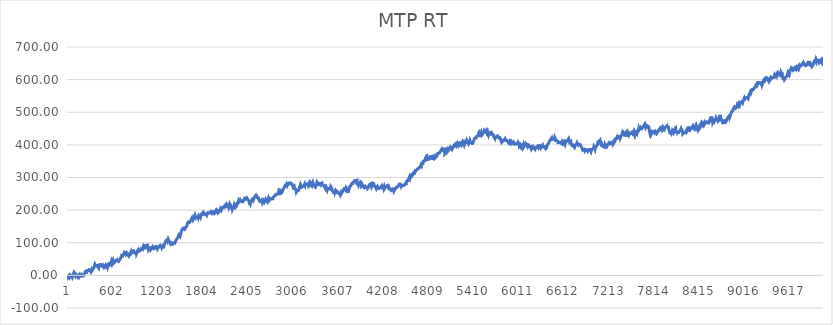
| Category | MTP RT |
|---|---|
| 0 | 0.98 |
| 1 | -0.58 |
| 2 | 0.42 |
| 3 | -1.83 |
| 4 | -4.23 |
| 5 | -5.357 |
| 6 | -4.363 |
| 7 | -3.37 |
| 8 | -2.373 |
| 9 | -1.377 |
| 10 | -2.94 |
| 11 | -1.96 |
| 12 | -0.96 |
| 13 | -3.41 |
| 14 | -2.41 |
| 15 | -1.43 |
| 16 | -2.33 |
| 17 | -1.35 |
| 18 | -3.17 |
| 19 | -5.15 |
| 20 | -6.91 |
| 21 | -5.91 |
| 22 | -4.93 |
| 23 | -3.95 |
| 24 | -2.97 |
| 25 | -1.99 |
| 26 | -3.81 |
| 27 | -2.81 |
| 28 | -1.83 |
| 29 | -0.85 |
| 30 | 0.13 |
| 31 | 1.11 |
| 32 | 2.107 |
| 33 | 0.503 |
| 34 | 1.5 |
| 35 | 0 |
| 36 | 1 |
| 37 | 0.61 |
| 38 | 1.607 |
| 39 | 0.243 |
| 40 | 1.24 |
| 41 | -1.26 |
| 42 | -0.263 |
| 43 | -1.567 |
| 44 | -0.57 |
| 45 | -2.19 |
| 46 | -2.745 |
| 47 | -1.75 |
| 48 | -3.273 |
| 49 | -2.277 |
| 50 | -1.28 |
| 51 | -4.13 |
| 52 | -3.15 |
| 53 | -2.17 |
| 54 | -4.87 |
| 55 | -6.71 |
| 56 | -5.71 |
| 57 | -4.73 |
| 58 | -5.777 |
| 59 | -4.783 |
| 60 | -3.79 |
| 61 | -2.81 |
| 62 | -1.83 |
| 63 | -0.85 |
| 64 | 0.13 |
| 65 | 1.11 |
| 66 | 0.09 |
| 67 | 1.07 |
| 68 | 2.05 |
| 69 | 3.03 |
| 70 | 4.01 |
| 71 | 4.99 |
| 72 | 5.97 |
| 73 | 6.967 |
| 74 | 4.615 |
| 75 | 5.612 |
| 76 | 6.61 |
| 77 | 7.59 |
| 78 | 8.57 |
| 79 | 9.55 |
| 80 | 10.53 |
| 81 | 8.43 |
| 82 | 7.29 |
| 83 | 8.29 |
| 84 | 6.51 |
| 85 | 7.51 |
| 86 | 4.76 |
| 87 | 5.76 |
| 88 | 3.31 |
| 89 | 1.45 |
| 90 | 2.45 |
| 91 | 0.45 |
| 92 | 1.45 |
| 93 | 0.825 |
| 94 | 1.82 |
| 95 | 2.82 |
| 96 | 0.67 |
| 97 | -1.88 |
| 98 | -0.9 |
| 99 | -1.92 |
| 100 | -0.94 |
| 101 | 0.04 |
| 102 | 1.02 |
| 103 | 2 |
| 104 | -0.2 |
| 105 | 0.78 |
| 106 | -0.22 |
| 107 | 0.76 |
| 108 | -0.26 |
| 109 | 0.74 |
| 110 | -0.66 |
| 111 | 0.34 |
| 112 | -2.06 |
| 113 | -1.06 |
| 114 | -3.06 |
| 115 | -4.24 |
| 116 | -3.26 |
| 117 | -2.28 |
| 118 | -3.92 |
| 119 | -2.92 |
| 120 | -4.08 |
| 121 | -3.1 |
| 122 | -2.1 |
| 123 | -2.94 |
| 124 | -1.96 |
| 125 | -0.98 |
| 126 | 0.02 |
| 127 | -2.88 |
| 128 | -1.9 |
| 129 | -0.92 |
| 130 | 0.06 |
| 131 | 1.06 |
| 132 | -1.49 |
| 133 | -4.34 |
| 134 | -5.13 |
| 135 | -4.13 |
| 136 | -3.15 |
| 137 | -2.17 |
| 138 | -3.53 |
| 139 | -4.46 |
| 140 | -3.48 |
| 141 | -2.5 |
| 142 | -1.52 |
| 143 | -0.54 |
| 144 | -1.54 |
| 145 | -3.06 |
| 146 | -2.06 |
| 147 | -1.08 |
| 148 | -2.1 |
| 149 | -3.94 |
| 150 | -2.96 |
| 151 | -1.98 |
| 152 | -3.8 |
| 153 | -2.8 |
| 154 | -1.82 |
| 155 | -0.823 |
| 156 | -2.207 |
| 157 | -1.21 |
| 158 | -2.23 |
| 159 | -1.23 |
| 160 | -3.73 |
| 161 | -5.78 |
| 162 | -4.8 |
| 163 | -3.82 |
| 164 | -2.84 |
| 165 | -1.86 |
| 166 | -0.88 |
| 167 | 0.1 |
| 168 | -1.95 |
| 169 | -0.95 |
| 170 | 0.047 |
| 171 | -1.397 |
| 172 | -0.4 |
| 173 | -1.78 |
| 174 | -0.78 |
| 175 | 0.2 |
| 176 | 1.18 |
| 177 | -0.06 |
| 178 | 0.92 |
| 179 | 1.9 |
| 180 | 0.06 |
| 181 | 1.06 |
| 182 | 2.06 |
| 183 | 0.06 |
| 184 | -1.1 |
| 185 | -0.1 |
| 186 | -0.95 |
| 187 | 0.03 |
| 188 | -1.97 |
| 189 | -0.99 |
| 190 | -0.01 |
| 191 | 0.99 |
| 192 | -0.85 |
| 193 | -3.65 |
| 194 | -2.67 |
| 195 | -1.69 |
| 196 | -0.71 |
| 197 | 0.29 |
| 198 | -1.55 |
| 199 | -2.81 |
| 200 | -4.11 |
| 201 | -3.11 |
| 202 | -2.13 |
| 203 | -1.15 |
| 204 | -0.17 |
| 205 | 0.81 |
| 206 | 1.79 |
| 207 | 1.04 |
| 208 | 2.02 |
| 209 | 3 |
| 210 | 1.6 |
| 211 | 2.6 |
| 212 | 3.6 |
| 213 | 1.86 |
| 214 | 2.84 |
| 215 | 3.82 |
| 216 | 2.673 |
| 217 | 3.667 |
| 218 | 4.66 |
| 219 | 3.83 |
| 220 | 4.83 |
| 221 | 5.81 |
| 222 | 6.79 |
| 223 | 7.78 |
| 224 | 8.78 |
| 225 | 6.68 |
| 226 | 7.66 |
| 227 | 8.66 |
| 228 | 6.21 |
| 229 | 7.19 |
| 230 | 8.17 |
| 231 | 9.15 |
| 232 | 10.13 |
| 233 | 11.11 |
| 234 | 12.11 |
| 235 | 13.11 |
| 236 | 10.91 |
| 237 | 11.89 |
| 238 | 12.87 |
| 239 | 13.85 |
| 240 | 12.61 |
| 241 | 11.443 |
| 242 | 12.437 |
| 243 | 13.43 |
| 244 | 11.55 |
| 245 | 12.55 |
| 246 | 10.61 |
| 247 | 11.59 |
| 248 | 10.41 |
| 249 | 11.39 |
| 250 | 12.37 |
| 251 | 13.35 |
| 252 | 14.33 |
| 253 | 13.34 |
| 254 | 14.34 |
| 255 | 15.32 |
| 256 | 14.52 |
| 257 | 15.52 |
| 258 | 14.69 |
| 259 | 13.03 |
| 260 | 14.03 |
| 261 | 15.028 |
| 262 | 16.025 |
| 263 | 17.022 |
| 264 | 14.47 |
| 265 | 13.05 |
| 266 | 14.05 |
| 267 | 12.89 |
| 268 | 13.87 |
| 269 | 12.19 |
| 270 | 13.17 |
| 271 | 14.15 |
| 272 | 15.13 |
| 273 | 16.11 |
| 274 | 14.23 |
| 275 | 15.23 |
| 276 | 16.23 |
| 277 | 14.23 |
| 278 | 15.23 |
| 279 | 16.23 |
| 280 | 17.21 |
| 281 | 18.19 |
| 282 | 19.17 |
| 283 | 20.15 |
| 284 | 18.55 |
| 285 | 19.55 |
| 286 | 18.39 |
| 287 | 19.37 |
| 288 | 17.71 |
| 289 | 18.71 |
| 290 | 16.93 |
| 291 | 17.93 |
| 292 | 15.93 |
| 293 | 16.93 |
| 294 | 15.65 |
| 295 | 14.11 |
| 296 | 15.09 |
| 297 | 16.07 |
| 298 | 15.14 |
| 299 | 13.76 |
| 300 | 14.76 |
| 301 | 12.46 |
| 302 | 13.46 |
| 303 | 14.44 |
| 304 | 12.56 |
| 305 | 13.54 |
| 306 | 14.52 |
| 307 | 15.5 |
| 308 | 14.54 |
| 309 | 15.52 |
| 310 | 16.5 |
| 311 | 17.48 |
| 312 | 14.93 |
| 313 | 12.38 |
| 314 | 13.38 |
| 315 | 11.64 |
| 316 | 12.64 |
| 317 | 11.56 |
| 318 | 12.56 |
| 319 | 13.54 |
| 320 | 13.18 |
| 321 | 14.16 |
| 322 | 15.14 |
| 323 | 16.12 |
| 324 | 17.1 |
| 325 | 18.08 |
| 326 | 19.08 |
| 327 | 16.63 |
| 328 | 17.61 |
| 329 | 18.61 |
| 330 | 15.91 |
| 331 | 16.89 |
| 332 | 17.87 |
| 333 | 18.85 |
| 334 | 19.85 |
| 335 | 17.6 |
| 336 | 18.58 |
| 337 | 19.56 |
| 338 | 20.54 |
| 339 | 21.54 |
| 340 | 19.14 |
| 341 | 20.12 |
| 342 | 21.1 |
| 343 | 22.08 |
| 344 | 23.06 |
| 345 | 24.04 |
| 346 | 22.592 |
| 347 | 23.585 |
| 348 | 24.578 |
| 349 | 25.57 |
| 350 | 26.55 |
| 351 | 27.53 |
| 352 | 28.51 |
| 353 | 29.49 |
| 354 | 30.47 |
| 355 | 31.45 |
| 356 | 32.43 |
| 357 | 33.41 |
| 358 | 34.41 |
| 359 | 35.41 |
| 360 | 33.41 |
| 361 | 34.407 |
| 362 | 32.843 |
| 363 | 33.84 |
| 364 | 34.84 |
| 365 | 33.3 |
| 366 | 31.4 |
| 367 | 32.4 |
| 368 | 30.7 |
| 369 | 31.7 |
| 370 | 28.9 |
| 371 | 29.88 |
| 372 | 27.28 |
| 373 | 28.26 |
| 374 | 29.24 |
| 375 | 30.22 |
| 376 | 31.2 |
| 377 | 32.197 |
| 378 | 30.573 |
| 379 | 31.57 |
| 380 | 32.55 |
| 381 | 33.53 |
| 382 | 34.51 |
| 383 | 32.41 |
| 384 | 29.56 |
| 385 | 28.4 |
| 386 | 29.4 |
| 387 | 28 |
| 388 | 26.54 |
| 389 | 27.54 |
| 390 | 26.91 |
| 391 | 27.9 |
| 392 | 28.89 |
| 393 | 27.31 |
| 394 | 28.31 |
| 395 | 29.29 |
| 396 | 26.44 |
| 397 | 24.96 |
| 398 | 25.94 |
| 399 | 26.92 |
| 400 | 27.9 |
| 401 | 28.88 |
| 402 | 27.62 |
| 403 | 25.7 |
| 404 | 26.7 |
| 405 | 24.74 |
| 406 | 25.74 |
| 407 | 23.9 |
| 408 | 22.297 |
| 409 | 23.293 |
| 410 | 24.29 |
| 411 | 25.27 |
| 412 | 26.25 |
| 413 | 27.23 |
| 414 | 28.21 |
| 415 | 29.19 |
| 416 | 30.17 |
| 417 | 31.17 |
| 418 | 29.59 |
| 419 | 30.57 |
| 420 | 31.55 |
| 421 | 32.53 |
| 422 | 33.51 |
| 423 | 34.49 |
| 424 | 35.49 |
| 425 | 33.39 |
| 426 | 32.37 |
| 427 | 33.37 |
| 428 | 30.77 |
| 429 | 31.765 |
| 430 | 32.76 |
| 431 | 30.555 |
| 432 | 31.55 |
| 433 | 32.53 |
| 434 | 33.51 |
| 435 | 34.49 |
| 436 | 33.37 |
| 437 | 31.02 |
| 438 | 32 |
| 439 | 30.557 |
| 440 | 31.553 |
| 441 | 32.55 |
| 442 | 31.805 |
| 443 | 32.8 |
| 444 | 33.8 |
| 445 | 31.2 |
| 446 | 29.64 |
| 447 | 30.62 |
| 448 | 28.27 |
| 449 | 29.25 |
| 450 | 30.23 |
| 451 | 31.21 |
| 452 | 32.19 |
| 453 | 29.39 |
| 454 | 28.19 |
| 455 | 29.19 |
| 456 | 30.17 |
| 457 | 31.15 |
| 458 | 32.13 |
| 459 | 31.44 |
| 460 | 32.42 |
| 461 | 33.42 |
| 462 | 31.42 |
| 463 | 32.42 |
| 464 | 30.02 |
| 465 | 31.02 |
| 466 | 32.02 |
| 467 | 29.42 |
| 468 | 30.4 |
| 469 | 27.7 |
| 470 | 28.68 |
| 471 | 29.66 |
| 472 | 27.86 |
| 473 | 26.42 |
| 474 | 27.4 |
| 475 | 28.38 |
| 476 | 27.67 |
| 477 | 25.79 |
| 478 | 23.93 |
| 479 | 24.91 |
| 480 | 25.89 |
| 481 | 26.87 |
| 482 | 24.93 |
| 483 | 25.93 |
| 484 | 26.91 |
| 485 | 25.33 |
| 486 | 26.33 |
| 487 | 25.01 |
| 488 | 25.99 |
| 489 | 26.97 |
| 490 | 27.95 |
| 491 | 28.93 |
| 492 | 29.93 |
| 493 | 27.23 |
| 494 | 28.21 |
| 495 | 27.203 |
| 496 | 28.197 |
| 497 | 29.19 |
| 498 | 30.17 |
| 499 | 31.15 |
| 500 | 30.55 |
| 501 | 31.53 |
| 502 | 30.41 |
| 503 | 28.47 |
| 504 | 29.45 |
| 505 | 30.45 |
| 506 | 28.49 |
| 507 | 26.65 |
| 508 | 24.4 |
| 509 | 25.38 |
| 510 | 26.36 |
| 511 | 25.333 |
| 512 | 26.327 |
| 513 | 27.32 |
| 514 | 28.3 |
| 515 | 29.28 |
| 516 | 27.797 |
| 517 | 28.793 |
| 518 | 29.79 |
| 519 | 30.77 |
| 520 | 31.77 |
| 521 | 28.97 |
| 522 | 29.97 |
| 523 | 27.07 |
| 524 | 28.07 |
| 525 | 25.27 |
| 526 | 26.25 |
| 527 | 27.23 |
| 528 | 28.21 |
| 529 | 29.19 |
| 530 | 27.09 |
| 531 | 28.07 |
| 532 | 26.79 |
| 533 | 27.77 |
| 534 | 28.75 |
| 535 | 29.73 |
| 536 | 30.71 |
| 537 | 31.69 |
| 538 | 32.67 |
| 539 | 33.65 |
| 540 | 34.65 |
| 541 | 31.9 |
| 542 | 32.88 |
| 543 | 33.86 |
| 544 | 34.84 |
| 545 | 35.835 |
| 546 | 33.83 |
| 547 | 34.825 |
| 548 | 35.82 |
| 549 | 36.82 |
| 550 | 35.38 |
| 551 | 34.735 |
| 552 | 35.73 |
| 553 | 36.73 |
| 554 | 34.79 |
| 555 | 35.77 |
| 556 | 36.77 |
| 557 | 35.65 |
| 558 | 36.63 |
| 559 | 37.61 |
| 560 | 36.13 |
| 561 | 37.13 |
| 562 | 34.53 |
| 563 | 35.51 |
| 564 | 33.97 |
| 565 | 34.95 |
| 566 | 35.93 |
| 567 | 34.15 |
| 568 | 35.15 |
| 569 | 36.15 |
| 570 | 34.39 |
| 571 | 35.37 |
| 572 | 36.35 |
| 573 | 37.33 |
| 574 | 38.31 |
| 575 | 39.29 |
| 576 | 40.27 |
| 577 | 41.25 |
| 578 | 42.23 |
| 579 | 40.23 |
| 580 | 41.21 |
| 581 | 39.75 |
| 582 | 40.75 |
| 583 | 38.83 |
| 584 | 39.83 |
| 585 | 40.81 |
| 586 | 41.79 |
| 587 | 42.77 |
| 588 | 41.07 |
| 589 | 38.72 |
| 590 | 39.7 |
| 591 | 40.68 |
| 592 | 41.68 |
| 593 | 39.33 |
| 594 | 40.31 |
| 595 | 41.29 |
| 596 | 42.27 |
| 597 | 41.95 |
| 598 | 42.93 |
| 599 | 43.91 |
| 600 | 44.89 |
| 601 | 45.87 |
| 602 | 46.85 |
| 603 | 47.85 |
| 604 | 45.15 |
| 605 | 43.65 |
| 606 | 42.17 |
| 607 | 40.43 |
| 608 | 41.43 |
| 609 | 40.27 |
| 610 | 41.27 |
| 611 | 39.73 |
| 612 | 38.21 |
| 613 | 39.21 |
| 614 | 40.19 |
| 615 | 41.17 |
| 616 | 40.27 |
| 617 | 39.37 |
| 618 | 40.37 |
| 619 | 37.92 |
| 620 | 38.92 |
| 621 | 39.92 |
| 622 | 38.44 |
| 623 | 39.42 |
| 624 | 40.4 |
| 625 | 41.397 |
| 626 | 39.813 |
| 627 | 40.81 |
| 628 | 41.79 |
| 629 | 42.77 |
| 630 | 43.77 |
| 631 | 41.32 |
| 632 | 39.86 |
| 633 | 40.86 |
| 634 | 41.84 |
| 635 | 42.82 |
| 636 | 43.8 |
| 637 | 44.78 |
| 638 | 45.76 |
| 639 | 46.76 |
| 640 | 44.94 |
| 641 | 45.94 |
| 642 | 44.4 |
| 643 | 42 |
| 644 | 42.98 |
| 645 | 42.17 |
| 646 | 43.17 |
| 647 | 44.15 |
| 648 | 45.13 |
| 649 | 46.11 |
| 650 | 47.09 |
| 651 | 48.09 |
| 652 | 46.15 |
| 653 | 47.15 |
| 654 | 45.43 |
| 655 | 46.41 |
| 656 | 47.39 |
| 657 | 45.67 |
| 658 | 46.67 |
| 659 | 44.91 |
| 660 | 44.17 |
| 661 | 45.15 |
| 662 | 46.15 |
| 663 | 44.37 |
| 664 | 45.35 |
| 665 | 46.33 |
| 666 | 45.413 |
| 667 | 46.407 |
| 668 | 47.4 |
| 669 | 45.78 |
| 670 | 43.18 |
| 671 | 44.16 |
| 672 | 45.16 |
| 673 | 42.81 |
| 674 | 43.79 |
| 675 | 44.77 |
| 676 | 43.61 |
| 677 | 43.055 |
| 678 | 44.05 |
| 679 | 43.435 |
| 680 | 44.43 |
| 681 | 45.41 |
| 682 | 46.39 |
| 683 | 47.37 |
| 684 | 48.35 |
| 685 | 49.33 |
| 686 | 46.78 |
| 687 | 47.76 |
| 688 | 48.74 |
| 689 | 47.83 |
| 690 | 46.81 |
| 691 | 47.79 |
| 692 | 46.96 |
| 693 | 47.94 |
| 694 | 48.92 |
| 695 | 49.9 |
| 696 | 50.88 |
| 697 | 51.86 |
| 698 | 50.99 |
| 699 | 51.99 |
| 700 | 52.97 |
| 701 | 53.97 |
| 702 | 51.72 |
| 703 | 52.72 |
| 704 | 51.08 |
| 705 | 52.08 |
| 706 | 53.06 |
| 707 | 54.04 |
| 708 | 55.02 |
| 709 | 56 |
| 710 | 56.98 |
| 711 | 57.96 |
| 712 | 58.94 |
| 713 | 59.92 |
| 714 | 60.9 |
| 715 | 61.88 |
| 716 | 62.86 |
| 717 | 60.76 |
| 718 | 57.96 |
| 719 | 58.94 |
| 720 | 59.92 |
| 721 | 60.9 |
| 722 | 61.88 |
| 723 | 61.375 |
| 724 | 62.37 |
| 725 | 61.52 |
| 726 | 62.5 |
| 727 | 61.16 |
| 728 | 59.64 |
| 729 | 60.64 |
| 730 | 59.553 |
| 731 | 60.547 |
| 732 | 61.54 |
| 733 | 62.52 |
| 734 | 63.5 |
| 735 | 64.48 |
| 736 | 62.64 |
| 737 | 63.62 |
| 738 | 64.6 |
| 739 | 62.98 |
| 740 | 61.74 |
| 741 | 62.72 |
| 742 | 61.74 |
| 743 | 62.74 |
| 744 | 63.72 |
| 745 | 64.7 |
| 746 | 65.68 |
| 747 | 66.66 |
| 748 | 67.64 |
| 749 | 68.62 |
| 750 | 69.612 |
| 751 | 70.605 |
| 752 | 71.597 |
| 753 | 69.95 |
| 754 | 70.93 |
| 755 | 71.91 |
| 756 | 69.99 |
| 757 | 70.99 |
| 758 | 69.75 |
| 759 | 68.65 |
| 760 | 69.65 |
| 761 | 68.925 |
| 762 | 69.92 |
| 763 | 69.14 |
| 764 | 67.84 |
| 765 | 68.84 |
| 766 | 69.82 |
| 767 | 67.82 |
| 768 | 68.8 |
| 769 | 67.04 |
| 770 | 65.28 |
| 771 | 66.26 |
| 772 | 67.26 |
| 773 | 65.16 |
| 774 | 66.16 |
| 775 | 65.16 |
| 776 | 66.16 |
| 777 | 67.14 |
| 778 | 68.12 |
| 779 | 69.1 |
| 780 | 70.08 |
| 781 | 69.28 |
| 782 | 70.26 |
| 783 | 69.73 |
| 784 | 69.03 |
| 785 | 70.03 |
| 786 | 68.03 |
| 787 | 66.29 |
| 788 | 67.29 |
| 789 | 65.39 |
| 790 | 66.39 |
| 791 | 67.37 |
| 792 | 68.37 |
| 793 | 66.32 |
| 794 | 64.22 |
| 795 | 65.2 |
| 796 | 63.8 |
| 797 | 64.8 |
| 798 | 63.6 |
| 799 | 64.6 |
| 800 | 65.58 |
| 801 | 63.13 |
| 802 | 60.98 |
| 803 | 61.98 |
| 804 | 62.96 |
| 805 | 63.94 |
| 806 | 64.94 |
| 807 | 65.94 |
| 808 | 63.54 |
| 809 | 60.99 |
| 810 | 61.97 |
| 811 | 62.95 |
| 812 | 63.93 |
| 813 | 64.91 |
| 814 | 65.89 |
| 815 | 66.89 |
| 816 | 67.89 |
| 817 | 65.93 |
| 818 | 66.91 |
| 819 | 67.91 |
| 820 | 68.91 |
| 821 | 66.06 |
| 822 | 64.9 |
| 823 | 65.88 |
| 824 | 65.36 |
| 825 | 63.11 |
| 826 | 64.09 |
| 827 | 65.07 |
| 828 | 66.05 |
| 829 | 67.03 |
| 830 | 68.01 |
| 831 | 69.007 |
| 832 | 70.003 |
| 833 | 68.26 |
| 834 | 69.24 |
| 835 | 70.22 |
| 836 | 71.2 |
| 837 | 72.18 |
| 838 | 70.08 |
| 839 | 67.33 |
| 840 | 68.31 |
| 841 | 69.29 |
| 842 | 70.27 |
| 843 | 71.25 |
| 844 | 72.23 |
| 845 | 73.21 |
| 846 | 74.19 |
| 847 | 75.17 |
| 848 | 74.03 |
| 849 | 71.48 |
| 850 | 72.46 |
| 851 | 73.452 |
| 852 | 71.785 |
| 853 | 72.777 |
| 854 | 73.77 |
| 855 | 72.07 |
| 856 | 73.07 |
| 857 | 74.05 |
| 858 | 75.03 |
| 859 | 76.01 |
| 860 | 74.67 |
| 861 | 75.65 |
| 862 | 76.63 |
| 863 | 77.63 |
| 864 | 76.51 |
| 865 | 75.29 |
| 866 | 76.27 |
| 867 | 77.25 |
| 868 | 74.35 |
| 869 | 75.33 |
| 870 | 76.31 |
| 871 | 77.31 |
| 872 | 75.39 |
| 873 | 76.39 |
| 874 | 74.49 |
| 875 | 71.84 |
| 876 | 69.49 |
| 877 | 70.49 |
| 878 | 68.63 |
| 879 | 69.61 |
| 880 | 70.59 |
| 881 | 71.57 |
| 882 | 72.55 |
| 883 | 71.33 |
| 884 | 72.33 |
| 885 | 70.59 |
| 886 | 68.09 |
| 887 | 69.07 |
| 888 | 67.85 |
| 889 | 68.83 |
| 890 | 69.81 |
| 891 | 67.89 |
| 892 | 66.85 |
| 893 | 67.85 |
| 894 | 68.83 |
| 895 | 69.81 |
| 896 | 70.79 |
| 897 | 69.23 |
| 898 | 67.03 |
| 899 | 66.1 |
| 900 | 67.1 |
| 901 | 64.85 |
| 902 | 65.83 |
| 903 | 66.81 |
| 904 | 67.79 |
| 905 | 68.77 |
| 906 | 69.75 |
| 907 | 68.37 |
| 908 | 69.37 |
| 909 | 70.37 |
| 910 | 67.97 |
| 911 | 66.67 |
| 912 | 67.67 |
| 913 | 68.667 |
| 914 | 66.923 |
| 915 | 67.92 |
| 916 | 68.9 |
| 917 | 69.88 |
| 918 | 70.86 |
| 919 | 71.84 |
| 920 | 72.82 |
| 921 | 73.8 |
| 922 | 74.78 |
| 923 | 73.48 |
| 924 | 74.46 |
| 925 | 75.44 |
| 926 | 74.04 |
| 927 | 75.04 |
| 928 | 72.89 |
| 929 | 73.87 |
| 930 | 74.85 |
| 931 | 75.83 |
| 932 | 76.81 |
| 933 | 77.79 |
| 934 | 77.28 |
| 935 | 74.93 |
| 936 | 75.93 |
| 937 | 73.58 |
| 938 | 72.22 |
| 939 | 73.2 |
| 940 | 74.18 |
| 941 | 72.52 |
| 942 | 71.22 |
| 943 | 72.22 |
| 944 | 73.22 |
| 945 | 70.82 |
| 946 | 71.8 |
| 947 | 72.78 |
| 948 | 73.76 |
| 949 | 74.74 |
| 950 | 73.1 |
| 951 | 74.1 |
| 952 | 75.08 |
| 953 | 76.06 |
| 954 | 74.9 |
| 955 | 75.9 |
| 956 | 74.813 |
| 957 | 75.807 |
| 958 | 76.8 |
| 959 | 75.87 |
| 960 | 74.65 |
| 961 | 75.65 |
| 962 | 76.63 |
| 963 | 77.61 |
| 964 | 78.61 |
| 965 | 75.91 |
| 966 | 76.89 |
| 967 | 76.19 |
| 968 | 77.17 |
| 969 | 78.15 |
| 970 | 79.148 |
| 971 | 80.145 |
| 972 | 81.143 |
| 973 | 78.44 |
| 974 | 79.42 |
| 975 | 78.293 |
| 976 | 79.287 |
| 977 | 80.28 |
| 978 | 81.26 |
| 979 | 82.24 |
| 980 | 83.22 |
| 981 | 81.72 |
| 982 | 79.52 |
| 983 | 80.5 |
| 984 | 81.5 |
| 985 | 78.9 |
| 986 | 79.9 |
| 987 | 78.82 |
| 988 | 79.8 |
| 989 | 80.78 |
| 990 | 81.76 |
| 991 | 82.74 |
| 992 | 83.72 |
| 993 | 84.72 |
| 994 | 82.57 |
| 995 | 83.55 |
| 996 | 84.53 |
| 997 | 85.51 |
| 998 | 86.49 |
| 999 | 87.47 |
| 1000 | 88.45 |
| 1001 | 86.45 |
| 1002 | 86.04 |
| 1003 | 84.1 |
| 1004 | 85.1 |
| 1005 | 86.1 |
| 1006 | 84.24 |
| 1007 | 85.24 |
| 1008 | 86.24 |
| 1009 | 87.22 |
| 1010 | 88.2 |
| 1011 | 89.18 |
| 1012 | 87.08 |
| 1013 | 88.08 |
| 1014 | 89.06 |
| 1015 | 90.04 |
| 1016 | 91.02 |
| 1017 | 92 |
| 1018 | 92.98 |
| 1019 | 91.78 |
| 1020 | 92.777 |
| 1021 | 91.213 |
| 1022 | 92.21 |
| 1023 | 93.19 |
| 1024 | 91.51 |
| 1025 | 90.19 |
| 1026 | 91.19 |
| 1027 | 92.19 |
| 1028 | 89.74 |
| 1029 | 90.72 |
| 1030 | 91.7 |
| 1031 | 89.84 |
| 1032 | 90.82 |
| 1033 | 88.57 |
| 1034 | 89.57 |
| 1035 | 88.15 |
| 1036 | 86.35 |
| 1037 | 87.35 |
| 1038 | 88.35 |
| 1039 | 89.33 |
| 1040 | 90.31 |
| 1041 | 91.29 |
| 1042 | 92.27 |
| 1043 | 91.03 |
| 1044 | 92.01 |
| 1045 | 90.81 |
| 1046 | 91.803 |
| 1047 | 90.697 |
| 1048 | 91.69 |
| 1049 | 92.69 |
| 1050 | 90.89 |
| 1051 | 91.89 |
| 1052 | 92.87 |
| 1053 | 91.92 |
| 1054 | 90.88 |
| 1055 | 91.88 |
| 1056 | 92.88 |
| 1057 | 90.18 |
| 1058 | 88.7 |
| 1059 | 87.66 |
| 1060 | 86.18 |
| 1061 | 85 |
| 1062 | 86 |
| 1063 | 85.07 |
| 1064 | 83.02 |
| 1065 | 82.09 |
| 1066 | 80.57 |
| 1067 | 81.57 |
| 1068 | 80.49 |
| 1069 | 81.47 |
| 1070 | 82.45 |
| 1071 | 83.43 |
| 1072 | 84.43 |
| 1073 | 83.03 |
| 1074 | 84.01 |
| 1075 | 84.99 |
| 1076 | 85.99 |
| 1077 | 83.79 |
| 1078 | 84.79 |
| 1079 | 82.44 |
| 1080 | 80.86 |
| 1081 | 81.84 |
| 1082 | 82.82 |
| 1083 | 80.94 |
| 1084 | 79.02 |
| 1085 | 80.02 |
| 1086 | 81 |
| 1087 | 81.98 |
| 1088 | 82.96 |
| 1089 | 83.94 |
| 1090 | 84.92 |
| 1091 | 85.9 |
| 1092 | 86.88 |
| 1093 | 87.86 |
| 1094 | 88.86 |
| 1095 | 86.11 |
| 1096 | 87.11 |
| 1097 | 85.67 |
| 1098 | 83.47 |
| 1099 | 81.69 |
| 1100 | 82.69 |
| 1101 | 80.04 |
| 1102 | 78.813 |
| 1103 | 79.807 |
| 1104 | 80.8 |
| 1105 | 81.78 |
| 1106 | 82.777 |
| 1107 | 81.033 |
| 1108 | 82.03 |
| 1109 | 83.03 |
| 1110 | 82.08 |
| 1111 | 83.06 |
| 1112 | 84.04 |
| 1113 | 85.02 |
| 1114 | 83.28 |
| 1115 | 81.4 |
| 1116 | 82.4 |
| 1117 | 83.38 |
| 1118 | 84.36 |
| 1119 | 85.34 |
| 1120 | 84.38 |
| 1121 | 85.38 |
| 1122 | 86.36 |
| 1123 | 87.36 |
| 1124 | 85.26 |
| 1125 | 86.26 |
| 1126 | 84.42 |
| 1127 | 85.4 |
| 1128 | 82.85 |
| 1129 | 81.71 |
| 1130 | 82.69 |
| 1131 | 83.67 |
| 1132 | 80.92 |
| 1133 | 81.9 |
| 1134 | 80.4 |
| 1135 | 81.38 |
| 1136 | 82.36 |
| 1137 | 81.43 |
| 1138 | 82.43 |
| 1139 | 81.05 |
| 1140 | 82.03 |
| 1141 | 83.027 |
| 1142 | 81.483 |
| 1143 | 82.48 |
| 1144 | 81.92 |
| 1145 | 81.32 |
| 1146 | 82.3 |
| 1147 | 83.28 |
| 1148 | 81.56 |
| 1149 | 82.54 |
| 1150 | 83.533 |
| 1151 | 84.525 |
| 1152 | 82.838 |
| 1153 | 83.83 |
| 1154 | 84.81 |
| 1155 | 85.79 |
| 1156 | 86.79 |
| 1157 | 84.97 |
| 1158 | 85.97 |
| 1159 | 86.95 |
| 1160 | 87.93 |
| 1161 | 88.91 |
| 1162 | 89.89 |
| 1163 | 89.445 |
| 1164 | 90.44 |
| 1165 | 89.08 |
| 1166 | 87.6 |
| 1167 | 88.6 |
| 1168 | 87.88 |
| 1169 | 88.86 |
| 1170 | 89.86 |
| 1171 | 87.61 |
| 1172 | 88.59 |
| 1173 | 87.69 |
| 1174 | 88.69 |
| 1175 | 87.03 |
| 1176 | 88.01 |
| 1177 | 88.99 |
| 1178 | 87.41 |
| 1179 | 88.39 |
| 1180 | 85.94 |
| 1181 | 84.72 |
| 1182 | 85.7 |
| 1183 | 86.7 |
| 1184 | 84.65 |
| 1185 | 82.15 |
| 1186 | 83.13 |
| 1187 | 81.77 |
| 1188 | 80.81 |
| 1189 | 79.73 |
| 1190 | 80.73 |
| 1191 | 79.53 |
| 1192 | 80.51 |
| 1193 | 81.49 |
| 1194 | 82.47 |
| 1195 | 83.45 |
| 1196 | 84.43 |
| 1197 | 83.8 |
| 1198 | 84.78 |
| 1199 | 85.76 |
| 1200 | 86.74 |
| 1201 | 84.98 |
| 1202 | 83.833 |
| 1203 | 84.827 |
| 1204 | 85.82 |
| 1205 | 84.693 |
| 1206 | 85.687 |
| 1207 | 86.68 |
| 1208 | 87.66 |
| 1209 | 86.54 |
| 1210 | 87.54 |
| 1211 | 85.44 |
| 1212 | 86.44 |
| 1213 | 87.42 |
| 1214 | 86.2 |
| 1215 | 87.2 |
| 1216 | 88.18 |
| 1217 | 89.16 |
| 1218 | 90.14 |
| 1219 | 89.08 |
| 1220 | 90.08 |
| 1221 | 91.06 |
| 1222 | 90.555 |
| 1223 | 91.55 |
| 1224 | 92.55 |
| 1225 | 91.33 |
| 1226 | 90.55 |
| 1227 | 87.6 |
| 1228 | 86.69 |
| 1229 | 85.43 |
| 1230 | 86.43 |
| 1231 | 87.41 |
| 1232 | 88.39 |
| 1233 | 86.97 |
| 1234 | 87.97 |
| 1235 | 85.32 |
| 1236 | 86.3 |
| 1237 | 87.28 |
| 1238 | 88.28 |
| 1239 | 89.28 |
| 1240 | 87.36 |
| 1241 | 88.36 |
| 1242 | 86.4 |
| 1243 | 87.38 |
| 1244 | 86.3 |
| 1245 | 87.3 |
| 1246 | 85.2 |
| 1247 | 83.46 |
| 1248 | 84.46 |
| 1249 | 85.44 |
| 1250 | 86.42 |
| 1251 | 87.4 |
| 1252 | 88.38 |
| 1253 | 89.38 |
| 1254 | 87.38 |
| 1255 | 88.38 |
| 1256 | 89.38 |
| 1257 | 90.38 |
| 1258 | 88.18 |
| 1259 | 85.28 |
| 1260 | 83.78 |
| 1261 | 84.78 |
| 1262 | 83.3 |
| 1263 | 84.28 |
| 1264 | 85.26 |
| 1265 | 86.26 |
| 1266 | 85.3 |
| 1267 | 83.58 |
| 1268 | 84.56 |
| 1269 | 85.56 |
| 1270 | 83.68 |
| 1271 | 84.68 |
| 1272 | 85.66 |
| 1273 | 86.64 |
| 1274 | 87.62 |
| 1275 | 88.6 |
| 1276 | 89.58 |
| 1277 | 90.56 |
| 1278 | 91.54 |
| 1279 | 92.52 |
| 1280 | 93.5 |
| 1281 | 94.48 |
| 1282 | 93.24 |
| 1283 | 94.24 |
| 1284 | 95.22 |
| 1285 | 96.2 |
| 1286 | 94.52 |
| 1287 | 95.5 |
| 1288 | 96.48 |
| 1289 | 97.46 |
| 1290 | 98.44 |
| 1291 | 99.42 |
| 1292 | 100.4 |
| 1293 | 101.38 |
| 1294 | 102.36 |
| 1295 | 103.34 |
| 1296 | 104.32 |
| 1297 | 103 |
| 1298 | 104 |
| 1299 | 104.98 |
| 1300 | 103.3 |
| 1301 | 104.3 |
| 1302 | 105.28 |
| 1303 | 106.26 |
| 1304 | 107.24 |
| 1305 | 108.22 |
| 1306 | 109.2 |
| 1307 | 107.56 |
| 1308 | 106.04 |
| 1309 | 107.02 |
| 1310 | 108 |
| 1311 | 108.98 |
| 1312 | 108.27 |
| 1313 | 107.73 |
| 1314 | 107.06 |
| 1315 | 106.103 |
| 1316 | 107.097 |
| 1317 | 108.09 |
| 1318 | 109.07 |
| 1319 | 110.05 |
| 1320 | 111.03 |
| 1321 | 112.01 |
| 1322 | 112.99 |
| 1323 | 110.79 |
| 1324 | 109.27 |
| 1325 | 107.53 |
| 1326 | 108.51 |
| 1327 | 109.49 |
| 1328 | 108.423 |
| 1329 | 109.417 |
| 1330 | 110.41 |
| 1331 | 111.39 |
| 1332 | 112.37 |
| 1333 | 111.39 |
| 1334 | 110.21 |
| 1335 | 111.19 |
| 1336 | 109.77 |
| 1337 | 108.03 |
| 1338 | 106.19 |
| 1339 | 107.17 |
| 1340 | 108.15 |
| 1341 | 109.13 |
| 1342 | 110.11 |
| 1343 | 108.06 |
| 1344 | 109.04 |
| 1345 | 107.84 |
| 1346 | 105.96 |
| 1347 | 106.96 |
| 1348 | 104.11 |
| 1349 | 102.89 |
| 1350 | 103.89 |
| 1351 | 102.17 |
| 1352 | 101.45 |
| 1353 | 100.31 |
| 1354 | 97.66 |
| 1355 | 98.64 |
| 1356 | 99.62 |
| 1357 | 100.6 |
| 1358 | 101.6 |
| 1359 | 100.1 |
| 1360 | 99.08 |
| 1361 | 100.08 |
| 1362 | 97.43 |
| 1363 | 98.43 |
| 1364 | 95.53 |
| 1365 | 92.88 |
| 1366 | 93.88 |
| 1367 | 94.88 |
| 1368 | 95.86 |
| 1369 | 96.84 |
| 1370 | 96.41 |
| 1371 | 97.39 |
| 1372 | 98.39 |
| 1373 | 96.09 |
| 1374 | 97.07 |
| 1375 | 98.05 |
| 1376 | 99.03 |
| 1377 | 100.03 |
| 1378 | 101.03 |
| 1379 | 98.78 |
| 1380 | 99.76 |
| 1381 | 100.74 |
| 1382 | 101.74 |
| 1383 | 99.69 |
| 1384 | 100.67 |
| 1385 | 101.67 |
| 1386 | 99.47 |
| 1387 | 96.72 |
| 1388 | 97.7 |
| 1389 | 98.7 |
| 1390 | 95.95 |
| 1391 | 96.93 |
| 1392 | 97.91 |
| 1393 | 98.907 |
| 1394 | 97.523 |
| 1395 | 98.52 |
| 1396 | 97.393 |
| 1397 | 98.387 |
| 1398 | 99.38 |
| 1399 | 100.36 |
| 1400 | 101.36 |
| 1401 | 102.36 |
| 1402 | 100.26 |
| 1403 | 99.33 |
| 1404 | 98.23 |
| 1405 | 99.23 |
| 1406 | 97.33 |
| 1407 | 98.33 |
| 1408 | 99.31 |
| 1409 | 97.99 |
| 1410 | 96.83 |
| 1411 | 97.83 |
| 1412 | 98.83 |
| 1413 | 97.23 |
| 1414 | 96.03 |
| 1415 | 97.01 |
| 1416 | 95.23 |
| 1417 | 96.23 |
| 1418 | 97.21 |
| 1419 | 98.19 |
| 1420 | 99.17 |
| 1421 | 100.165 |
| 1422 | 98.2 |
| 1423 | 99.195 |
| 1424 | 100.19 |
| 1425 | 101.17 |
| 1426 | 99.85 |
| 1427 | 100.85 |
| 1428 | 101.83 |
| 1429 | 102.81 |
| 1430 | 103.79 |
| 1431 | 104.77 |
| 1432 | 105.75 |
| 1433 | 106.75 |
| 1434 | 104.81 |
| 1435 | 105.81 |
| 1436 | 106.79 |
| 1437 | 107.77 |
| 1438 | 106.387 |
| 1439 | 107.383 |
| 1440 | 108.38 |
| 1441 | 107.55 |
| 1442 | 106.6 |
| 1443 | 107.6 |
| 1444 | 108.58 |
| 1445 | 109.56 |
| 1446 | 110.54 |
| 1447 | 111.537 |
| 1448 | 109.813 |
| 1449 | 110.81 |
| 1450 | 111.79 |
| 1451 | 112.77 |
| 1452 | 113.75 |
| 1453 | 114.73 |
| 1454 | 113.21 |
| 1455 | 114.21 |
| 1456 | 115.19 |
| 1457 | 116.187 |
| 1458 | 114.523 |
| 1459 | 115.52 |
| 1460 | 116.517 |
| 1461 | 115.013 |
| 1462 | 116.01 |
| 1463 | 116.99 |
| 1464 | 117.97 |
| 1465 | 118.95 |
| 1466 | 119.93 |
| 1467 | 120.91 |
| 1468 | 121.89 |
| 1469 | 120.77 |
| 1470 | 121.75 |
| 1471 | 122.73 |
| 1472 | 120.43 |
| 1473 | 121.41 |
| 1474 | 122.39 |
| 1475 | 123.37 |
| 1476 | 124.35 |
| 1477 | 125.343 |
| 1478 | 124.277 |
| 1479 | 125.27 |
| 1480 | 126.25 |
| 1481 | 127.23 |
| 1482 | 126.38 |
| 1483 | 124.96 |
| 1484 | 123.82 |
| 1485 | 124.82 |
| 1486 | 122.62 |
| 1487 | 123.6 |
| 1488 | 122.06 |
| 1489 | 121.54 |
| 1490 | 119.82 |
| 1491 | 120.82 |
| 1492 | 121.8 |
| 1493 | 122.78 |
| 1494 | 123.76 |
| 1495 | 124.74 |
| 1496 | 125.72 |
| 1497 | 126.7 |
| 1498 | 125.24 |
| 1499 | 126.22 |
| 1500 | 127.2 |
| 1501 | 128.18 |
| 1502 | 129.16 |
| 1503 | 130.14 |
| 1504 | 131.12 |
| 1505 | 132.1 |
| 1506 | 133.08 |
| 1507 | 134.06 |
| 1508 | 135.04 |
| 1509 | 134.19 |
| 1510 | 135.19 |
| 1511 | 136.17 |
| 1512 | 137.15 |
| 1513 | 138.13 |
| 1514 | 139.117 |
| 1515 | 140.103 |
| 1516 | 138.38 |
| 1517 | 139.377 |
| 1518 | 140.373 |
| 1519 | 141.373 |
| 1520 | 139.323 |
| 1521 | 140.323 |
| 1522 | 141.303 |
| 1523 | 142.283 |
| 1524 | 140.183 |
| 1525 | 141.163 |
| 1526 | 142.143 |
| 1527 | 139.943 |
| 1528 | 138.683 |
| 1529 | 139.683 |
| 1530 | 140.683 |
| 1531 | 139.733 |
| 1532 | 140.713 |
| 1533 | 141.693 |
| 1534 | 142.673 |
| 1535 | 141.153 |
| 1536 | 142.153 |
| 1537 | 143.133 |
| 1538 | 144.113 |
| 1539 | 145.093 |
| 1540 | 146.073 |
| 1541 | 147.053 |
| 1542 | 148.033 |
| 1543 | 149.013 |
| 1544 | 147.933 |
| 1545 | 148.933 |
| 1546 | 146.583 |
| 1547 | 145.683 |
| 1548 | 146.683 |
| 1549 | 147.683 |
| 1550 | 148.683 |
| 1551 | 146.183 |
| 1552 | 147.183 |
| 1553 | 144.383 |
| 1554 | 143.963 |
| 1555 | 142.523 |
| 1556 | 140.623 |
| 1557 | 141.623 |
| 1558 | 142.603 |
| 1559 | 141.363 |
| 1560 | 142.363 |
| 1561 | 143.343 |
| 1562 | 144.323 |
| 1563 | 145.303 |
| 1564 | 146.303 |
| 1565 | 144.943 |
| 1566 | 145.923 |
| 1567 | 146.903 |
| 1568 | 147.883 |
| 1569 | 148.883 |
| 1570 | 147.183 |
| 1571 | 148.163 |
| 1572 | 149.143 |
| 1573 | 147.403 |
| 1574 | 148.403 |
| 1575 | 149.383 |
| 1576 | 150.363 |
| 1577 | 151.358 |
| 1578 | 149.573 |
| 1579 | 150.568 |
| 1580 | 151.563 |
| 1581 | 152.543 |
| 1582 | 153.523 |
| 1583 | 154.503 |
| 1584 | 153.743 |
| 1585 | 154.723 |
| 1586 | 155.703 |
| 1587 | 156.683 |
| 1588 | 157.663 |
| 1589 | 158.643 |
| 1590 | 159.643 |
| 1591 | 157.983 |
| 1592 | 158.963 |
| 1593 | 159.943 |
| 1594 | 160.923 |
| 1595 | 161.903 |
| 1596 | 162.883 |
| 1597 | 161.783 |
| 1598 | 162.783 |
| 1599 | 163.763 |
| 1600 | 164.743 |
| 1601 | 165.743 |
| 1602 | 164.003 |
| 1603 | 161.203 |
| 1604 | 162.183 |
| 1605 | 163.163 |
| 1606 | 164.143 |
| 1607 | 165.123 |
| 1608 | 163.523 |
| 1609 | 164.523 |
| 1610 | 162.173 |
| 1611 | 163.153 |
| 1612 | 164.133 |
| 1613 | 165.113 |
| 1614 | 166.113 |
| 1615 | 164.793 |
| 1616 | 162.343 |
| 1617 | 161.633 |
| 1618 | 162.613 |
| 1619 | 163.593 |
| 1620 | 164.573 |
| 1621 | 165.553 |
| 1622 | 166.533 |
| 1623 | 164.933 |
| 1624 | 163.053 |
| 1625 | 164.053 |
| 1626 | 163.063 |
| 1627 | 164.063 |
| 1628 | 165.043 |
| 1629 | 166.023 |
| 1630 | 167.003 |
| 1631 | 167.983 |
| 1632 | 165.733 |
| 1633 | 166.733 |
| 1634 | 167.733 |
| 1635 | 168.713 |
| 1636 | 169.693 |
| 1637 | 168.783 |
| 1638 | 169.783 |
| 1639 | 170.763 |
| 1640 | 171.743 |
| 1641 | 172.723 |
| 1642 | 171.803 |
| 1643 | 172.783 |
| 1644 | 173.763 |
| 1645 | 174.743 |
| 1646 | 175.723 |
| 1647 | 174.063 |
| 1648 | 175.063 |
| 1649 | 176.063 |
| 1650 | 177.063 |
| 1651 | 175.063 |
| 1652 | 176.043 |
| 1653 | 174.143 |
| 1654 | 172.223 |
| 1655 | 173.203 |
| 1656 | 174.183 |
| 1657 | 175.163 |
| 1658 | 176.143 |
| 1659 | 174.923 |
| 1660 | 173.403 |
| 1661 | 174.383 |
| 1662 | 175.383 |
| 1663 | 173.483 |
| 1664 | 170.533 |
| 1665 | 171.513 |
| 1666 | 170.213 |
| 1667 | 171.213 |
| 1668 | 169.373 |
| 1669 | 170.373 |
| 1670 | 171.373 |
| 1671 | 172.353 |
| 1672 | 173.333 |
| 1673 | 174.313 |
| 1674 | 175.293 |
| 1675 | 176.273 |
| 1676 | 177.253 |
| 1677 | 176.433 |
| 1678 | 177.413 |
| 1679 | 178.393 |
| 1680 | 179.386 |
| 1681 | 180.378 |
| 1682 | 181.371 |
| 1683 | 179.923 |
| 1684 | 180.903 |
| 1685 | 181.883 |
| 1686 | 182.863 |
| 1687 | 183.843 |
| 1688 | 184.823 |
| 1689 | 182.723 |
| 1690 | 183.723 |
| 1691 | 184.703 |
| 1692 | 183.563 |
| 1693 | 181.413 |
| 1694 | 182.413 |
| 1695 | 183.413 |
| 1696 | 181.433 |
| 1697 | 182.413 |
| 1698 | 180.913 |
| 1699 | 178.263 |
| 1700 | 177.003 |
| 1701 | 178.003 |
| 1702 | 178.983 |
| 1703 | 179.963 |
| 1704 | 180.943 |
| 1705 | 181.943 |
| 1706 | 179.443 |
| 1707 | 178.063 |
| 1708 | 177.253 |
| 1709 | 175.473 |
| 1710 | 176.473 |
| 1711 | 177.473 |
| 1712 | 175.913 |
| 1713 | 176.893 |
| 1714 | 177.873 |
| 1715 | 178.853 |
| 1716 | 177.353 |
| 1717 | 175.833 |
| 1718 | 176.833 |
| 1719 | 177.813 |
| 1720 | 178.793 |
| 1721 | 176.813 |
| 1722 | 177.793 |
| 1723 | 178.773 |
| 1724 | 179.753 |
| 1725 | 178.633 |
| 1726 | 176.833 |
| 1727 | 177.813 |
| 1728 | 178.793 |
| 1729 | 179.773 |
| 1730 | 180.753 |
| 1731 | 181.753 |
| 1732 | 179.453 |
| 1733 | 180.433 |
| 1734 | 178.893 |
| 1735 | 176.243 |
| 1736 | 174.843 |
| 1737 | 175.843 |
| 1738 | 176.823 |
| 1739 | 177.803 |
| 1740 | 178.783 |
| 1741 | 179.783 |
| 1742 | 176.833 |
| 1743 | 177.813 |
| 1744 | 178.793 |
| 1745 | 179.773 |
| 1746 | 180.753 |
| 1747 | 181.733 |
| 1748 | 179.433 |
| 1749 | 177.653 |
| 1750 | 178.633 |
| 1751 | 179.613 |
| 1752 | 180.603 |
| 1753 | 181.583 |
| 1754 | 182.563 |
| 1755 | 183.543 |
| 1756 | 184.523 |
| 1757 | 185.523 |
| 1758 | 184.023 |
| 1759 | 181.323 |
| 1760 | 182.303 |
| 1761 | 183.303 |
| 1762 | 180.653 |
| 1763 | 178.95 |
| 1764 | 179.947 |
| 1765 | 180.943 |
| 1766 | 181.923 |
| 1767 | 182.903 |
| 1768 | 183.883 |
| 1769 | 181.383 |
| 1770 | 182.363 |
| 1771 | 183.343 |
| 1772 | 182.463 |
| 1773 | 183.463 |
| 1774 | 184.443 |
| 1775 | 185.423 |
| 1776 | 186.403 |
| 1777 | 187.383 |
| 1778 | 188.363 |
| 1779 | 189.343 |
| 1780 | 187.623 |
| 1781 | 188.623 |
| 1782 | 186.903 |
| 1783 | 185.503 |
| 1784 | 186.483 |
| 1785 | 187.463 |
| 1786 | 188.443 |
| 1787 | 189.423 |
| 1788 | 190.423 |
| 1789 | 188.723 |
| 1790 | 186.783 |
| 1791 | 186.007 |
| 1792 | 187 |
| 1793 | 187.993 |
| 1794 | 187.308 |
| 1795 | 188.303 |
| 1796 | 186.883 |
| 1797 | 184.383 |
| 1798 | 185.363 |
| 1799 | 184.517 |
| 1800 | 185.51 |
| 1801 | 186.503 |
| 1802 | 185.251 |
| 1803 | 186.239 |
| 1804 | 187.227 |
| 1805 | 188.215 |
| 1806 | 189.203 |
| 1807 | 188.673 |
| 1808 | 188.193 |
| 1809 | 187.513 |
| 1810 | 188.493 |
| 1811 | 189.473 |
| 1812 | 190.453 |
| 1813 | 191.433 |
| 1814 | 188.533 |
| 1815 | 187.673 |
| 1816 | 188.653 |
| 1817 | 189.633 |
| 1818 | 190.613 |
| 1819 | 191.593 |
| 1820 | 190.293 |
| 1821 | 188.333 |
| 1822 | 189.333 |
| 1823 | 188.193 |
| 1824 | 189.173 |
| 1825 | 188.333 |
| 1826 | 186.373 |
| 1827 | 187.353 |
| 1828 | 188.333 |
| 1829 | 189.313 |
| 1830 | 187.533 |
| 1831 | 185.773 |
| 1832 | 186.773 |
| 1833 | 187.753 |
| 1834 | 186.873 |
| 1835 | 185.413 |
| 1836 | 186.413 |
| 1837 | 185.373 |
| 1838 | 186.353 |
| 1839 | 187.333 |
| 1840 | 188.313 |
| 1841 | 189.293 |
| 1842 | 188.133 |
| 1843 | 189.113 |
| 1844 | 187.953 |
| 1845 | 186.233 |
| 1846 | 187.233 |
| 1847 | 185.793 |
| 1848 | 184.653 |
| 1849 | 185.633 |
| 1850 | 186.613 |
| 1851 | 187.593 |
| 1852 | 186.173 |
| 1853 | 187.173 |
| 1854 | 188.153 |
| 1855 | 189.133 |
| 1856 | 190.113 |
| 1857 | 188.67 |
| 1858 | 189.667 |
| 1859 | 190.663 |
| 1860 | 191.643 |
| 1861 | 192.623 |
| 1862 | 193.603 |
| 1863 | 192.443 |
| 1864 | 193.443 |
| 1865 | 192.023 |
| 1866 | 190.583 |
| 1867 | 191.583 |
| 1868 | 191.103 |
| 1869 | 192.083 |
| 1870 | 193.063 |
| 1871 | 194.06 |
| 1872 | 192.617 |
| 1873 | 193.613 |
| 1874 | 191.613 |
| 1875 | 192.613 |
| 1876 | 193.61 |
| 1877 | 191.967 |
| 1878 | 192.963 |
| 1879 | 193.963 |
| 1880 | 192.683 |
| 1881 | 190.763 |
| 1882 | 189.003 |
| 1883 | 190.003 |
| 1884 | 190.983 |
| 1885 | 191.963 |
| 1886 | 192.963 |
| 1887 | 190.513 |
| 1888 | 191.493 |
| 1889 | 192.473 |
| 1890 | 193.47 |
| 1891 | 191.807 |
| 1892 | 192.803 |
| 1893 | 190.553 |
| 1894 | 191.533 |
| 1895 | 192.513 |
| 1896 | 193.493 |
| 1897 | 194.473 |
| 1898 | 193.273 |
| 1899 | 194.273 |
| 1900 | 195.253 |
| 1901 | 196.233 |
| 1902 | 197.213 |
| 1903 | 198.213 |
| 1904 | 196.393 |
| 1905 | 194.953 |
| 1906 | 195.953 |
| 1907 | 196.933 |
| 1908 | 194.333 |
| 1909 | 192.283 |
| 1910 | 193.283 |
| 1911 | 191.133 |
| 1912 | 192.113 |
| 1913 | 193.093 |
| 1914 | 194.073 |
| 1915 | 191.523 |
| 1916 | 192.503 |
| 1917 | 193.483 |
| 1918 | 194.463 |
| 1919 | 195.443 |
| 1920 | 196.423 |
| 1921 | 197.403 |
| 1922 | 198.383 |
| 1923 | 199.363 |
| 1924 | 200.363 |
| 1925 | 198.313 |
| 1926 | 199.313 |
| 1927 | 196.363 |
| 1928 | 193.763 |
| 1929 | 194.743 |
| 1930 | 195.723 |
| 1931 | 194.043 |
| 1932 | 192.563 |
| 1933 | 191.503 |
| 1934 | 192.503 |
| 1935 | 193.483 |
| 1936 | 194.478 |
| 1937 | 195.473 |
| 1938 | 193.318 |
| 1939 | 194.313 |
| 1940 | 192.413 |
| 1941 | 191.273 |
| 1942 | 189.433 |
| 1943 | 190.413 |
| 1944 | 191.393 |
| 1945 | 189.933 |
| 1946 | 190.933 |
| 1947 | 189.453 |
| 1948 | 190.453 |
| 1949 | 191.433 |
| 1950 | 192.433 |
| 1951 | 190.633 |
| 1952 | 191.633 |
| 1953 | 192.613 |
| 1954 | 193.593 |
| 1955 | 194.573 |
| 1956 | 193.933 |
| 1957 | 194.933 |
| 1958 | 193.073 |
| 1959 | 194.053 |
| 1960 | 195.033 |
| 1961 | 196.013 |
| 1962 | 193.263 |
| 1963 | 194.243 |
| 1964 | 192.243 |
| 1965 | 193.243 |
| 1966 | 192.183 |
| 1967 | 191.558 |
| 1968 | 192.553 |
| 1969 | 191.453 |
| 1970 | 192.453 |
| 1971 | 189.803 |
| 1972 | 190.783 |
| 1973 | 191.763 |
| 1974 | 192.743 |
| 1975 | 193.723 |
| 1976 | 194.723 |
| 1977 | 193.063 |
| 1978 | 194.043 |
| 1979 | 195.023 |
| 1980 | 196.003 |
| 1981 | 196.983 |
| 1982 | 196.163 |
| 1983 | 197.163 |
| 1984 | 196.023 |
| 1985 | 197.003 |
| 1986 | 195.183 |
| 1987 | 194.523 |
| 1988 | 195.503 |
| 1989 | 196.503 |
| 1990 | 193.953 |
| 1991 | 194.933 |
| 1992 | 195.913 |
| 1993 | 194.433 |
| 1994 | 195.433 |
| 1995 | 196.413 |
| 1996 | 197.393 |
| 1997 | 195.713 |
| 1998 | 196.713 |
| 1999 | 195.073 |
| 2000 | 196.053 |
| 2001 | 194.853 |
| 2002 | 195.833 |
| 2003 | 196.813 |
| 2004 | 197.793 |
| 2005 | 196.513 |
| 2006 | 197.493 |
| 2007 | 196.543 |
| 2008 | 197.523 |
| 2009 | 198.503 |
| 2010 | 199.503 |
| 2011 | 197.303 |
| 2012 | 198.303 |
| 2013 | 196.403 |
| 2014 | 194.723 |
| 2015 | 195.723 |
| 2016 | 193.783 |
| 2017 | 194.783 |
| 2018 | 195.763 |
| 2019 | 196.743 |
| 2020 | 197.723 |
| 2021 | 197.118 |
| 2022 | 198.113 |
| 2023 | 197.013 |
| 2024 | 198.013 |
| 2025 | 198.993 |
| 2026 | 199.973 |
| 2027 | 200.953 |
| 2028 | 201.933 |
| 2029 | 202.913 |
| 2030 | 203.893 |
| 2031 | 204.893 |
| 2032 | 202.443 |
| 2033 | 203.443 |
| 2034 | 204.423 |
| 2035 | 205.403 |
| 2036 | 204.803 |
| 2037 | 202.603 |
| 2038 | 203.583 |
| 2039 | 202.633 |
| 2040 | 199.883 |
| 2041 | 198.463 |
| 2042 | 199.443 |
| 2043 | 200.423 |
| 2044 | 201.403 |
| 2045 | 202.383 |
| 2046 | 203.363 |
| 2047 | 204.343 |
| 2048 | 205.343 |
| 2049 | 206.343 |
| 2050 | 203.943 |
| 2051 | 202.863 |
| 2052 | 203.863 |
| 2053 | 204.843 |
| 2054 | 205.823 |
| 2055 | 206.803 |
| 2056 | 207.783 |
| 2057 | 208.783 |
| 2058 | 206.233 |
| 2059 | 207.213 |
| 2060 | 208.193 |
| 2061 | 206.733 |
| 2062 | 207.733 |
| 2063 | 208.713 |
| 2064 | 209.713 |
| 2065 | 207.613 |
| 2066 | 208.613 |
| 2067 | 209.593 |
| 2068 | 210.573 |
| 2069 | 211.553 |
| 2070 | 212.533 |
| 2071 | 211.703 |
| 2072 | 212.703 |
| 2073 | 210.723 |
| 2074 | 209.723 |
| 2075 | 208.503 |
| 2076 | 209.503 |
| 2077 | 210.503 |
| 2078 | 208.403 |
| 2079 | 209.383 |
| 2080 | 210.363 |
| 2081 | 211.343 |
| 2082 | 212.34 |
| 2083 | 210.637 |
| 2084 | 211.633 |
| 2085 | 212.613 |
| 2086 | 213.593 |
| 2087 | 213.083 |
| 2088 | 214.063 |
| 2089 | 213.353 |
| 2090 | 211.853 |
| 2091 | 212.833 |
| 2092 | 213.813 |
| 2093 | 214.813 |
| 2094 | 215.813 |
| 2095 | 214.173 |
| 2096 | 212.173 |
| 2097 | 213.17 |
| 2098 | 211.427 |
| 2099 | 212.423 |
| 2100 | 211.553 |
| 2101 | 210.253 |
| 2102 | 211.253 |
| 2103 | 212.233 |
| 2104 | 213.213 |
| 2105 | 214.193 |
| 2106 | 213.207 |
| 2107 | 214.2 |
| 2108 | 215.193 |
| 2109 | 216.193 |
| 2110 | 213.993 |
| 2111 | 213.283 |
| 2112 | 214.283 |
| 2113 | 215.283 |
| 2114 | 212.733 |
| 2115 | 212.123 |
| 2116 | 213.103 |
| 2117 | 214.083 |
| 2118 | 215.063 |
| 2119 | 213.423 |
| 2120 | 214.423 |
| 2121 | 215.423 |
| 2122 | 213.503 |
| 2123 | 214.483 |
| 2124 | 215.463 |
| 2125 | 214.223 |
| 2126 | 215.223 |
| 2127 | 213.963 |
| 2128 | 214.95 |
| 2129 | 215.937 |
| 2130 | 213.387 |
| 2131 | 212.127 |
| 2132 | 213.107 |
| 2133 | 211.747 |
| 2134 | 212.727 |
| 2135 | 213.707 |
| 2136 | 211.807 |
| 2137 | 209.907 |
| 2138 | 207.947 |
| 2139 | 208.927 |
| 2140 | 207.787 |
| 2141 | 208.787 |
| 2142 | 209.767 |
| 2143 | 210.747 |
| 2144 | 211.727 |
| 2145 | 212.707 |
| 2146 | 213.687 |
| 2147 | 214.667 |
| 2148 | 215.647 |
| 2149 | 216.627 |
| 2150 | 217.607 |
| 2151 | 218.587 |
| 2152 | 219.567 |
| 2153 | 220.547 |
| 2154 | 218.867 |
| 2155 | 219.847 |
| 2156 | 220.827 |
| 2157 | 218.987 |
| 2158 | 219.987 |
| 2159 | 220.987 |
| 2160 | 218.087 |
| 2161 | 219.087 |
| 2162 | 216.837 |
| 2163 | 215.637 |
| 2164 | 216.617 |
| 2165 | 217.597 |
| 2166 | 216.517 |
| 2167 | 214.597 |
| 2168 | 215.577 |
| 2169 | 214.377 |
| 2170 | 212.857 |
| 2171 | 210.407 |
| 2172 | 211.407 |
| 2173 | 210.147 |
| 2174 | 211.147 |
| 2175 | 212.147 |
| 2176 | 209.947 |
| 2177 | 207.097 |
| 2178 | 204.447 |
| 2179 | 202.197 |
| 2180 | 200.777 |
| 2181 | 201.777 |
| 2182 | 202.757 |
| 2183 | 203.737 |
| 2184 | 204.717 |
| 2185 | 205.697 |
| 2186 | 204.017 |
| 2187 | 202.377 |
| 2188 | 203.377 |
| 2189 | 201.817 |
| 2190 | 202.797 |
| 2191 | 203.777 |
| 2192 | 204.757 |
| 2193 | 205.737 |
| 2194 | 206.737 |
| 2195 | 204.877 |
| 2196 | 205.877 |
| 2197 | 205.182 |
| 2198 | 206.177 |
| 2199 | 207.157 |
| 2200 | 208.137 |
| 2201 | 209.117 |
| 2202 | 210.097 |
| 2203 | 211.089 |
| 2204 | 209.422 |
| 2205 | 210.414 |
| 2206 | 211.407 |
| 2207 | 212.387 |
| 2208 | 213.367 |
| 2209 | 214.347 |
| 2210 | 215.327 |
| 2211 | 216.327 |
| 2212 | 214.407 |
| 2213 | 215.387 |
| 2214 | 216.367 |
| 2215 | 214.267 |
| 2216 | 215.267 |
| 2217 | 216.267 |
| 2218 | 214.067 |
| 2219 | 212.187 |
| 2220 | 210.427 |
| 2221 | 211.427 |
| 2222 | 212.427 |
| 2223 | 213.427 |
| 2224 | 211.707 |
| 2225 | 209.057 |
| 2226 | 208.642 |
| 2227 | 209.637 |
| 2228 | 210.617 |
| 2229 | 210.197 |
| 2230 | 211.197 |
| 2231 | 209.147 |
| 2232 | 210.127 |
| 2233 | 211.107 |
| 2234 | 212.087 |
| 2235 | 213.079 |
| 2236 | 211.792 |
| 2237 | 212.784 |
| 2238 | 213.777 |
| 2239 | 214.757 |
| 2240 | 215.737 |
| 2241 | 216.717 |
| 2242 | 217.697 |
| 2243 | 216.397 |
| 2244 | 217.397 |
| 2245 | 218.377 |
| 2246 | 219.357 |
| 2247 | 220.337 |
| 2248 | 221.317 |
| 2249 | 222.297 |
| 2250 | 220.737 |
| 2251 | 221.717 |
| 2252 | 222.697 |
| 2253 | 223.677 |
| 2254 | 221.577 |
| 2255 | 219.677 |
| 2256 | 220.677 |
| 2257 | 221.657 |
| 2258 | 222.637 |
| 2259 | 220.797 |
| 2260 | 221.777 |
| 2261 | 222.757 |
| 2262 | 223.737 |
| 2263 | 224.717 |
| 2264 | 225.697 |
| 2265 | 226.677 |
| 2266 | 227.657 |
| 2267 | 228.657 |
| 2268 | 227.727 |
| 2269 | 228.707 |
| 2270 | 229.687 |
| 2271 | 230.667 |
| 2272 | 229.877 |
| 2273 | 230.857 |
| 2274 | 231.857 |
| 2275 | 229.257 |
| 2276 | 230.237 |
| 2277 | 231.237 |
| 2278 | 228.637 |
| 2279 | 227.477 |
| 2280 | 228.477 |
| 2281 | 229.457 |
| 2282 | 230.457 |
| 2283 | 227.707 |
| 2284 | 226.323 |
| 2285 | 227.32 |
| 2286 | 228.317 |
| 2287 | 229.297 |
| 2288 | 230.277 |
| 2289 | 231.277 |
| 2290 | 228.877 |
| 2291 | 229.867 |
| 2292 | 230.847 |
| 2293 | 231.827 |
| 2294 | 230.407 |
| 2295 | 228.057 |
| 2296 | 229.037 |
| 2297 | 227.477 |
| 2298 | 228.457 |
| 2299 | 229.437 |
| 2300 | 226.587 |
| 2301 | 227.567 |
| 2302 | 228.547 |
| 2303 | 229.527 |
| 2304 | 230.527 |
| 2305 | 227.827 |
| 2306 | 225.577 |
| 2307 | 226.557 |
| 2308 | 227.537 |
| 2309 | 228.517 |
| 2310 | 229.497 |
| 2311 | 227.677 |
| 2312 | 225.627 |
| 2313 | 226.627 |
| 2314 | 227.607 |
| 2315 | 226.407 |
| 2316 | 225.027 |
| 2317 | 223.547 |
| 2318 | 224.547 |
| 2319 | 221.747 |
| 2320 | 222.727 |
| 2321 | 223.707 |
| 2322 | 224.687 |
| 2323 | 225.667 |
| 2324 | 226.647 |
| 2325 | 227.642 |
| 2326 | 228.637 |
| 2327 | 226.482 |
| 2328 | 227.477 |
| 2329 | 228.457 |
| 2330 | 227.277 |
| 2331 | 228.257 |
| 2332 | 229.237 |
| 2333 | 227.897 |
| 2334 | 228.877 |
| 2335 | 229.857 |
| 2336 | 230.837 |
| 2337 | 231.817 |
| 2338 | 229.067 |
| 2339 | 230.067 |
| 2340 | 231.047 |
| 2341 | 230.462 |
| 2342 | 231.457 |
| 2343 | 232.437 |
| 2344 | 233.417 |
| 2345 | 234.397 |
| 2346 | 235.377 |
| 2347 | 233.457 |
| 2348 | 234.437 |
| 2349 | 235.433 |
| 2350 | 233.83 |
| 2351 | 234.827 |
| 2352 | 235.807 |
| 2353 | 236.787 |
| 2354 | 237.767 |
| 2355 | 238.747 |
| 2356 | 239.727 |
| 2357 | 237.527 |
| 2358 | 236.487 |
| 2359 | 237.467 |
| 2360 | 238.447 |
| 2361 | 239.447 |
| 2362 | 240.447 |
| 2363 | 237.597 |
| 2364 | 234.997 |
| 2365 | 235.997 |
| 2366 | 236.977 |
| 2367 | 234.427 |
| 2368 | 235.427 |
| 2369 | 234.822 |
| 2370 | 235.817 |
| 2371 | 236.797 |
| 2372 | 235.577 |
| 2373 | 234.153 |
| 2374 | 235.15 |
| 2375 | 236.147 |
| 2376 | 237.127 |
| 2377 | 238.107 |
| 2378 | 239.087 |
| 2379 | 240.067 |
| 2380 | 241.047 |
| 2381 | 238.697 |
| 2382 | 236.757 |
| 2383 | 237.757 |
| 2384 | 238.757 |
| 2385 | 236.817 |
| 2386 | 237.817 |
| 2387 | 235.217 |
| 2388 | 234.257 |
| 2389 | 233.517 |
| 2390 | 234.497 |
| 2391 | 233.277 |
| 2392 | 231.817 |
| 2393 | 232.817 |
| 2394 | 233.817 |
| 2395 | 233.287 |
| 2396 | 234.267 |
| 2397 | 232.647 |
| 2398 | 233.647 |
| 2399 | 231.247 |
| 2400 | 230.147 |
| 2401 | 231.147 |
| 2402 | 229.827 |
| 2403 | 230.807 |
| 2404 | 231.787 |
| 2405 | 230.227 |
| 2406 | 227.727 |
| 2407 | 226.247 |
| 2408 | 227.247 |
| 2409 | 224.347 |
| 2410 | 225.347 |
| 2411 | 226.347 |
| 2412 | 223.647 |
| 2413 | 221.807 |
| 2414 | 222.807 |
| 2415 | 223.787 |
| 2416 | 222.127 |
| 2417 | 223.107 |
| 2418 | 224.087 |
| 2419 | 223.387 |
| 2420 | 221.907 |
| 2421 | 222.887 |
| 2422 | 223.883 |
| 2423 | 222.26 |
| 2424 | 223.257 |
| 2425 | 224.237 |
| 2426 | 225.233 |
| 2427 | 223.49 |
| 2428 | 224.487 |
| 2429 | 221.987 |
| 2430 | 222.987 |
| 2431 | 222.497 |
| 2432 | 223.477 |
| 2433 | 224.457 |
| 2434 | 225.437 |
| 2435 | 226.417 |
| 2436 | 227.397 |
| 2437 | 224.947 |
| 2438 | 225.927 |
| 2439 | 226.907 |
| 2440 | 227.887 |
| 2441 | 228.887 |
| 2442 | 226.287 |
| 2443 | 227.267 |
| 2444 | 228.247 |
| 2445 | 229.227 |
| 2446 | 230.207 |
| 2447 | 231.187 |
| 2448 | 232.167 |
| 2449 | 233.163 |
| 2450 | 231.42 |
| 2451 | 232.417 |
| 2452 | 233.417 |
| 2453 | 231.217 |
| 2454 | 232.197 |
| 2455 | 230.837 |
| 2456 | 229.69 |
| 2457 | 230.683 |
| 2458 | 231.677 |
| 2459 | 232.657 |
| 2460 | 233.637 |
| 2461 | 231.337 |
| 2462 | 228.887 |
| 2463 | 229.867 |
| 2464 | 230.847 |
| 2465 | 229.787 |
| 2466 | 230.787 |
| 2467 | 231.767 |
| 2468 | 232.747 |
| 2469 | 233.727 |
| 2470 | 234.707 |
| 2471 | 235.704 |
| 2472 | 236.702 |
| 2473 | 233.949 |
| 2474 | 234.947 |
| 2475 | 235.927 |
| 2476 | 236.907 |
| 2477 | 237.887 |
| 2478 | 238.867 |
| 2479 | 239.847 |
| 2480 | 238.587 |
| 2481 | 237.387 |
| 2482 | 238.387 |
| 2483 | 237.027 |
| 2484 | 238.007 |
| 2485 | 238.987 |
| 2486 | 239.967 |
| 2487 | 240.947 |
| 2488 | 241.939 |
| 2489 | 240.392 |
| 2490 | 241.384 |
| 2491 | 242.377 |
| 2492 | 243.377 |
| 2493 | 241.127 |
| 2494 | 239.907 |
| 2495 | 240.887 |
| 2496 | 241.867 |
| 2497 | 242.847 |
| 2498 | 243.827 |
| 2499 | 244.807 |
| 2500 | 245.787 |
| 2501 | 246.767 |
| 2502 | 247.747 |
| 2503 | 245.597 |
| 2504 | 246.597 |
| 2505 | 245.477 |
| 2506 | 244.637 |
| 2507 | 245.637 |
| 2508 | 244.297 |
| 2509 | 243.317 |
| 2510 | 244.317 |
| 2511 | 245.313 |
| 2512 | 243.79 |
| 2513 | 244.787 |
| 2514 | 243.527 |
| 2515 | 241.747 |
| 2516 | 239.297 |
| 2517 | 236.697 |
| 2518 | 234.147 |
| 2519 | 235.127 |
| 2520 | 236.107 |
| 2521 | 237.087 |
| 2522 | 238.087 |
| 2523 | 235.887 |
| 2524 | 236.887 |
| 2525 | 237.867 |
| 2526 | 238.863 |
| 2527 | 237.58 |
| 2528 | 238.577 |
| 2529 | 237.177 |
| 2530 | 236.117 |
| 2531 | 237.117 |
| 2532 | 238.097 |
| 2533 | 239.077 |
| 2534 | 238.257 |
| 2535 | 239.257 |
| 2536 | 237.007 |
| 2537 | 235.187 |
| 2538 | 232.737 |
| 2539 | 231.677 |
| 2540 | 231.102 |
| 2541 | 232.097 |
| 2542 | 229.847 |
| 2543 | 230.827 |
| 2544 | 231.807 |
| 2545 | 229.357 |
| 2546 | 230.337 |
| 2547 | 228.857 |
| 2548 | 227.057 |
| 2549 | 228.037 |
| 2550 | 229.017 |
| 2551 | 227.677 |
| 2552 | 226.157 |
| 2553 | 227.157 |
| 2554 | 228.157 |
| 2555 | 226.107 |
| 2556 | 227.107 |
| 2557 | 225.007 |
| 2558 | 226.007 |
| 2559 | 224.147 |
| 2560 | 225.147 |
| 2561 | 224.307 |
| 2562 | 225.307 |
| 2563 | 226.287 |
| 2564 | 227.267 |
| 2565 | 228.247 |
| 2566 | 226.467 |
| 2567 | 227.447 |
| 2568 | 228.427 |
| 2569 | 229.407 |
| 2570 | 227.157 |
| 2571 | 224.907 |
| 2572 | 225.907 |
| 2573 | 226.887 |
| 2574 | 227.867 |
| 2575 | 228.847 |
| 2576 | 229.827 |
| 2577 | 229.007 |
| 2578 | 227.067 |
| 2579 | 228.067 |
| 2580 | 229.067 |
| 2581 | 226.217 |
| 2582 | 227.197 |
| 2583 | 228.177 |
| 2584 | 229.157 |
| 2585 | 230.137 |
| 2586 | 231.137 |
| 2587 | 228.737 |
| 2588 | 226.037 |
| 2589 | 224.897 |
| 2590 | 222.997 |
| 2591 | 223.977 |
| 2592 | 224.957 |
| 2593 | 225.937 |
| 2594 | 226.917 |
| 2595 | 227.897 |
| 2596 | 228.877 |
| 2597 | 229.877 |
| 2598 | 227.627 |
| 2599 | 228.607 |
| 2600 | 229.607 |
| 2601 | 227.107 |
| 2602 | 228.107 |
| 2603 | 229.107 |
| 2604 | 226.807 |
| 2605 | 227.787 |
| 2606 | 228.787 |
| 2607 | 225.987 |
| 2608 | 224.047 |
| 2609 | 225.047 |
| 2610 | 223.727 |
| 2611 | 224.707 |
| 2612 | 225.687 |
| 2613 | 226.667 |
| 2614 | 225.327 |
| 2615 | 223.987 |
| 2616 | 224.987 |
| 2617 | 225.967 |
| 2618 | 226.947 |
| 2619 | 227.927 |
| 2620 | 228.907 |
| 2621 | 229.887 |
| 2622 | 228.207 |
| 2623 | 229.207 |
| 2624 | 230.187 |
| 2625 | 228.667 |
| 2626 | 229.667 |
| 2627 | 230.647 |
| 2628 | 231.627 |
| 2629 | 232.607 |
| 2630 | 233.587 |
| 2631 | 231.037 |
| 2632 | 232.037 |
| 2633 | 233.017 |
| 2634 | 233.997 |
| 2635 | 232.477 |
| 2636 | 233.477 |
| 2637 | 232.197 |
| 2638 | 233.177 |
| 2639 | 232.627 |
| 2640 | 231.307 |
| 2641 | 228.507 |
| 2642 | 229.507 |
| 2643 | 226.757 |
| 2644 | 225.517 |
| 2645 | 226.497 |
| 2646 | 227.477 |
| 2647 | 228.457 |
| 2648 | 227.51 |
| 2649 | 228.503 |
| 2650 | 229.497 |
| 2651 | 227.837 |
| 2652 | 225.137 |
| 2653 | 226.117 |
| 2654 | 227.097 |
| 2655 | 228.077 |
| 2656 | 229.057 |
| 2657 | 230.037 |
| 2658 | 231.017 |
| 2659 | 232.017 |
| 2660 | 230.037 |
| 2661 | 231.037 |
| 2662 | 232.017 |
| 2663 | 230.977 |
| 2664 | 231.957 |
| 2665 | 232.937 |
| 2666 | 233.917 |
| 2667 | 234.897 |
| 2668 | 235.877 |
| 2669 | 236.877 |
| 2670 | 237.877 |
| 2671 | 235.327 |
| 2672 | 236.307 |
| 2673 | 235.397 |
| 2674 | 236.397 |
| 2675 | 237.397 |
| 2676 | 234.497 |
| 2677 | 232.557 |
| 2678 | 230.957 |
| 2679 | 231.957 |
| 2680 | 232.937 |
| 2681 | 233.917 |
| 2682 | 234.897 |
| 2683 | 235.877 |
| 2684 | 236.857 |
| 2685 | 237.837 |
| 2686 | 236.037 |
| 2687 | 237.017 |
| 2688 | 238.017 |
| 2689 | 235.167 |
| 2690 | 236.147 |
| 2691 | 237.127 |
| 2692 | 236.712 |
| 2693 | 237.707 |
| 2694 | 238.687 |
| 2695 | 236.637 |
| 2696 | 234.997 |
| 2697 | 233.217 |
| 2698 | 234.217 |
| 2699 | 231.817 |
| 2700 | 232.797 |
| 2701 | 233.777 |
| 2702 | 234.757 |
| 2703 | 235.737 |
| 2704 | 234.317 |
| 2705 | 232.217 |
| 2706 | 233.217 |
| 2707 | 234.197 |
| 2708 | 235.177 |
| 2709 | 236.157 |
| 2710 | 234.457 |
| 2711 | 235.457 |
| 2712 | 236.437 |
| 2713 | 234.597 |
| 2714 | 235.597 |
| 2715 | 233.597 |
| 2716 | 234.597 |
| 2717 | 235.577 |
| 2718 | 236.557 |
| 2719 | 235.217 |
| 2720 | 236.217 |
| 2721 | 237.217 |
| 2722 | 234.717 |
| 2723 | 232.917 |
| 2724 | 233.917 |
| 2725 | 234.917 |
| 2726 | 235.897 |
| 2727 | 236.877 |
| 2728 | 237.857 |
| 2729 | 238.837 |
| 2730 | 239.817 |
| 2731 | 240.797 |
| 2732 | 239.717 |
| 2733 | 240.697 |
| 2734 | 239.497 |
| 2735 | 240.477 |
| 2736 | 241.457 |
| 2737 | 240.377 |
| 2738 | 238.077 |
| 2739 | 239.077 |
| 2740 | 240.057 |
| 2741 | 241.037 |
| 2742 | 242.017 |
| 2743 | 240.217 |
| 2744 | 241.197 |
| 2745 | 242.177 |
| 2746 | 239.977 |
| 2747 | 240.957 |
| 2748 | 241.937 |
| 2749 | 242.917 |
| 2750 | 243.897 |
| 2751 | 242.85 |
| 2752 | 243.843 |
| 2753 | 244.837 |
| 2754 | 245.817 |
| 2755 | 246.797 |
| 2756 | 247.777 |
| 2757 | 246.677 |
| 2758 | 247.677 |
| 2759 | 248.677 |
| 2760 | 247.257 |
| 2761 | 244.707 |
| 2762 | 245.707 |
| 2763 | 246.707 |
| 2764 | 244.357 |
| 2765 | 245.337 |
| 2766 | 246.317 |
| 2767 | 247.297 |
| 2768 | 248.277 |
| 2769 | 249.257 |
| 2770 | 250.237 |
| 2771 | 251.217 |
| 2772 | 252.217 |
| 2773 | 250.217 |
| 2774 | 251.217 |
| 2775 | 249.837 |
| 2776 | 247.787 |
| 2777 | 248.767 |
| 2778 | 249.747 |
| 2779 | 247.887 |
| 2780 | 248.887 |
| 2781 | 249.867 |
| 2782 | 247.767 |
| 2783 | 248.767 |
| 2784 | 246.567 |
| 2785 | 247.567 |
| 2786 | 245.867 |
| 2787 | 246.847 |
| 2788 | 247.827 |
| 2789 | 248.807 |
| 2790 | 249.807 |
| 2791 | 248.747 |
| 2792 | 249.727 |
| 2793 | 250.707 |
| 2794 | 251.687 |
| 2795 | 250.647 |
| 2796 | 251.647 |
| 2797 | 252.627 |
| 2798 | 253.607 |
| 2799 | 254.587 |
| 2800 | 255.567 |
| 2801 | 256.547 |
| 2802 | 257.527 |
| 2803 | 255.807 |
| 2804 | 256.807 |
| 2805 | 257.787 |
| 2806 | 258.767 |
| 2807 | 257.767 |
| 2808 | 256.967 |
| 2809 | 254.667 |
| 2810 | 255.667 |
| 2811 | 254.387 |
| 2812 | 255.367 |
| 2813 | 256.347 |
| 2814 | 257.327 |
| 2815 | 258.319 |
| 2816 | 256.612 |
| 2817 | 257.604 |
| 2818 | 258.597 |
| 2819 | 259.577 |
| 2820 | 257.817 |
| 2821 | 258.817 |
| 2822 | 259.817 |
| 2823 | 257.897 |
| 2824 | 254.947 |
| 2825 | 255.927 |
| 2826 | 256.907 |
| 2827 | 257.887 |
| 2828 | 256.143 |
| 2829 | 257.14 |
| 2830 | 258.137 |
| 2831 | 259.117 |
| 2832 | 260.097 |
| 2833 | 259.017 |
| 2834 | 257.697 |
| 2835 | 258.697 |
| 2836 | 256.957 |
| 2837 | 257.957 |
| 2838 | 258.937 |
| 2839 | 257.297 |
| 2840 | 258.297 |
| 2841 | 257.077 |
| 2842 | 255.797 |
| 2843 | 253.897 |
| 2844 | 254.897 |
| 2845 | 255.897 |
| 2846 | 252.947 |
| 2847 | 253.927 |
| 2848 | 254.907 |
| 2849 | 255.887 |
| 2850 | 256.887 |
| 2851 | 255.287 |
| 2852 | 256.267 |
| 2853 | 257.247 |
| 2854 | 258.227 |
| 2855 | 259.207 |
| 2856 | 260.187 |
| 2857 | 261.167 |
| 2858 | 262.147 |
| 2859 | 263.147 |
| 2860 | 260.897 |
| 2861 | 261.891 |
| 2862 | 262.885 |
| 2863 | 263.879 |
| 2864 | 264.873 |
| 2865 | 262.267 |
| 2866 | 263.247 |
| 2867 | 264.227 |
| 2868 | 265.207 |
| 2869 | 263.847 |
| 2870 | 264.847 |
| 2871 | 265.827 |
| 2872 | 266.807 |
| 2873 | 267.787 |
| 2874 | 268.767 |
| 2875 | 269.747 |
| 2876 | 267.297 |
| 2877 | 268.277 |
| 2878 | 269.257 |
| 2879 | 270.237 |
| 2880 | 269.377 |
| 2881 | 270.357 |
| 2882 | 271.337 |
| 2883 | 272.317 |
| 2884 | 271.357 |
| 2885 | 272.357 |
| 2886 | 273.337 |
| 2887 | 274.317 |
| 2888 | 275.297 |
| 2889 | 276.297 |
| 2890 | 277.297 |
| 2891 | 274.747 |
| 2892 | 273.267 |
| 2893 | 274.247 |
| 2894 | 275.227 |
| 2895 | 276.207 |
| 2896 | 277.187 |
| 2897 | 278.167 |
| 2898 | 276.487 |
| 2899 | 277.467 |
| 2900 | 276.187 |
| 2901 | 277.187 |
| 2902 | 274.787 |
| 2903 | 275.787 |
| 2904 | 276.767 |
| 2905 | 276.087 |
| 2906 | 277.067 |
| 2907 | 278.047 |
| 2908 | 279.027 |
| 2909 | 280.007 |
| 2910 | 281.007 |
| 2911 | 279.587 |
| 2912 | 277.887 |
| 2913 | 278.887 |
| 2914 | 276.287 |
| 2915 | 275.287 |
| 2916 | 276.287 |
| 2917 | 275.1 |
| 2918 | 276.093 |
| 2919 | 277.087 |
| 2920 | 278.067 |
| 2921 | 279.047 |
| 2922 | 280.027 |
| 2923 | 279.517 |
| 2924 | 280.517 |
| 2925 | 277.817 |
| 2926 | 278.814 |
| 2927 | 279.812 |
| 2928 | 280.809 |
| 2929 | 278.407 |
| 2930 | 276.307 |
| 2931 | 277.297 |
| 2932 | 278.277 |
| 2933 | 279.257 |
| 2934 | 278.267 |
| 2935 | 279.267 |
| 2936 | 280.247 |
| 2937 | 281.227 |
| 2938 | 282.207 |
| 2939 | 283.187 |
| 2940 | 284.167 |
| 2941 | 285.147 |
| 2942 | 286.147 |
| 2943 | 284.867 |
| 2944 | 282.617 |
| 2945 | 280.937 |
| 2946 | 281.917 |
| 2947 | 282.897 |
| 2948 | 283.877 |
| 2949 | 282.197 |
| 2950 | 283.177 |
| 2951 | 281.617 |
| 2952 | 282.617 |
| 2953 | 283.617 |
| 2954 | 281.467 |
| 2955 | 282.447 |
| 2956 | 281.42 |
| 2957 | 282.413 |
| 2958 | 283.407 |
| 2959 | 284.387 |
| 2960 | 281.637 |
| 2961 | 282.617 |
| 2962 | 283.597 |
| 2963 | 284.597 |
| 2964 | 282.547 |
| 2965 | 280.707 |
| 2966 | 281.687 |
| 2967 | 282.687 |
| 2968 | 281.427 |
| 2969 | 280.167 |
| 2970 | 281.167 |
| 2971 | 278.917 |
| 2972 | 279.897 |
| 2973 | 280.877 |
| 2974 | 281.857 |
| 2975 | 282.837 |
| 2976 | 281.097 |
| 2977 | 279.337 |
| 2978 | 276.937 |
| 2979 | 277.917 |
| 2980 | 278.897 |
| 2981 | 277.597 |
| 2982 | 278.577 |
| 2983 | 279.557 |
| 2984 | 280.557 |
| 2985 | 277.707 |
| 2986 | 278.687 |
| 2987 | 279.667 |
| 2988 | 280.667 |
| 2989 | 277.717 |
| 2990 | 276.537 |
| 2991 | 274.597 |
| 2992 | 275.597 |
| 2993 | 276.597 |
| 2994 | 274.837 |
| 2995 | 273.117 |
| 2996 | 271.737 |
| 2997 | 269.337 |
| 2998 | 270.337 |
| 2999 | 268.037 |
| 3000 | 269.017 |
| 3001 | 269.997 |
| 3002 | 270.977 |
| 3003 | 271.957 |
| 3004 | 270.697 |
| 3005 | 268.547 |
| 3006 | 269.527 |
| 3007 | 270.507 |
| 3008 | 271.487 |
| 3009 | 272.467 |
| 3010 | 270.467 |
| 3011 | 268.747 |
| 3012 | 269.747 |
| 3013 | 267.747 |
| 3014 | 265.927 |
| 3015 | 266.907 |
| 3016 | 267.887 |
| 3017 | 268.867 |
| 3018 | 269.847 |
| 3019 | 270.847 |
| 3020 | 268.927 |
| 3021 | 267.507 |
| 3022 | 265.157 |
| 3023 | 266.157 |
| 3024 | 263.707 |
| 3025 | 261.507 |
| 3026 | 262.487 |
| 3027 | 263.467 |
| 3028 | 264.447 |
| 3029 | 265.427 |
| 3030 | 264.667 |
| 3031 | 262.017 |
| 3032 | 262.997 |
| 3033 | 263.997 |
| 3034 | 262.157 |
| 3035 | 259.207 |
| 3036 | 256.357 |
| 3037 | 257.337 |
| 3038 | 258.337 |
| 3039 | 256.497 |
| 3040 | 257.477 |
| 3041 | 258.457 |
| 3042 | 259.437 |
| 3043 | 260.417 |
| 3044 | 261.417 |
| 3045 | 259.677 |
| 3046 | 260.657 |
| 3047 | 261.637 |
| 3048 | 262.637 |
| 3049 | 260.337 |
| 3050 | 258.377 |
| 3051 | 259.377 |
| 3052 | 257.857 |
| 3053 | 258.837 |
| 3054 | 259.817 |
| 3055 | 260.817 |
| 3056 | 258.417 |
| 3057 | 255.667 |
| 3058 | 256.647 |
| 3059 | 257.647 |
| 3060 | 255.687 |
| 3061 | 256.667 |
| 3062 | 257.647 |
| 3063 | 258.627 |
| 3064 | 259.607 |
| 3065 | 260.587 |
| 3066 | 261.567 |
| 3067 | 262.547 |
| 3068 | 261.267 |
| 3069 | 262.267 |
| 3070 | 260.907 |
| 3071 | 261.887 |
| 3072 | 262.867 |
| 3073 | 263.847 |
| 3074 | 264.827 |
| 3075 | 265.807 |
| 3076 | 266.787 |
| 3077 | 267.767 |
| 3078 | 268.747 |
| 3079 | 269.727 |
| 3080 | 270.707 |
| 3081 | 271.687 |
| 3082 | 270.167 |
| 3083 | 271.167 |
| 3084 | 272.147 |
| 3085 | 270.097 |
| 3086 | 271.077 |
| 3087 | 272.057 |
| 3088 | 273.037 |
| 3089 | 274.017 |
| 3090 | 274.997 |
| 3091 | 275.977 |
| 3092 | 276.957 |
| 3093 | 277.957 |
| 3094 | 275.157 |
| 3095 | 276.137 |
| 3096 | 277.137 |
| 3097 | 278.137 |
| 3098 | 275.737 |
| 3099 | 276.717 |
| 3100 | 274.067 |
| 3101 | 275.067 |
| 3102 | 272.767 |
| 3103 | 273.747 |
| 3104 | 273.117 |
| 3105 | 272.357 |
| 3106 | 273.357 |
| 3107 | 274.357 |
| 3108 | 275.357 |
| 3109 | 272.507 |
| 3110 | 273.487 |
| 3111 | 270.537 |
| 3112 | 271.517 |
| 3113 | 272.497 |
| 3114 | 273.477 |
| 3115 | 271.327 |
| 3116 | 268.827 |
| 3117 | 269.827 |
| 3118 | 270.807 |
| 3119 | 269.957 |
| 3120 | 270.957 |
| 3121 | 271.937 |
| 3122 | 272.917 |
| 3123 | 271.037 |
| 3124 | 272.037 |
| 3125 | 273.017 |
| 3126 | 274.01 |
| 3127 | 272.983 |
| 3128 | 273.977 |
| 3129 | 274.957 |
| 3130 | 275.937 |
| 3131 | 273.437 |
| 3132 | 274.437 |
| 3133 | 275.437 |
| 3134 | 272.637 |
| 3135 | 271.057 |
| 3136 | 272.037 |
| 3137 | 271.117 |
| 3138 | 272.117 |
| 3139 | 273.097 |
| 3140 | 274.077 |
| 3141 | 275.057 |
| 3142 | 276.037 |
| 3143 | 277.037 |
| 3144 | 278.037 |
| 3145 | 275.637 |
| 3146 | 276.617 |
| 3147 | 277.597 |
| 3148 | 278.577 |
| 3149 | 279.557 |
| 3150 | 280.557 |
| 3151 | 278.257 |
| 3152 | 279.237 |
| 3153 | 278.057 |
| 3154 | 279.052 |
| 3155 | 276.997 |
| 3156 | 277.992 |
| 3157 | 278.987 |
| 3158 | 279.967 |
| 3159 | 280.947 |
| 3160 | 281.947 |
| 3161 | 280.507 |
| 3162 | 281.503 |
| 3163 | 280.12 |
| 3164 | 281.117 |
| 3165 | 278.767 |
| 3166 | 279.767 |
| 3167 | 280.767 |
| 3168 | 281.747 |
| 3169 | 280.107 |
| 3170 | 281.107 |
| 3171 | 279.107 |
| 3172 | 280.107 |
| 3173 | 278.567 |
| 3174 | 276.587 |
| 3175 | 277.587 |
| 3176 | 278.567 |
| 3177 | 279.547 |
| 3178 | 280.527 |
| 3179 | 279.877 |
| 3180 | 280.877 |
| 3181 | 278.077 |
| 3182 | 279.077 |
| 3183 | 276.527 |
| 3184 | 277.527 |
| 3185 | 275.847 |
| 3186 | 276.827 |
| 3187 | 277.807 |
| 3188 | 278.787 |
| 3189 | 279.767 |
| 3190 | 280.747 |
| 3191 | 278.447 |
| 3192 | 279.447 |
| 3193 | 280.447 |
| 3194 | 279.307 |
| 3195 | 277.667 |
| 3196 | 278.647 |
| 3197 | 279.627 |
| 3198 | 280.607 |
| 3199 | 281.587 |
| 3200 | 279.967 |
| 3201 | 277.667 |
| 3202 | 275.017 |
| 3203 | 276.017 |
| 3204 | 276.997 |
| 3205 | 277.977 |
| 3206 | 278.957 |
| 3207 | 279.937 |
| 3208 | 280.917 |
| 3209 | 279.927 |
| 3210 | 279.087 |
| 3211 | 280.087 |
| 3212 | 281.067 |
| 3213 | 282.047 |
| 3214 | 283.027 |
| 3215 | 284.007 |
| 3216 | 284.987 |
| 3217 | 283.367 |
| 3218 | 281.387 |
| 3219 | 282.387 |
| 3220 | 280.137 |
| 3221 | 279.477 |
| 3222 | 280.457 |
| 3223 | 281.437 |
| 3224 | 282.417 |
| 3225 | 283.397 |
| 3226 | 280.747 |
| 3227 | 281.727 |
| 3228 | 282.707 |
| 3229 | 283.687 |
| 3230 | 284.687 |
| 3231 | 282.387 |
| 3232 | 283.367 |
| 3233 | 284.347 |
| 3234 | 285.327 |
| 3235 | 286.327 |
| 3236 | 284.327 |
| 3237 | 285.327 |
| 3238 | 283.327 |
| 3239 | 284.307 |
| 3240 | 282.727 |
| 3241 | 281.947 |
| 3242 | 281.277 |
| 3243 | 282.257 |
| 3244 | 280.693 |
| 3245 | 281.69 |
| 3246 | 282.687 |
| 3247 | 283.667 |
| 3248 | 284.647 |
| 3249 | 285.627 |
| 3250 | 284.637 |
| 3251 | 282.997 |
| 3252 | 280.597 |
| 3253 | 281.577 |
| 3254 | 282.557 |
| 3255 | 283.537 |
| 3256 | 282.63 |
| 3257 | 283.623 |
| 3258 | 284.617 |
| 3259 | 285.597 |
| 3260 | 284.117 |
| 3261 | 282.457 |
| 3262 | 283.457 |
| 3263 | 281.007 |
| 3264 | 282.007 |
| 3265 | 279.657 |
| 3266 | 278.417 |
| 3267 | 279.417 |
| 3268 | 277.217 |
| 3269 | 278.197 |
| 3270 | 279.177 |
| 3271 | 280.177 |
| 3272 | 277.527 |
| 3273 | 275.787 |
| 3274 | 276.767 |
| 3275 | 275.047 |
| 3276 | 276.047 |
| 3277 | 274.487 |
| 3278 | 275.487 |
| 3279 | 273.967 |
| 3280 | 272.327 |
| 3281 | 273.327 |
| 3282 | 274.327 |
| 3283 | 271.677 |
| 3284 | 271.232 |
| 3285 | 272.227 |
| 3286 | 273.207 |
| 3287 | 274.187 |
| 3288 | 272.207 |
| 3289 | 273.207 |
| 3290 | 272.267 |
| 3291 | 270.347 |
| 3292 | 269.267 |
| 3293 | 270.267 |
| 3294 | 271.267 |
| 3295 | 272.267 |
| 3296 | 269.317 |
| 3297 | 270.297 |
| 3298 | 271.277 |
| 3299 | 272.257 |
| 3300 | 273.237 |
| 3301 | 274.217 |
| 3302 | 275.197 |
| 3303 | 276.177 |
| 3304 | 277.157 |
| 3305 | 278.137 |
| 3306 | 279.117 |
| 3307 | 280.097 |
| 3308 | 281.077 |
| 3309 | 282.057 |
| 3310 | 283.037 |
| 3311 | 284.017 |
| 3312 | 285.017 |
| 3313 | 286.017 |
| 3314 | 283.717 |
| 3315 | 284.697 |
| 3316 | 283.637 |
| 3317 | 284.617 |
| 3318 | 285.617 |
| 3319 | 284.037 |
| 3320 | 285.037 |
| 3321 | 286.037 |
| 3322 | 283.937 |
| 3323 | 284.937 |
| 3324 | 282.387 |
| 3325 | 283.387 |
| 3326 | 284.387 |
| 3327 | 281.987 |
| 3328 | 279.987 |
| 3329 | 280.967 |
| 3330 | 281.947 |
| 3331 | 282.927 |
| 3332 | 281.807 |
| 3333 | 280.167 |
| 3334 | 279.147 |
| 3335 | 280.147 |
| 3336 | 281.143 |
| 3337 | 279.56 |
| 3338 | 280.557 |
| 3339 | 278.877 |
| 3340 | 279.857 |
| 3341 | 277.507 |
| 3342 | 276.827 |
| 3343 | 277.823 |
| 3344 | 276.28 |
| 3345 | 277.277 |
| 3346 | 278.257 |
| 3347 | 279.237 |
| 3348 | 277.817 |
| 3349 | 278.817 |
| 3350 | 279.797 |
| 3351 | 280.777 |
| 3352 | 281.757 |
| 3353 | 282.737 |
| 3354 | 283.717 |
| 3355 | 284.697 |
| 3356 | 285.677 |
| 3357 | 283.697 |
| 3358 | 284.697 |
| 3359 | 282.597 |
| 3360 | 283.597 |
| 3361 | 281.697 |
| 3362 | 282.677 |
| 3363 | 283.657 |
| 3364 | 284.637 |
| 3365 | 283.687 |
| 3366 | 281.087 |
| 3367 | 280.067 |
| 3368 | 277.767 |
| 3369 | 278.747 |
| 3370 | 279.727 |
| 3371 | 278.087 |
| 3372 | 275.887 |
| 3373 | 276.867 |
| 3374 | 277.847 |
| 3375 | 275.887 |
| 3376 | 276.867 |
| 3377 | 277.847 |
| 3378 | 278.827 |
| 3379 | 279.807 |
| 3380 | 280.787 |
| 3381 | 281.767 |
| 3382 | 282.747 |
| 3383 | 281.407 |
| 3384 | 282.407 |
| 3385 | 281.487 |
| 3386 | 278.687 |
| 3387 | 279.667 |
| 3388 | 280.667 |
| 3389 | 278.827 |
| 3390 | 279.827 |
| 3391 | 277.727 |
| 3392 | 276.327 |
| 3393 | 277.327 |
| 3394 | 276.327 |
| 3395 | 277.307 |
| 3396 | 278.287 |
| 3397 | 277.447 |
| 3398 | 275.447 |
| 3399 | 274.487 |
| 3400 | 275.487 |
| 3401 | 276.467 |
| 3402 | 277.447 |
| 3403 | 278.427 |
| 3404 | 279.407 |
| 3405 | 277.767 |
| 3406 | 275.767 |
| 3407 | 276.747 |
| 3408 | 277.727 |
| 3409 | 278.707 |
| 3410 | 277.487 |
| 3411 | 278.487 |
| 3412 | 275.837 |
| 3413 | 276.837 |
| 3414 | 274.537 |
| 3415 | 273.037 |
| 3416 | 270.437 |
| 3417 | 271.433 |
| 3418 | 270.03 |
| 3419 | 271.027 |
| 3420 | 272.027 |
| 3421 | 270.027 |
| 3422 | 271.027 |
| 3423 | 269.327 |
| 3424 | 266.677 |
| 3425 | 267.657 |
| 3426 | 268.637 |
| 3427 | 269.617 |
| 3428 | 270.597 |
| 3429 | 271.577 |
| 3430 | 272.577 |
| 3431 | 271.097 |
| 3432 | 268.647 |
| 3433 | 265.847 |
| 3434 | 266.847 |
| 3435 | 265.047 |
| 3436 | 263.127 |
| 3437 | 262.402 |
| 3438 | 263.397 |
| 3439 | 264.377 |
| 3440 | 265.357 |
| 3441 | 266.337 |
| 3442 | 267.337 |
| 3443 | 265.717 |
| 3444 | 264.697 |
| 3445 | 263.557 |
| 3446 | 264.557 |
| 3447 | 262.557 |
| 3448 | 263.537 |
| 3449 | 264.517 |
| 3450 | 265.497 |
| 3451 | 266.477 |
| 3452 | 267.457 |
| 3453 | 268.453 |
| 3454 | 267.13 |
| 3455 | 268.127 |
| 3456 | 269.107 |
| 3457 | 268.257 |
| 3458 | 266.757 |
| 3459 | 267.757 |
| 3460 | 265.007 |
| 3461 | 264.197 |
| 3462 | 263.622 |
| 3463 | 264.617 |
| 3464 | 265.597 |
| 3465 | 266.577 |
| 3466 | 267.557 |
| 3467 | 268.557 |
| 3468 | 266.557 |
| 3469 | 267.537 |
| 3470 | 266.397 |
| 3471 | 264.937 |
| 3472 | 265.917 |
| 3473 | 266.897 |
| 3474 | 264.847 |
| 3475 | 265.847 |
| 3476 | 266.847 |
| 3477 | 265.187 |
| 3478 | 264.027 |
| 3479 | 265.027 |
| 3480 | 262.677 |
| 3481 | 263.677 |
| 3482 | 264.657 |
| 3483 | 265.637 |
| 3484 | 266.617 |
| 3485 | 267.597 |
| 3486 | 266.297 |
| 3487 | 267.297 |
| 3488 | 265.397 |
| 3489 | 266.397 |
| 3490 | 267.397 |
| 3491 | 268.377 |
| 3492 | 269.357 |
| 3493 | 270.337 |
| 3494 | 271.317 |
| 3495 | 272.297 |
| 3496 | 273.277 |
| 3497 | 274.257 |
| 3498 | 273.077 |
| 3499 | 274.077 |
| 3500 | 271.377 |
| 3501 | 272.377 |
| 3502 | 273.357 |
| 3503 | 274.337 |
| 3504 | 275.317 |
| 3505 | 273.917 |
| 3506 | 271.267 |
| 3507 | 270.367 |
| 3508 | 269.457 |
| 3509 | 267.007 |
| 3510 | 264.457 |
| 3511 | 261.757 |
| 3512 | 262.757 |
| 3513 | 263.737 |
| 3514 | 262.177 |
| 3515 | 263.177 |
| 3516 | 264.177 |
| 3517 | 261.927 |
| 3518 | 262.927 |
| 3519 | 260.527 |
| 3520 | 261.527 |
| 3521 | 258.727 |
| 3522 | 259.727 |
| 3523 | 257.947 |
| 3524 | 258.927 |
| 3525 | 259.927 |
| 3526 | 258.947 |
| 3527 | 256.697 |
| 3528 | 257.697 |
| 3529 | 256.477 |
| 3530 | 254.857 |
| 3531 | 253.097 |
| 3532 | 250.597 |
| 3533 | 251.577 |
| 3534 | 249.977 |
| 3535 | 250.957 |
| 3536 | 251.937 |
| 3537 | 252.917 |
| 3538 | 253.897 |
| 3539 | 252.677 |
| 3540 | 253.677 |
| 3541 | 251.627 |
| 3542 | 252.627 |
| 3543 | 253.607 |
| 3544 | 254.587 |
| 3545 | 255.567 |
| 3546 | 256.547 |
| 3547 | 257.527 |
| 3548 | 258.527 |
| 3549 | 256.477 |
| 3550 | 253.877 |
| 3551 | 254.857 |
| 3552 | 253.449 |
| 3553 | 254.442 |
| 3554 | 255.434 |
| 3555 | 256.427 |
| 3556 | 257.407 |
| 3557 | 258.387 |
| 3558 | 259.367 |
| 3559 | 260.347 |
| 3560 | 258.707 |
| 3561 | 259.707 |
| 3562 | 260.687 |
| 3563 | 261.667 |
| 3564 | 262.667 |
| 3565 | 259.767 |
| 3566 | 258.167 |
| 3567 | 259.167 |
| 3568 | 260.167 |
| 3569 | 258.227 |
| 3570 | 259.207 |
| 3571 | 260.207 |
| 3572 | 258.227 |
| 3573 | 259.227 |
| 3574 | 258.107 |
| 3575 | 256.927 |
| 3576 | 256.077 |
| 3577 | 257.077 |
| 3578 | 258.057 |
| 3579 | 259.037 |
| 3580 | 260.017 |
| 3581 | 258.117 |
| 3582 | 256.797 |
| 3583 | 257.797 |
| 3584 | 256.257 |
| 3585 | 257.257 |
| 3586 | 258.257 |
| 3587 | 256.257 |
| 3588 | 253.557 |
| 3589 | 254.557 |
| 3590 | 252.107 |
| 3591 | 253.1 |
| 3592 | 251.873 |
| 3593 | 252.867 |
| 3594 | 253.847 |
| 3595 | 254.827 |
| 3596 | 255.807 |
| 3597 | 252.907 |
| 3598 | 251.707 |
| 3599 | 250.507 |
| 3600 | 251.507 |
| 3601 | 252.507 |
| 3602 | 250.687 |
| 3603 | 251.687 |
| 3604 | 249.187 |
| 3605 | 250.187 |
| 3606 | 248.427 |
| 3607 | 249.427 |
| 3608 | 250.427 |
| 3609 | 248.027 |
| 3610 | 249.027 |
| 3611 | 250.017 |
| 3612 | 250.997 |
| 3613 | 251.997 |
| 3614 | 250.137 |
| 3615 | 251.137 |
| 3616 | 252.117 |
| 3617 | 251.097 |
| 3618 | 252.097 |
| 3619 | 250.517 |
| 3620 | 251.517 |
| 3621 | 249.897 |
| 3622 | 248.037 |
| 3623 | 249.017 |
| 3624 | 250.017 |
| 3625 | 248.517 |
| 3626 | 249.497 |
| 3627 | 250.477 |
| 3628 | 251.457 |
| 3629 | 252.437 |
| 3630 | 250.037 |
| 3631 | 248.177 |
| 3632 | 249.177 |
| 3633 | 250.177 |
| 3634 | 247.827 |
| 3635 | 248.827 |
| 3636 | 247.267 |
| 3637 | 248.267 |
| 3638 | 249.247 |
| 3639 | 250.227 |
| 3640 | 251.207 |
| 3641 | 252.187 |
| 3642 | 250.663 |
| 3643 | 251.66 |
| 3644 | 252.657 |
| 3645 | 253.637 |
| 3646 | 254.617 |
| 3647 | 255.617 |
| 3648 | 254.457 |
| 3649 | 253.077 |
| 3650 | 254.057 |
| 3651 | 255.037 |
| 3652 | 256.017 |
| 3653 | 256.997 |
| 3654 | 257.997 |
| 3655 | 256.197 |
| 3656 | 257.177 |
| 3657 | 258.157 |
| 3658 | 256.513 |
| 3659 | 257.51 |
| 3660 | 258.507 |
| 3661 | 259.503 |
| 3662 | 257.9 |
| 3663 | 258.897 |
| 3664 | 259.877 |
| 3665 | 260.857 |
| 3666 | 261.837 |
| 3667 | 262.834 |
| 3668 | 263.832 |
| 3669 | 264.829 |
| 3670 | 262.377 |
| 3671 | 263.372 |
| 3672 | 261.387 |
| 3673 | 262.382 |
| 3674 | 263.377 |
| 3675 | 264.357 |
| 3676 | 265.337 |
| 3677 | 266.317 |
| 3678 | 267.317 |
| 3679 | 265.067 |
| 3680 | 266.067 |
| 3681 | 267.047 |
| 3682 | 264.847 |
| 3683 | 265.847 |
| 3684 | 266.847 |
| 3685 | 265.367 |
| 3686 | 266.367 |
| 3687 | 264.117 |
| 3688 | 265.117 |
| 3689 | 266.097 |
| 3690 | 267.077 |
| 3691 | 268.057 |
| 3692 | 269.057 |
| 3693 | 267.197 |
| 3694 | 265.047 |
| 3695 | 266.047 |
| 3696 | 264.907 |
| 3697 | 265.907 |
| 3698 | 266.887 |
| 3699 | 267.867 |
| 3700 | 268.847 |
| 3701 | 269.827 |
| 3702 | 268.847 |
| 3703 | 269.847 |
| 3704 | 270.847 |
| 3705 | 268.697 |
| 3706 | 266.697 |
| 3707 | 267.697 |
| 3708 | 268.697 |
| 3709 | 266.837 |
| 3710 | 267.817 |
| 3711 | 265.367 |
| 3712 | 262.717 |
| 3713 | 263.717 |
| 3714 | 261.717 |
| 3715 | 259.617 |
| 3716 | 257.417 |
| 3717 | 258.417 |
| 3718 | 259.397 |
| 3719 | 257.597 |
| 3720 | 258.597 |
| 3721 | 256.047 |
| 3722 | 254.927 |
| 3723 | 255.927 |
| 3724 | 256.907 |
| 3725 | 255.747 |
| 3726 | 256.747 |
| 3727 | 257.727 |
| 3728 | 258.727 |
| 3729 | 259.727 |
| 3730 | 256.877 |
| 3731 | 257.857 |
| 3732 | 258.837 |
| 3733 | 259.817 |
| 3734 | 260.797 |
| 3735 | 261.777 |
| 3736 | 262.757 |
| 3737 | 260.752 |
| 3738 | 261.747 |
| 3739 | 262.742 |
| 3740 | 263.737 |
| 3741 | 264.717 |
| 3742 | 265.697 |
| 3743 | 266.677 |
| 3744 | 267.657 |
| 3745 | 268.637 |
| 3746 | 269.617 |
| 3747 | 270.597 |
| 3748 | 271.577 |
| 3749 | 272.557 |
| 3750 | 273.537 |
| 3751 | 272.077 |
| 3752 | 273.077 |
| 3753 | 274.069 |
| 3754 | 272.181 |
| 3755 | 273.173 |
| 3756 | 274.165 |
| 3757 | 275.157 |
| 3758 | 273.577 |
| 3759 | 274.577 |
| 3760 | 271.627 |
| 3761 | 272.607 |
| 3762 | 273.587 |
| 3763 | 274.567 |
| 3764 | 275.547 |
| 3765 | 276.527 |
| 3766 | 275.947 |
| 3767 | 276.927 |
| 3768 | 277.907 |
| 3769 | 278.887 |
| 3770 | 279.887 |
| 3771 | 277.237 |
| 3772 | 278.217 |
| 3773 | 279.197 |
| 3774 | 280.177 |
| 3775 | 281.157 |
| 3776 | 282.137 |
| 3777 | 283.137 |
| 3778 | 284.137 |
| 3779 | 281.337 |
| 3780 | 279.037 |
| 3781 | 280.017 |
| 3782 | 280.997 |
| 3783 | 281.997 |
| 3784 | 279.797 |
| 3785 | 280.797 |
| 3786 | 278.697 |
| 3787 | 279.677 |
| 3788 | 280.657 |
| 3789 | 281.637 |
| 3790 | 282.617 |
| 3791 | 283.597 |
| 3792 | 284.577 |
| 3793 | 285.557 |
| 3794 | 286.537 |
| 3795 | 287.517 |
| 3796 | 288.497 |
| 3797 | 287.077 |
| 3798 | 285.297 |
| 3799 | 286.297 |
| 3800 | 287.297 |
| 3801 | 288.297 |
| 3802 | 285.697 |
| 3803 | 286.697 |
| 3804 | 283.997 |
| 3805 | 284.977 |
| 3806 | 285.957 |
| 3807 | 286.937 |
| 3808 | 287.917 |
| 3809 | 288.897 |
| 3810 | 289.877 |
| 3811 | 288.677 |
| 3812 | 289.657 |
| 3813 | 290.637 |
| 3814 | 288.337 |
| 3815 | 289.317 |
| 3816 | 290.297 |
| 3817 | 291.277 |
| 3818 | 292.257 |
| 3819 | 291.287 |
| 3820 | 292.287 |
| 3821 | 289.887 |
| 3822 | 288.347 |
| 3823 | 289.327 |
| 3824 | 290.307 |
| 3825 | 288.983 |
| 3826 | 289.98 |
| 3827 | 290.977 |
| 3828 | 289.037 |
| 3829 | 290.037 |
| 3830 | 287.787 |
| 3831 | 286.127 |
| 3832 | 287.127 |
| 3833 | 284.927 |
| 3834 | 285.927 |
| 3835 | 284.887 |
| 3836 | 285.887 |
| 3837 | 284.167 |
| 3838 | 285.167 |
| 3839 | 282.817 |
| 3840 | 283.797 |
| 3841 | 284.777 |
| 3842 | 285.757 |
| 3843 | 286.737 |
| 3844 | 284.537 |
| 3845 | 285.517 |
| 3846 | 286.497 |
| 3847 | 287.477 |
| 3848 | 286.157 |
| 3849 | 284.057 |
| 3850 | 285.037 |
| 3851 | 284.352 |
| 3852 | 285.347 |
| 3853 | 283.247 |
| 3854 | 284.247 |
| 3855 | 282.627 |
| 3856 | 281.267 |
| 3857 | 282.267 |
| 3858 | 280.447 |
| 3859 | 281.447 |
| 3860 | 282.427 |
| 3861 | 283.407 |
| 3862 | 282.067 |
| 3863 | 280.587 |
| 3864 | 278.087 |
| 3865 | 275.687 |
| 3866 | 276.667 |
| 3867 | 277.647 |
| 3868 | 276.087 |
| 3869 | 277.087 |
| 3870 | 278.067 |
| 3871 | 279.047 |
| 3872 | 280.027 |
| 3873 | 281.027 |
| 3874 | 278.977 |
| 3875 | 277.293 |
| 3876 | 278.29 |
| 3877 | 279.287 |
| 3878 | 280.287 |
| 3879 | 278.467 |
| 3880 | 279.467 |
| 3881 | 276.917 |
| 3882 | 277.897 |
| 3883 | 278.877 |
| 3884 | 279.877 |
| 3885 | 278.017 |
| 3886 | 278.997 |
| 3887 | 279.977 |
| 3888 | 280.957 |
| 3889 | 281.937 |
| 3890 | 282.917 |
| 3891 | 281.577 |
| 3892 | 282.577 |
| 3893 | 281.017 |
| 3894 | 282.017 |
| 3895 | 279.217 |
| 3896 | 278.267 |
| 3897 | 279.247 |
| 3898 | 280.227 |
| 3899 | 281.207 |
| 3900 | 282.207 |
| 3901 | 279.357 |
| 3902 | 278.277 |
| 3903 | 279.257 |
| 3904 | 277.397 |
| 3905 | 278.397 |
| 3906 | 279.397 |
| 3907 | 280.377 |
| 3908 | 281.377 |
| 3909 | 279.127 |
| 3910 | 280.107 |
| 3911 | 281.087 |
| 3912 | 282.067 |
| 3913 | 279.417 |
| 3914 | 280.417 |
| 3915 | 277.667 |
| 3916 | 278.667 |
| 3917 | 279.667 |
| 3918 | 277.517 |
| 3919 | 278.517 |
| 3920 | 279.517 |
| 3921 | 277.267 |
| 3922 | 276.267 |
| 3923 | 275.227 |
| 3924 | 276.227 |
| 3925 | 274.687 |
| 3926 | 272.537 |
| 3927 | 273.517 |
| 3928 | 274.497 |
| 3929 | 272.147 |
| 3930 | 271.207 |
| 3931 | 272.207 |
| 3932 | 273.187 |
| 3933 | 274.187 |
| 3934 | 271.637 |
| 3935 | 272.637 |
| 3936 | 270.487 |
| 3937 | 271.487 |
| 3938 | 271.017 |
| 3939 | 270.097 |
| 3940 | 269.097 |
| 3941 | 270.097 |
| 3942 | 267.747 |
| 3943 | 266.207 |
| 3944 | 267.187 |
| 3945 | 268.167 |
| 3946 | 269.147 |
| 3947 | 270.147 |
| 3948 | 267.947 |
| 3949 | 268.927 |
| 3950 | 269.907 |
| 3951 | 270.887 |
| 3952 | 271.867 |
| 3953 | 272.847 |
| 3954 | 271.84 |
| 3955 | 272.833 |
| 3956 | 273.827 |
| 3957 | 273.197 |
| 3958 | 271.837 |
| 3959 | 271.307 |
| 3960 | 272.307 |
| 3961 | 270.447 |
| 3962 | 269.167 |
| 3963 | 267.247 |
| 3964 | 268.247 |
| 3965 | 266.447 |
| 3966 | 265.952 |
| 3967 | 266.947 |
| 3968 | 267.927 |
| 3969 | 268.907 |
| 3970 | 269.887 |
| 3971 | 270.867 |
| 3972 | 271.863 |
| 3973 | 272.86 |
| 3974 | 271.457 |
| 3975 | 269.697 |
| 3976 | 268.257 |
| 3977 | 269.237 |
| 3978 | 270.217 |
| 3979 | 271.197 |
| 3980 | 272.197 |
| 3981 | 270.357 |
| 3982 | 271.357 |
| 3983 | 272.357 |
| 3984 | 270.677 |
| 3985 | 269.677 |
| 3986 | 267.797 |
| 3987 | 266.88 |
| 3988 | 267.873 |
| 3989 | 268.867 |
| 3990 | 267.087 |
| 3991 | 268.067 |
| 3992 | 269.047 |
| 3993 | 267.547 |
| 3994 | 266.027 |
| 3995 | 267.007 |
| 3996 | 267.987 |
| 3997 | 268.967 |
| 3998 | 269.947 |
| 3999 | 270.927 |
| 4000 | 271.907 |
| 4001 | 272.887 |
| 4002 | 272.342 |
| 4003 | 273.337 |
| 4004 | 274.317 |
| 4005 | 275.297 |
| 4006 | 276.277 |
| 4007 | 277.257 |
| 4008 | 278.237 |
| 4009 | 279.217 |
| 4010 | 277.317 |
| 4011 | 278.317 |
| 4012 | 277.447 |
| 4013 | 278.447 |
| 4014 | 279.447 |
| 4015 | 277.247 |
| 4016 | 278.227 |
| 4017 | 279.207 |
| 4018 | 278.407 |
| 4019 | 277.762 |
| 4020 | 278.757 |
| 4021 | 279.737 |
| 4022 | 278.137 |
| 4023 | 275.487 |
| 4024 | 274.227 |
| 4025 | 272.707 |
| 4026 | 271.467 |
| 4027 | 272.467 |
| 4028 | 273.447 |
| 4029 | 272.847 |
| 4030 | 273.827 |
| 4031 | 274.807 |
| 4032 | 275.787 |
| 4033 | 276.767 |
| 4034 | 275.937 |
| 4035 | 274.817 |
| 4036 | 275.797 |
| 4037 | 275.152 |
| 4038 | 276.147 |
| 4039 | 277.127 |
| 4040 | 278.107 |
| 4041 | 276.667 |
| 4042 | 273.867 |
| 4043 | 274.867 |
| 4044 | 275.867 |
| 4045 | 273.567 |
| 4046 | 274.567 |
| 4047 | 275.547 |
| 4048 | 276.527 |
| 4049 | 277.507 |
| 4050 | 278.487 |
| 4051 | 279.467 |
| 4052 | 280.447 |
| 4053 | 281.427 |
| 4054 | 282.407 |
| 4055 | 283.387 |
| 4056 | 282.067 |
| 4057 | 283.067 |
| 4058 | 280.467 |
| 4059 | 278.907 |
| 4060 | 279.887 |
| 4061 | 280.867 |
| 4062 | 281.847 |
| 4063 | 280.527 |
| 4064 | 281.527 |
| 4065 | 279.377 |
| 4066 | 280.357 |
| 4067 | 281.357 |
| 4068 | 279.107 |
| 4069 | 280.107 |
| 4070 | 281.107 |
| 4071 | 278.307 |
| 4072 | 279.287 |
| 4073 | 277.667 |
| 4074 | 276.227 |
| 4075 | 277.227 |
| 4076 | 276.357 |
| 4077 | 274.957 |
| 4078 | 272.907 |
| 4079 | 273.887 |
| 4080 | 274.867 |
| 4081 | 275.847 |
| 4082 | 274.877 |
| 4083 | 273.837 |
| 4084 | 274.837 |
| 4085 | 272.737 |
| 4086 | 273.737 |
| 4087 | 273.397 |
| 4088 | 272.667 |
| 4089 | 272.147 |
| 4090 | 270.347 |
| 4091 | 271.327 |
| 4092 | 269.747 |
| 4093 | 270.747 |
| 4094 | 267.947 |
| 4095 | 268.927 |
| 4096 | 269.927 |
| 4097 | 267.877 |
| 4098 | 268.877 |
| 4099 | 269.857 |
| 4100 | 267.957 |
| 4101 | 265.757 |
| 4102 | 264.577 |
| 4103 | 265.577 |
| 4104 | 266.557 |
| 4105 | 267.537 |
| 4106 | 268.517 |
| 4107 | 269.497 |
| 4108 | 270.477 |
| 4109 | 271.457 |
| 4110 | 272.457 |
| 4111 | 270.817 |
| 4112 | 271.807 |
| 4113 | 269.807 |
| 4114 | 270.807 |
| 4115 | 271.787 |
| 4116 | 272.767 |
| 4117 | 273.747 |
| 4118 | 274.727 |
| 4119 | 275.727 |
| 4120 | 272.827 |
| 4121 | 273.827 |
| 4122 | 270.927 |
| 4123 | 269.567 |
| 4124 | 270.547 |
| 4125 | 269.567 |
| 4126 | 270.547 |
| 4127 | 269.892 |
| 4128 | 270.887 |
| 4129 | 271.887 |
| 4130 | 269.687 |
| 4131 | 270.667 |
| 4132 | 270.017 |
| 4133 | 268.737 |
| 4134 | 267.317 |
| 4135 | 266.297 |
| 4136 | 265.847 |
| 4137 | 264.103 |
| 4138 | 265.1 |
| 4139 | 266.097 |
| 4140 | 264.597 |
| 4141 | 265.597 |
| 4142 | 266.597 |
| 4143 | 265.277 |
| 4144 | 266.257 |
| 4145 | 267.237 |
| 4146 | 268.217 |
| 4147 | 269.197 |
| 4148 | 267.537 |
| 4149 | 268.533 |
| 4150 | 269.53 |
| 4151 | 268.267 |
| 4152 | 269.247 |
| 4153 | 267.687 |
| 4154 | 265.927 |
| 4155 | 266.927 |
| 4156 | 267.927 |
| 4157 | 266.547 |
| 4158 | 267.527 |
| 4159 | 268.507 |
| 4160 | 267.782 |
| 4161 | 268.777 |
| 4162 | 269.757 |
| 4163 | 270.737 |
| 4164 | 271.717 |
| 4165 | 272.697 |
| 4166 | 273.677 |
| 4167 | 271.627 |
| 4168 | 268.677 |
| 4169 | 269.657 |
| 4170 | 270.637 |
| 4171 | 271.617 |
| 4172 | 272.597 |
| 4173 | 273.577 |
| 4174 | 274.557 |
| 4175 | 272.917 |
| 4176 | 273.897 |
| 4177 | 274.897 |
| 4178 | 272.447 |
| 4179 | 273.427 |
| 4180 | 271.687 |
| 4181 | 269.087 |
| 4182 | 270.067 |
| 4183 | 267.617 |
| 4184 | 268.617 |
| 4185 | 269.597 |
| 4186 | 270.577 |
| 4187 | 271.557 |
| 4188 | 268.857 |
| 4189 | 269.837 |
| 4190 | 270.817 |
| 4191 | 269.697 |
| 4192 | 270.693 |
| 4193 | 269.11 |
| 4194 | 270.107 |
| 4195 | 271.107 |
| 4196 | 269.167 |
| 4197 | 268.047 |
| 4198 | 269.047 |
| 4199 | 267.127 |
| 4200 | 268.107 |
| 4201 | 269.087 |
| 4202 | 268.1 |
| 4203 | 269.093 |
| 4204 | 270.087 |
| 4205 | 271.067 |
| 4206 | 272.067 |
| 4207 | 268.367 |
| 4208 | 269.367 |
| 4209 | 270.367 |
| 4210 | 265.667 |
| 4211 | 266.667 |
| 4212 | 265.127 |
| 4213 | 266.107 |
| 4214 | 267.087 |
| 4215 | 266.607 |
| 4216 | 267.597 |
| 4217 | 268.587 |
| 4218 | 267.283 |
| 4219 | 268.28 |
| 4220 | 269.277 |
| 4221 | 270.277 |
| 4222 | 269.257 |
| 4223 | 268.467 |
| 4224 | 266.627 |
| 4225 | 267.607 |
| 4226 | 268.587 |
| 4227 | 269.567 |
| 4228 | 270.547 |
| 4229 | 269.757 |
| 4230 | 268.797 |
| 4231 | 269.777 |
| 4232 | 270.757 |
| 4233 | 271.737 |
| 4234 | 272.717 |
| 4235 | 271.937 |
| 4236 | 270.197 |
| 4237 | 271.197 |
| 4238 | 270.4 |
| 4239 | 271.393 |
| 4240 | 272.387 |
| 4241 | 270.387 |
| 4242 | 271.387 |
| 4243 | 272.387 |
| 4244 | 271.652 |
| 4245 | 272.647 |
| 4246 | 273.627 |
| 4247 | 274.607 |
| 4248 | 275.587 |
| 4249 | 276.567 |
| 4250 | 274.417 |
| 4251 | 275.417 |
| 4252 | 276.417 |
| 4253 | 275.197 |
| 4254 | 276.177 |
| 4255 | 275.247 |
| 4256 | 274.147 |
| 4257 | 275.147 |
| 4258 | 273.147 |
| 4259 | 272.147 |
| 4260 | 273.127 |
| 4261 | 274.107 |
| 4262 | 272.267 |
| 4263 | 273.267 |
| 4264 | 271.867 |
| 4265 | 270.627 |
| 4266 | 271.627 |
| 4267 | 267.527 |
| 4268 | 265.827 |
| 4269 | 263.527 |
| 4270 | 264.527 |
| 4271 | 265.507 |
| 4272 | 266.487 |
| 4273 | 267.467 |
| 4274 | 268.467 |
| 4275 | 269.467 |
| 4276 | 270.467 |
| 4277 | 264.867 |
| 4278 | 264.127 |
| 4279 | 265.127 |
| 4280 | 263.077 |
| 4281 | 262.137 |
| 4282 | 263.137 |
| 4283 | 261.132 |
| 4284 | 262.127 |
| 4285 | 263.122 |
| 4286 | 264.117 |
| 4287 | 262.373 |
| 4288 | 263.37 |
| 4289 | 264.367 |
| 4290 | 265.363 |
| 4291 | 263.64 |
| 4292 | 264.637 |
| 4293 | 262.532 |
| 4294 | 263.527 |
| 4295 | 264.522 |
| 4296 | 265.517 |
| 4297 | 263.777 |
| 4298 | 264.777 |
| 4299 | 263.867 |
| 4300 | 264.867 |
| 4301 | 260.867 |
| 4302 | 261.847 |
| 4303 | 262.827 |
| 4304 | 261.367 |
| 4305 | 262.367 |
| 4306 | 260.387 |
| 4307 | 261.379 |
| 4308 | 259.752 |
| 4309 | 260.744 |
| 4310 | 261.737 |
| 4311 | 260.097 |
| 4312 | 261.097 |
| 4313 | 262.077 |
| 4314 | 263.057 |
| 4315 | 264.037 |
| 4316 | 265.037 |
| 4317 | 262.837 |
| 4318 | 263.837 |
| 4319 | 261.737 |
| 4320 | 262.737 |
| 4321 | 263.737 |
| 4322 | 264.737 |
| 4323 | 263.217 |
| 4324 | 260.417 |
| 4325 | 259.217 |
| 4326 | 260.217 |
| 4327 | 261.217 |
| 4328 | 262.217 |
| 4329 | 260.357 |
| 4330 | 261.337 |
| 4331 | 262.317 |
| 4332 | 261.317 |
| 4333 | 262.317 |
| 4334 | 261.677 |
| 4335 | 260.157 |
| 4336 | 261.157 |
| 4337 | 262.157 |
| 4338 | 263.157 |
| 4339 | 260.607 |
| 4340 | 259.787 |
| 4341 | 260.787 |
| 4342 | 261.787 |
| 4343 | 260.937 |
| 4344 | 259.653 |
| 4345 | 260.65 |
| 4346 | 261.647 |
| 4347 | 262.627 |
| 4348 | 263.607 |
| 4349 | 264.587 |
| 4350 | 265.583 |
| 4351 | 263.98 |
| 4352 | 264.977 |
| 4353 | 263.937 |
| 4354 | 264.937 |
| 4355 | 265.937 |
| 4356 | 263.537 |
| 4357 | 264.537 |
| 4358 | 265.517 |
| 4359 | 266.497 |
| 4360 | 265.213 |
| 4361 | 266.21 |
| 4362 | 267.207 |
| 4363 | 265.463 |
| 4364 | 266.46 |
| 4365 | 267.457 |
| 4366 | 268.437 |
| 4367 | 269.417 |
| 4368 | 270.41 |
| 4369 | 269.223 |
| 4370 | 270.217 |
| 4371 | 271.21 |
| 4372 | 270.403 |
| 4373 | 271.397 |
| 4374 | 270.377 |
| 4375 | 268.327 |
| 4376 | 269.323 |
| 4377 | 268.06 |
| 4378 | 269.057 |
| 4379 | 267.509 |
| 4380 | 268.502 |
| 4381 | 269.494 |
| 4382 | 270.487 |
| 4383 | 271.467 |
| 4384 | 272.447 |
| 4385 | 270.723 |
| 4386 | 271.72 |
| 4387 | 272.717 |
| 4388 | 270.997 |
| 4389 | 271.997 |
| 4390 | 272.977 |
| 4391 | 273.957 |
| 4392 | 274.957 |
| 4393 | 273.097 |
| 4394 | 274.097 |
| 4395 | 275.097 |
| 4396 | 273.097 |
| 4397 | 274.077 |
| 4398 | 275.057 |
| 4399 | 276.037 |
| 4400 | 277.017 |
| 4401 | 277.997 |
| 4402 | 278.977 |
| 4403 | 279.957 |
| 4404 | 278.497 |
| 4405 | 275.297 |
| 4406 | 276.297 |
| 4407 | 277.277 |
| 4408 | 278.257 |
| 4409 | 279.257 |
| 4410 | 277.437 |
| 4411 | 278.437 |
| 4412 | 279.433 |
| 4413 | 280.43 |
| 4414 | 278.907 |
| 4415 | 279.887 |
| 4416 | 280.867 |
| 4417 | 277.667 |
| 4418 | 278.667 |
| 4419 | 277.922 |
| 4420 | 278.917 |
| 4421 | 279.917 |
| 4422 | 279.077 |
| 4423 | 276.827 |
| 4424 | 277.827 |
| 4425 | 278.827 |
| 4426 | 276.077 |
| 4427 | 277.077 |
| 4428 | 278.077 |
| 4429 | 276.497 |
| 4430 | 274.757 |
| 4431 | 272.857 |
| 4432 | 273.857 |
| 4433 | 274.857 |
| 4434 | 272.357 |
| 4435 | 273.357 |
| 4436 | 274.337 |
| 4437 | 275.317 |
| 4438 | 276.297 |
| 4439 | 277.277 |
| 4440 | 278.257 |
| 4441 | 279.237 |
| 4442 | 280.217 |
| 4443 | 281.217 |
| 4444 | 279.497 |
| 4445 | 277.447 |
| 4446 | 278.447 |
| 4447 | 275.597 |
| 4448 | 276.597 |
| 4449 | 277.597 |
| 4450 | 278.597 |
| 4451 | 279.597 |
| 4452 | 275.797 |
| 4453 | 276.777 |
| 4454 | 277.757 |
| 4455 | 276.757 |
| 4456 | 277.757 |
| 4457 | 278.757 |
| 4458 | 277.077 |
| 4459 | 278.077 |
| 4460 | 276.457 |
| 4461 | 277.437 |
| 4462 | 278.417 |
| 4463 | 276.577 |
| 4464 | 277.577 |
| 4465 | 278.577 |
| 4466 | 275.177 |
| 4467 | 274.427 |
| 4468 | 275.417 |
| 4469 | 276.407 |
| 4470 | 275.227 |
| 4471 | 273.987 |
| 4472 | 274.987 |
| 4473 | 275.987 |
| 4474 | 276.987 |
| 4475 | 274.887 |
| 4476 | 275.887 |
| 4477 | 274.927 |
| 4478 | 275.917 |
| 4479 | 276.907 |
| 4480 | 277.897 |
| 4481 | 278.897 |
| 4482 | 276.897 |
| 4483 | 277.897 |
| 4484 | 278.877 |
| 4485 | 279.857 |
| 4486 | 277.807 |
| 4487 | 278.807 |
| 4488 | 279.807 |
| 4489 | 278.303 |
| 4490 | 279.3 |
| 4491 | 280.297 |
| 4492 | 281.297 |
| 4493 | 278.447 |
| 4494 | 277.24 |
| 4495 | 278.233 |
| 4496 | 279.227 |
| 4497 | 280.207 |
| 4498 | 281.187 |
| 4499 | 282.167 |
| 4500 | 283.147 |
| 4501 | 284.127 |
| 4502 | 285.119 |
| 4503 | 283.792 |
| 4504 | 284.784 |
| 4505 | 285.777 |
| 4506 | 286.757 |
| 4507 | 287.737 |
| 4508 | 288.717 |
| 4509 | 287.277 |
| 4510 | 288.277 |
| 4511 | 289.257 |
| 4512 | 290.237 |
| 4513 | 291.237 |
| 4514 | 292.237 |
| 4515 | 289.287 |
| 4516 | 287.983 |
| 4517 | 288.98 |
| 4518 | 289.977 |
| 4519 | 290.977 |
| 4520 | 291.977 |
| 4521 | 292.977 |
| 4522 | 288.877 |
| 4523 | 289.857 |
| 4524 | 290.837 |
| 4525 | 291.817 |
| 4526 | 292.797 |
| 4527 | 293.777 |
| 4528 | 292.213 |
| 4529 | 293.21 |
| 4530 | 294.207 |
| 4531 | 295.187 |
| 4532 | 296.167 |
| 4533 | 297.147 |
| 4534 | 298.127 |
| 4535 | 296.399 |
| 4536 | 297.392 |
| 4537 | 298.384 |
| 4538 | 299.377 |
| 4539 | 300.357 |
| 4540 | 301.337 |
| 4541 | 302.317 |
| 4542 | 300.167 |
| 4543 | 301.167 |
| 4544 | 302.167 |
| 4545 | 303.167 |
| 4546 | 300.167 |
| 4547 | 301.167 |
| 4548 | 302.167 |
| 4549 | 303.167 |
| 4550 | 299.367 |
| 4551 | 300.347 |
| 4552 | 301.327 |
| 4553 | 302.307 |
| 4554 | 303.287 |
| 4555 | 304.282 |
| 4556 | 302.277 |
| 4557 | 303.272 |
| 4558 | 304.267 |
| 4559 | 305.267 |
| 4560 | 303.927 |
| 4561 | 302.383 |
| 4562 | 303.38 |
| 4563 | 304.377 |
| 4564 | 302.797 |
| 4565 | 303.797 |
| 4566 | 304.777 |
| 4567 | 305.757 |
| 4568 | 306.737 |
| 4569 | 307.717 |
| 4570 | 308.697 |
| 4571 | 309.677 |
| 4572 | 308.397 |
| 4573 | 309.397 |
| 4574 | 308.457 |
| 4575 | 309.457 |
| 4576 | 307.637 |
| 4577 | 308.637 |
| 4578 | 309.637 |
| 4579 | 308.217 |
| 4580 | 309.217 |
| 4581 | 310.217 |
| 4582 | 307.767 |
| 4583 | 306.967 |
| 4584 | 307.967 |
| 4585 | 306.407 |
| 4586 | 307.407 |
| 4587 | 308.399 |
| 4588 | 309.392 |
| 4589 | 308.124 |
| 4590 | 309.117 |
| 4591 | 308.237 |
| 4592 | 309.237 |
| 4593 | 307.817 |
| 4594 | 308.817 |
| 4595 | 309.797 |
| 4596 | 310.777 |
| 4597 | 309.197 |
| 4598 | 310.197 |
| 4599 | 308.392 |
| 4600 | 309.387 |
| 4601 | 310.382 |
| 4602 | 311.377 |
| 4603 | 312.377 |
| 4604 | 313.377 |
| 4605 | 314.377 |
| 4606 | 311.577 |
| 4607 | 309.973 |
| 4608 | 310.97 |
| 4609 | 311.967 |
| 4610 | 312.947 |
| 4611 | 313.927 |
| 4612 | 311.772 |
| 4613 | 312.767 |
| 4614 | 313.762 |
| 4615 | 314.757 |
| 4616 | 315.737 |
| 4617 | 316.717 |
| 4618 | 317.697 |
| 4619 | 315.877 |
| 4620 | 316.877 |
| 4621 | 317.877 |
| 4622 | 316.513 |
| 4623 | 317.51 |
| 4624 | 318.507 |
| 4625 | 319.487 |
| 4626 | 320.467 |
| 4627 | 321.46 |
| 4628 | 320.433 |
| 4629 | 321.427 |
| 4630 | 322.407 |
| 4631 | 323.387 |
| 4632 | 321.847 |
| 4633 | 319.597 |
| 4634 | 320.597 |
| 4635 | 321.597 |
| 4636 | 320.597 |
| 4637 | 321.597 |
| 4638 | 322.597 |
| 4639 | 321.297 |
| 4640 | 322.297 |
| 4641 | 323.297 |
| 4642 | 320.597 |
| 4643 | 321.577 |
| 4644 | 322.557 |
| 4645 | 323.537 |
| 4646 | 324.517 |
| 4647 | 323.617 |
| 4648 | 324.617 |
| 4649 | 325.597 |
| 4650 | 326.577 |
| 4651 | 325.49 |
| 4652 | 326.483 |
| 4653 | 327.477 |
| 4654 | 326.017 |
| 4655 | 323.917 |
| 4656 | 324.917 |
| 4657 | 324.077 |
| 4658 | 325.077 |
| 4659 | 326.074 |
| 4660 | 327.072 |
| 4661 | 324.369 |
| 4662 | 325.367 |
| 4663 | 326.347 |
| 4664 | 327.327 |
| 4665 | 325.127 |
| 4666 | 326.127 |
| 4667 | 324.463 |
| 4668 | 325.46 |
| 4669 | 326.457 |
| 4670 | 327.437 |
| 4671 | 328.417 |
| 4672 | 329.397 |
| 4673 | 330.377 |
| 4674 | 331.357 |
| 4675 | 332.337 |
| 4676 | 330.557 |
| 4677 | 331.557 |
| 4678 | 332.537 |
| 4679 | 333.517 |
| 4680 | 331.617 |
| 4681 | 328.667 |
| 4682 | 329.647 |
| 4683 | 330.627 |
| 4684 | 331.607 |
| 4685 | 332.587 |
| 4686 | 333.567 |
| 4687 | 331.747 |
| 4688 | 332.747 |
| 4689 | 333.727 |
| 4690 | 334.707 |
| 4691 | 335.687 |
| 4692 | 336.667 |
| 4693 | 337.647 |
| 4694 | 338.627 |
| 4695 | 337.067 |
| 4696 | 338.067 |
| 4697 | 339.067 |
| 4698 | 340.067 |
| 4699 | 337.517 |
| 4700 | 338.497 |
| 4701 | 339.477 |
| 4702 | 337.677 |
| 4703 | 338.677 |
| 4704 | 336.953 |
| 4705 | 337.95 |
| 4706 | 338.947 |
| 4707 | 339.927 |
| 4708 | 340.907 |
| 4709 | 341.887 |
| 4710 | 342.867 |
| 4711 | 341.427 |
| 4712 | 342.427 |
| 4713 | 343.42 |
| 4714 | 342.233 |
| 4715 | 343.227 |
| 4716 | 342.007 |
| 4717 | 343.007 |
| 4718 | 342.227 |
| 4719 | 343.227 |
| 4720 | 340.527 |
| 4721 | 341.507 |
| 4722 | 342.487 |
| 4723 | 343.467 |
| 4724 | 344.457 |
| 4725 | 345.437 |
| 4726 | 346.417 |
| 4727 | 347.397 |
| 4728 | 348.377 |
| 4729 | 349.357 |
| 4730 | 350.357 |
| 4731 | 348.007 |
| 4732 | 349.007 |
| 4733 | 347.447 |
| 4734 | 348.447 |
| 4735 | 349.427 |
| 4736 | 350.407 |
| 4737 | 351.407 |
| 4738 | 352.407 |
| 4739 | 348.307 |
| 4740 | 349.287 |
| 4741 | 350.267 |
| 4742 | 351.247 |
| 4743 | 352.227 |
| 4744 | 351.547 |
| 4745 | 352.537 |
| 4746 | 353.527 |
| 4747 | 354.527 |
| 4748 | 351.627 |
| 4749 | 352.627 |
| 4750 | 353.607 |
| 4751 | 354.587 |
| 4752 | 355.567 |
| 4753 | 356.547 |
| 4754 | 357.527 |
| 4755 | 358.507 |
| 4756 | 359.507 |
| 4757 | 356.757 |
| 4758 | 357.757 |
| 4759 | 358.737 |
| 4760 | 359.717 |
| 4761 | 360.697 |
| 4762 | 361.677 |
| 4763 | 362.657 |
| 4764 | 361.867 |
| 4765 | 360.967 |
| 4766 | 361.967 |
| 4767 | 360.727 |
| 4768 | 361.727 |
| 4769 | 360.507 |
| 4770 | 361.507 |
| 4771 | 358.107 |
| 4772 | 359.087 |
| 4773 | 360.067 |
| 4774 | 361.067 |
| 4775 | 360.027 |
| 4776 | 359.297 |
| 4777 | 360.287 |
| 4778 | 361.277 |
| 4779 | 359.737 |
| 4780 | 360.737 |
| 4781 | 357.037 |
| 4782 | 358.037 |
| 4783 | 359.037 |
| 4784 | 354.137 |
| 4785 | 355.137 |
| 4786 | 352.237 |
| 4787 | 353.237 |
| 4788 | 354.217 |
| 4789 | 355.197 |
| 4790 | 356.193 |
| 4791 | 357.19 |
| 4792 | 355.767 |
| 4793 | 356.767 |
| 4794 | 357.767 |
| 4795 | 355.667 |
| 4796 | 356.647 |
| 4797 | 357.627 |
| 4798 | 355.727 |
| 4799 | 356.727 |
| 4800 | 357.727 |
| 4801 | 358.727 |
| 4802 | 356.907 |
| 4803 | 357.907 |
| 4804 | 356.563 |
| 4805 | 357.56 |
| 4806 | 358.557 |
| 4807 | 359.537 |
| 4808 | 360.517 |
| 4809 | 361.497 |
| 4810 | 362.477 |
| 4811 | 363.477 |
| 4812 | 360.477 |
| 4813 | 361.477 |
| 4814 | 360.177 |
| 4815 | 361.157 |
| 4816 | 362.137 |
| 4817 | 363.137 |
| 4818 | 360.787 |
| 4819 | 361.767 |
| 4820 | 362.747 |
| 4821 | 363.727 |
| 4822 | 364.707 |
| 4823 | 365.687 |
| 4824 | 366.667 |
| 4825 | 367.647 |
| 4826 | 368.647 |
| 4827 | 365.797 |
| 4828 | 366.797 |
| 4829 | 365.177 |
| 4830 | 363.577 |
| 4831 | 364.577 |
| 4832 | 363.317 |
| 4833 | 361.537 |
| 4834 | 359.437 |
| 4835 | 360.437 |
| 4836 | 359.23 |
| 4837 | 360.223 |
| 4838 | 361.217 |
| 4839 | 362.217 |
| 4840 | 359.617 |
| 4841 | 360.597 |
| 4842 | 361.577 |
| 4843 | 358.277 |
| 4844 | 359.277 |
| 4845 | 357.317 |
| 4846 | 358.317 |
| 4847 | 359.317 |
| 4848 | 358.177 |
| 4849 | 353.777 |
| 4850 | 354.777 |
| 4851 | 355.77 |
| 4852 | 354.583 |
| 4853 | 355.577 |
| 4854 | 356.557 |
| 4855 | 357.537 |
| 4856 | 358.517 |
| 4857 | 359.497 |
| 4858 | 360.477 |
| 4859 | 361.457 |
| 4860 | 362.437 |
| 4861 | 363.417 |
| 4862 | 364.397 |
| 4863 | 365.377 |
| 4864 | 366.357 |
| 4865 | 367.337 |
| 4866 | 368.317 |
| 4867 | 369.317 |
| 4868 | 365.317 |
| 4869 | 366.297 |
| 4870 | 367.277 |
| 4871 | 368.277 |
| 4872 | 363.277 |
| 4873 | 362.237 |
| 4874 | 363.237 |
| 4875 | 364.217 |
| 4876 | 365.197 |
| 4877 | 364.487 |
| 4878 | 365.487 |
| 4879 | 363.807 |
| 4880 | 364.807 |
| 4881 | 363.807 |
| 4882 | 364.807 |
| 4883 | 365.807 |
| 4884 | 363.707 |
| 4885 | 364.707 |
| 4886 | 365.707 |
| 4887 | 366.707 |
| 4888 | 363.307 |
| 4889 | 364.307 |
| 4890 | 362.007 |
| 4891 | 363.007 |
| 4892 | 361.667 |
| 4893 | 362.667 |
| 4894 | 360.767 |
| 4895 | 361.767 |
| 4896 | 362.767 |
| 4897 | 363.747 |
| 4898 | 364.727 |
| 4899 | 365.707 |
| 4900 | 363.457 |
| 4901 | 364.457 |
| 4902 | 365.457 |
| 4903 | 362.557 |
| 4904 | 363.537 |
| 4905 | 364.517 |
| 4906 | 365.497 |
| 4907 | 366.477 |
| 4908 | 367.457 |
| 4909 | 368.437 |
| 4910 | 369.417 |
| 4911 | 370.397 |
| 4912 | 371.377 |
| 4913 | 372.377 |
| 4914 | 371.237 |
| 4915 | 370.057 |
| 4916 | 368.777 |
| 4917 | 369.777 |
| 4918 | 370.757 |
| 4919 | 371.737 |
| 4920 | 372.717 |
| 4921 | 372.017 |
| 4922 | 373.007 |
| 4923 | 373.997 |
| 4924 | 372.377 |
| 4925 | 373.377 |
| 4926 | 374.372 |
| 4927 | 375.367 |
| 4928 | 373.522 |
| 4929 | 374.517 |
| 4930 | 375.497 |
| 4931 | 376.477 |
| 4932 | 374.733 |
| 4933 | 375.73 |
| 4934 | 376.727 |
| 4935 | 375.667 |
| 4936 | 376.667 |
| 4937 | 374.787 |
| 4938 | 375.787 |
| 4939 | 376.787 |
| 4940 | 373.687 |
| 4941 | 371.742 |
| 4942 | 372.737 |
| 4943 | 373.732 |
| 4944 | 374.727 |
| 4945 | 373.267 |
| 4946 | 374.267 |
| 4947 | 375.247 |
| 4948 | 376.227 |
| 4949 | 377.207 |
| 4950 | 378.187 |
| 4951 | 379.167 |
| 4952 | 380.147 |
| 4953 | 381.127 |
| 4954 | 379.927 |
| 4955 | 380.927 |
| 4956 | 378.827 |
| 4957 | 379.827 |
| 4958 | 380.807 |
| 4959 | 381.787 |
| 4960 | 382.767 |
| 4961 | 383.747 |
| 4962 | 384.747 |
| 4963 | 380.947 |
| 4964 | 381.927 |
| 4965 | 382.907 |
| 4966 | 383.887 |
| 4967 | 384.887 |
| 4968 | 385.887 |
| 4969 | 383.737 |
| 4970 | 384.737 |
| 4971 | 382.937 |
| 4972 | 380.037 |
| 4973 | 381.037 |
| 4974 | 382.017 |
| 4975 | 382.997 |
| 4976 | 383.997 |
| 4977 | 381.747 |
| 4978 | 382.727 |
| 4979 | 383.707 |
| 4980 | 384.687 |
| 4981 | 385.667 |
| 4982 | 386.647 |
| 4983 | 387.627 |
| 4984 | 388.607 |
| 4985 | 389.587 |
| 4986 | 390.567 |
| 4987 | 391.567 |
| 4988 | 392.567 |
| 4989 | 389.167 |
| 4990 | 387.327 |
| 4991 | 385.127 |
| 4992 | 386.127 |
| 4993 | 387.127 |
| 4994 | 385.687 |
| 4995 | 384.087 |
| 4996 | 385.087 |
| 4997 | 386.087 |
| 4998 | 383.887 |
| 4999 | 384.887 |
| 5000 | 385.882 |
| 5001 | 386.877 |
| 5002 | 385.112 |
| 5003 | 386.107 |
| 5004 | 384.547 |
| 5005 | 382.707 |
| 5006 | 383.707 |
| 5007 | 384.707 |
| 5008 | 383.087 |
| 5009 | 381.307 |
| 5010 | 377.207 |
| 5011 | 378.199 |
| 5012 | 376.892 |
| 5013 | 377.884 |
| 5014 | 378.877 |
| 5015 | 377.277 |
| 5016 | 378.277 |
| 5017 | 379.257 |
| 5018 | 380.237 |
| 5019 | 381.237 |
| 5020 | 378.487 |
| 5021 | 376.707 |
| 5022 | 377.707 |
| 5023 | 378.707 |
| 5024 | 377.227 |
| 5025 | 378.227 |
| 5026 | 376.027 |
| 5027 | 377.027 |
| 5028 | 378.007 |
| 5029 | 378.987 |
| 5030 | 379.967 |
| 5031 | 380.967 |
| 5032 | 379.127 |
| 5033 | 380.107 |
| 5034 | 381.087 |
| 5035 | 382.087 |
| 5036 | 380.207 |
| 5037 | 381.187 |
| 5038 | 382.167 |
| 5039 | 383.167 |
| 5040 | 381.567 |
| 5041 | 378.667 |
| 5042 | 379.647 |
| 5043 | 380.627 |
| 5044 | 381.627 |
| 5045 | 382.627 |
| 5046 | 378.627 |
| 5047 | 379.627 |
| 5048 | 380.627 |
| 5049 | 375.627 |
| 5050 | 376.607 |
| 5051 | 377.587 |
| 5052 | 378.567 |
| 5053 | 376.417 |
| 5054 | 377.417 |
| 5055 | 378.417 |
| 5056 | 379.397 |
| 5057 | 380.377 |
| 5058 | 381.357 |
| 5059 | 382.337 |
| 5060 | 383.317 |
| 5061 | 384.297 |
| 5062 | 385.277 |
| 5063 | 386.274 |
| 5064 | 383.872 |
| 5065 | 384.869 |
| 5066 | 385.867 |
| 5067 | 384.563 |
| 5068 | 385.56 |
| 5069 | 386.557 |
| 5070 | 387.537 |
| 5071 | 388.517 |
| 5072 | 389.497 |
| 5073 | 387.247 |
| 5074 | 384.347 |
| 5075 | 385.347 |
| 5076 | 386.327 |
| 5077 | 387.307 |
| 5078 | 388.287 |
| 5079 | 389.267 |
| 5080 | 390.247 |
| 5081 | 388.927 |
| 5082 | 387.407 |
| 5083 | 388.393 |
| 5084 | 389.38 |
| 5085 | 390.375 |
| 5086 | 388.17 |
| 5087 | 389.165 |
| 5088 | 390.16 |
| 5089 | 391.14 |
| 5090 | 392.12 |
| 5091 | 393.1 |
| 5092 | 394.08 |
| 5093 | 395.06 |
| 5094 | 396.06 |
| 5095 | 397.06 |
| 5096 | 392.66 |
| 5097 | 393.66 |
| 5098 | 391.66 |
| 5099 | 389.16 |
| 5100 | 390.16 |
| 5101 | 386.86 |
| 5102 | 387.86 |
| 5103 | 388.84 |
| 5104 | 389.82 |
| 5105 | 388.56 |
| 5106 | 386.46 |
| 5107 | 387.46 |
| 5108 | 385.78 |
| 5109 | 386.778 |
| 5110 | 387.775 |
| 5111 | 385.023 |
| 5112 | 386.02 |
| 5113 | 387 |
| 5114 | 387.98 |
| 5115 | 388.96 |
| 5116 | 389.953 |
| 5117 | 390.945 |
| 5118 | 389.618 |
| 5119 | 390.61 |
| 5120 | 391.59 |
| 5121 | 392.57 |
| 5122 | 393.55 |
| 5123 | 394.53 |
| 5124 | 393.39 |
| 5125 | 394.39 |
| 5126 | 395.39 |
| 5127 | 392.69 |
| 5128 | 393.67 |
| 5129 | 394.65 |
| 5130 | 395.647 |
| 5131 | 393.963 |
| 5132 | 394.96 |
| 5133 | 395.94 |
| 5134 | 396.92 |
| 5135 | 397.9 |
| 5136 | 398.88 |
| 5137 | 399.86 |
| 5138 | 397.76 |
| 5139 | 398.76 |
| 5140 | 399.74 |
| 5141 | 400.72 |
| 5142 | 397.22 |
| 5143 | 398.22 |
| 5144 | 399.22 |
| 5145 | 400.22 |
| 5146 | 397.82 |
| 5147 | 398.82 |
| 5148 | 397.96 |
| 5149 | 396.18 |
| 5150 | 397.18 |
| 5151 | 398.18 |
| 5152 | 399.16 |
| 5153 | 400.14 |
| 5154 | 401.14 |
| 5155 | 399.38 |
| 5156 | 400.38 |
| 5157 | 399.153 |
| 5158 | 400.147 |
| 5159 | 401.14 |
| 5160 | 402.12 |
| 5161 | 403.1 |
| 5162 | 404.08 |
| 5163 | 405.06 |
| 5164 | 406.04 |
| 5165 | 407.02 |
| 5166 | 408 |
| 5167 | 409 |
| 5168 | 410 |
| 5169 | 405.1 |
| 5170 | 404.3 |
| 5171 | 403.32 |
| 5172 | 401.5 |
| 5173 | 402.5 |
| 5174 | 400.66 |
| 5175 | 401.66 |
| 5176 | 402.66 |
| 5177 | 403.64 |
| 5178 | 404.62 |
| 5179 | 405.62 |
| 5180 | 404.3 |
| 5181 | 402.94 |
| 5182 | 403.94 |
| 5183 | 404.94 |
| 5184 | 402.39 |
| 5185 | 403.39 |
| 5186 | 401.81 |
| 5187 | 400.11 |
| 5188 | 401.11 |
| 5189 | 402.09 |
| 5190 | 403.07 |
| 5191 | 404.07 |
| 5192 | 401.82 |
| 5193 | 402.82 |
| 5194 | 403.8 |
| 5195 | 404.78 |
| 5196 | 403.93 |
| 5197 | 404.93 |
| 5198 | 403.19 |
| 5199 | 404.19 |
| 5200 | 402.65 |
| 5201 | 403.65 |
| 5202 | 404.63 |
| 5203 | 405.61 |
| 5204 | 406.608 |
| 5205 | 405.165 |
| 5206 | 406.163 |
| 5207 | 407.143 |
| 5208 | 408.123 |
| 5209 | 409.123 |
| 5210 | 408.233 |
| 5211 | 409.233 |
| 5212 | 405.833 |
| 5213 | 406.813 |
| 5214 | 407.793 |
| 5215 | 408.793 |
| 5216 | 406.693 |
| 5217 | 407.673 |
| 5218 | 408.653 |
| 5219 | 409.633 |
| 5220 | 408.033 |
| 5221 | 405.633 |
| 5222 | 404.253 |
| 5223 | 405.253 |
| 5224 | 406.246 |
| 5225 | 405.239 |
| 5226 | 406.233 |
| 5227 | 404.693 |
| 5228 | 402.343 |
| 5229 | 403.343 |
| 5230 | 404.323 |
| 5231 | 405.303 |
| 5232 | 406.3 |
| 5233 | 403.848 |
| 5234 | 404.845 |
| 5235 | 405.843 |
| 5236 | 403.593 |
| 5237 | 404.593 |
| 5238 | 401.293 |
| 5239 | 402.288 |
| 5240 | 400.233 |
| 5241 | 401.228 |
| 5242 | 402.223 |
| 5243 | 401.213 |
| 5244 | 402.203 |
| 5245 | 403.193 |
| 5246 | 404.183 |
| 5247 | 405.163 |
| 5248 | 406.143 |
| 5249 | 407.123 |
| 5250 | 408.103 |
| 5251 | 409.103 |
| 5252 | 407.323 |
| 5253 | 406.413 |
| 5254 | 407.413 |
| 5255 | 408.393 |
| 5256 | 409.373 |
| 5257 | 410.373 |
| 5258 | 411.373 |
| 5259 | 409.273 |
| 5260 | 406.923 |
| 5261 | 407.923 |
| 5262 | 404.623 |
| 5263 | 405.623 |
| 5264 | 404.603 |
| 5265 | 405.603 |
| 5266 | 404.503 |
| 5267 | 401.653 |
| 5268 | 400.673 |
| 5269 | 401.673 |
| 5270 | 402.653 |
| 5271 | 403.633 |
| 5272 | 404.633 |
| 5273 | 402.693 |
| 5274 | 403.693 |
| 5275 | 401.833 |
| 5276 | 402.833 |
| 5277 | 401.525 |
| 5278 | 402.518 |
| 5279 | 403.51 |
| 5280 | 404.503 |
| 5281 | 402.718 |
| 5282 | 403.713 |
| 5283 | 404.708 |
| 5284 | 405.703 |
| 5285 | 404.235 |
| 5286 | 405.228 |
| 5287 | 406.22 |
| 5288 | 407.213 |
| 5289 | 408.213 |
| 5290 | 406.553 |
| 5291 | 407.553 |
| 5292 | 405.453 |
| 5293 | 406.453 |
| 5294 | 407.443 |
| 5295 | 408.423 |
| 5296 | 409.403 |
| 5297 | 410.383 |
| 5298 | 411.363 |
| 5299 | 410.003 |
| 5300 | 411.003 |
| 5301 | 411.989 |
| 5302 | 412.976 |
| 5303 | 413.956 |
| 5304 | 414.936 |
| 5305 | 415.916 |
| 5306 | 416.916 |
| 5307 | 417.916 |
| 5308 | 413.916 |
| 5309 | 412.316 |
| 5310 | 413.316 |
| 5311 | 414.316 |
| 5312 | 412.916 |
| 5313 | 413.916 |
| 5314 | 410.416 |
| 5315 | 411.416 |
| 5316 | 409.216 |
| 5317 | 410.216 |
| 5318 | 407.466 |
| 5319 | 406.643 |
| 5320 | 405.741 |
| 5321 | 406.738 |
| 5322 | 407.736 |
| 5323 | 406.116 |
| 5324 | 404.066 |
| 5325 | 405.066 |
| 5326 | 406.066 |
| 5327 | 407.066 |
| 5328 | 403.066 |
| 5329 | 401.366 |
| 5330 | 402.366 |
| 5331 | 403.346 |
| 5332 | 404.326 |
| 5333 | 405.306 |
| 5334 | 406.286 |
| 5335 | 407.266 |
| 5336 | 408.266 |
| 5337 | 405.816 |
| 5338 | 404.433 |
| 5339 | 405.429 |
| 5340 | 406.426 |
| 5341 | 407.406 |
| 5342 | 408.386 |
| 5343 | 409.366 |
| 5344 | 410.346 |
| 5345 | 411.326 |
| 5346 | 412.306 |
| 5347 | 413.286 |
| 5348 | 414.266 |
| 5349 | 415.266 |
| 5350 | 416.266 |
| 5351 | 412.666 |
| 5352 | 411.626 |
| 5353 | 412.626 |
| 5354 | 410.886 |
| 5355 | 408.236 |
| 5356 | 406.633 |
| 5357 | 407.629 |
| 5358 | 408.626 |
| 5359 | 407.446 |
| 5360 | 408.446 |
| 5361 | 405.946 |
| 5362 | 406.946 |
| 5363 | 405.218 |
| 5364 | 406.211 |
| 5365 | 407.203 |
| 5366 | 408.196 |
| 5367 | 409.196 |
| 5368 | 406.496 |
| 5369 | 404.596 |
| 5370 | 405.596 |
| 5371 | 403.296 |
| 5372 | 404.296 |
| 5373 | 405.288 |
| 5374 | 403.881 |
| 5375 | 404.873 |
| 5376 | 405.866 |
| 5377 | 406.866 |
| 5378 | 404.466 |
| 5379 | 402.566 |
| 5380 | 403.566 |
| 5381 | 404.566 |
| 5382 | 405.566 |
| 5383 | 404.386 |
| 5384 | 403.306 |
| 5385 | 402.206 |
| 5386 | 403.206 |
| 5387 | 404.206 |
| 5388 | 405.186 |
| 5389 | 406.166 |
| 5390 | 407.146 |
| 5391 | 408.126 |
| 5392 | 409.106 |
| 5393 | 410.086 |
| 5394 | 411.066 |
| 5395 | 412.046 |
| 5396 | 413.026 |
| 5397 | 414.026 |
| 5398 | 415.026 |
| 5399 | 412.226 |
| 5400 | 413.206 |
| 5401 | 414.186 |
| 5402 | 415.166 |
| 5403 | 416.146 |
| 5404 | 417.126 |
| 5405 | 418.106 |
| 5406 | 419.086 |
| 5407 | 420.083 |
| 5408 | 417.481 |
| 5409 | 418.478 |
| 5410 | 419.476 |
| 5411 | 417.748 |
| 5412 | 418.741 |
| 5413 | 419.733 |
| 5414 | 420.726 |
| 5415 | 421.726 |
| 5416 | 420.206 |
| 5417 | 418.778 |
| 5418 | 419.771 |
| 5419 | 420.763 |
| 5420 | 421.756 |
| 5421 | 420.596 |
| 5422 | 417.946 |
| 5423 | 418.946 |
| 5424 | 417.719 |
| 5425 | 418.713 |
| 5426 | 419.706 |
| 5427 | 420.686 |
| 5428 | 421.666 |
| 5429 | 422.663 |
| 5430 | 423.661 |
| 5431 | 424.658 |
| 5432 | 422.256 |
| 5433 | 423.236 |
| 5434 | 424.216 |
| 5435 | 425.196 |
| 5436 | 426.196 |
| 5437 | 427.196 |
| 5438 | 424.196 |
| 5439 | 422.933 |
| 5440 | 423.929 |
| 5441 | 424.926 |
| 5442 | 425.916 |
| 5443 | 424.766 |
| 5444 | 425.756 |
| 5445 | 426.746 |
| 5446 | 427.741 |
| 5447 | 425.586 |
| 5448 | 426.581 |
| 5449 | 427.576 |
| 5450 | 425.576 |
| 5451 | 426.576 |
| 5452 | 427.576 |
| 5453 | 428.576 |
| 5454 | 427.116 |
| 5455 | 428.096 |
| 5456 | 429.076 |
| 5457 | 430.056 |
| 5458 | 431.036 |
| 5459 | 432.016 |
| 5460 | 432.996 |
| 5461 | 433.976 |
| 5462 | 434.956 |
| 5463 | 435.936 |
| 5464 | 436.916 |
| 5465 | 435.428 |
| 5466 | 436.421 |
| 5467 | 437.413 |
| 5468 | 438.406 |
| 5469 | 437.166 |
| 5470 | 438.166 |
| 5471 | 439.166 |
| 5472 | 436.266 |
| 5473 | 437.266 |
| 5474 | 436.026 |
| 5475 | 434.566 |
| 5476 | 435.566 |
| 5477 | 436.566 |
| 5478 | 433.816 |
| 5479 | 434.816 |
| 5480 | 433.156 |
| 5481 | 431.256 |
| 5482 | 432.256 |
| 5483 | 433.256 |
| 5484 | 429.656 |
| 5485 | 430.656 |
| 5486 | 431.636 |
| 5487 | 432.616 |
| 5488 | 433.596 |
| 5489 | 434.576 |
| 5490 | 435.556 |
| 5491 | 436.536 |
| 5492 | 437.516 |
| 5493 | 435.993 |
| 5494 | 436.989 |
| 5495 | 437.986 |
| 5496 | 438.986 |
| 5497 | 439.986 |
| 5498 | 436.986 |
| 5499 | 434.036 |
| 5500 | 435.036 |
| 5501 | 436.036 |
| 5502 | 437.036 |
| 5503 | 435.633 |
| 5504 | 436.629 |
| 5505 | 437.626 |
| 5506 | 436.186 |
| 5507 | 437.186 |
| 5508 | 438.183 |
| 5509 | 436.439 |
| 5510 | 437.436 |
| 5511 | 438.436 |
| 5512 | 436.936 |
| 5513 | 437.936 |
| 5514 | 434.986 |
| 5515 | 433.106 |
| 5516 | 431.106 |
| 5517 | 432.106 |
| 5518 | 433.101 |
| 5519 | 431.096 |
| 5520 | 432.091 |
| 5521 | 433.086 |
| 5522 | 434.066 |
| 5523 | 435.046 |
| 5524 | 436.026 |
| 5525 | 437.006 |
| 5526 | 437.986 |
| 5527 | 438.986 |
| 5528 | 439.986 |
| 5529 | 437.486 |
| 5530 | 436.316 |
| 5531 | 437.306 |
| 5532 | 438.296 |
| 5533 | 439.286 |
| 5534 | 440.266 |
| 5535 | 441.246 |
| 5536 | 442.226 |
| 5537 | 443.206 |
| 5538 | 444.186 |
| 5539 | 445.166 |
| 5540 | 446.146 |
| 5541 | 444.726 |
| 5542 | 445.726 |
| 5543 | 446.726 |
| 5544 | 442.626 |
| 5545 | 441.466 |
| 5546 | 442.466 |
| 5547 | 443.466 |
| 5548 | 444.466 |
| 5549 | 442.216 |
| 5550 | 443.216 |
| 5551 | 444.216 |
| 5552 | 440.616 |
| 5553 | 441.616 |
| 5554 | 442.596 |
| 5555 | 443.576 |
| 5556 | 441.636 |
| 5557 | 442.636 |
| 5558 | 443.636 |
| 5559 | 439.436 |
| 5560 | 440.416 |
| 5561 | 441.396 |
| 5562 | 442.376 |
| 5563 | 443.356 |
| 5564 | 444.356 |
| 5565 | 445.356 |
| 5566 | 441.756 |
| 5567 | 439.956 |
| 5568 | 437.806 |
| 5569 | 438.806 |
| 5570 | 437.426 |
| 5571 | 438.426 |
| 5572 | 436.666 |
| 5573 | 437.666 |
| 5574 | 436.646 |
| 5575 | 435.046 |
| 5576 | 436.046 |
| 5577 | 437.046 |
| 5578 | 438.026 |
| 5579 | 439.006 |
| 5580 | 439.986 |
| 5581 | 440.966 |
| 5582 | 439.626 |
| 5583 | 437.076 |
| 5584 | 434.276 |
| 5585 | 435.276 |
| 5586 | 436.276 |
| 5587 | 434.916 |
| 5588 | 435.916 |
| 5589 | 431.516 |
| 5590 | 432.516 |
| 5591 | 430.066 |
| 5592 | 431.066 |
| 5593 | 432.046 |
| 5594 | 433.026 |
| 5595 | 434.006 |
| 5596 | 432.563 |
| 5597 | 433.559 |
| 5598 | 434.556 |
| 5599 | 435.551 |
| 5600 | 436.546 |
| 5601 | 434.391 |
| 5602 | 435.386 |
| 5603 | 436.386 |
| 5604 | 434.136 |
| 5605 | 435.136 |
| 5606 | 436.126 |
| 5607 | 434.896 |
| 5608 | 435.886 |
| 5609 | 436.876 |
| 5610 | 437.873 |
| 5611 | 438.871 |
| 5612 | 436.468 |
| 5613 | 437.466 |
| 5614 | 438.446 |
| 5615 | 439.426 |
| 5616 | 437.326 |
| 5617 | 438.326 |
| 5618 | 434.726 |
| 5619 | 435.726 |
| 5620 | 434.086 |
| 5621 | 435.086 |
| 5622 | 433.498 |
| 5623 | 434.491 |
| 5624 | 435.483 |
| 5625 | 436.476 |
| 5626 | 435.236 |
| 5627 | 433.596 |
| 5628 | 434.596 |
| 5629 | 435.596 |
| 5630 | 434.526 |
| 5631 | 435.516 |
| 5632 | 436.506 |
| 5633 | 437.496 |
| 5634 | 438.496 |
| 5635 | 434.596 |
| 5636 | 435.576 |
| 5637 | 436.556 |
| 5638 | 437.536 |
| 5639 | 438.536 |
| 5640 | 436.186 |
| 5641 | 437.186 |
| 5642 | 438.186 |
| 5643 | 439.186 |
| 5644 | 436.086 |
| 5645 | 437.086 |
| 5646 | 434.836 |
| 5647 | 432.386 |
| 5648 | 430.783 |
| 5649 | 431.779 |
| 5650 | 432.776 |
| 5651 | 433.771 |
| 5652 | 434.766 |
| 5653 | 432.561 |
| 5654 | 433.556 |
| 5655 | 432.396 |
| 5656 | 433.396 |
| 5657 | 434.396 |
| 5658 | 432.696 |
| 5659 | 430.446 |
| 5660 | 431.446 |
| 5661 | 430.166 |
| 5662 | 428.886 |
| 5663 | 425.786 |
| 5664 | 424.418 |
| 5665 | 425.411 |
| 5666 | 426.403 |
| 5667 | 427.396 |
| 5668 | 425.146 |
| 5669 | 426.146 |
| 5670 | 423.546 |
| 5671 | 424.546 |
| 5672 | 425.546 |
| 5673 | 423.746 |
| 5674 | 422.936 |
| 5675 | 422.401 |
| 5676 | 423.396 |
| 5677 | 424.396 |
| 5678 | 422.296 |
| 5679 | 421.616 |
| 5680 | 420.476 |
| 5681 | 420.176 |
| 5682 | 419.036 |
| 5683 | 420.036 |
| 5684 | 419.016 |
| 5685 | 419.996 |
| 5686 | 420.976 |
| 5687 | 421.956 |
| 5688 | 422.936 |
| 5689 | 423.916 |
| 5690 | 424.896 |
| 5691 | 423.856 |
| 5692 | 422.556 |
| 5693 | 423.536 |
| 5694 | 424.516 |
| 5695 | 424.336 |
| 5696 | 422.476 |
| 5697 | 423.456 |
| 5698 | 424.436 |
| 5699 | 425.436 |
| 5700 | 424.436 |
| 5701 | 425.416 |
| 5702 | 426.396 |
| 5703 | 427.396 |
| 5704 | 426.036 |
| 5705 | 427.016 |
| 5706 | 427.996 |
| 5707 | 426.936 |
| 5708 | 425.536 |
| 5709 | 425.071 |
| 5710 | 426.066 |
| 5711 | 425.186 |
| 5712 | 426.186 |
| 5713 | 427.186 |
| 5714 | 425.746 |
| 5715 | 426.726 |
| 5716 | 427.706 |
| 5717 | 428.706 |
| 5718 | 426.986 |
| 5719 | 427.986 |
| 5720 | 426.586 |
| 5721 | 427.586 |
| 5722 | 426.656 |
| 5723 | 425.516 |
| 5724 | 424.236 |
| 5725 | 425.216 |
| 5726 | 426.196 |
| 5727 | 424.516 |
| 5728 | 422.676 |
| 5729 | 422.266 |
| 5730 | 421.496 |
| 5731 | 422.496 |
| 5732 | 421.076 |
| 5733 | 420.556 |
| 5734 | 419.746 |
| 5735 | 420.746 |
| 5736 | 419.926 |
| 5737 | 419.331 |
| 5738 | 420.326 |
| 5739 | 419.536 |
| 5740 | 420.536 |
| 5741 | 419.396 |
| 5742 | 420.396 |
| 5743 | 418.796 |
| 5744 | 419.796 |
| 5745 | 420.776 |
| 5746 | 421.756 |
| 5747 | 420.996 |
| 5748 | 421.976 |
| 5749 | 422.956 |
| 5750 | 422.056 |
| 5751 | 419.856 |
| 5752 | 418.296 |
| 5753 | 416.146 |
| 5754 | 417.146 |
| 5755 | 415.466 |
| 5756 | 414.871 |
| 5757 | 415.866 |
| 5758 | 416.866 |
| 5759 | 415.806 |
| 5760 | 414.566 |
| 5761 | 413.106 |
| 5762 | 414.106 |
| 5763 | 412.926 |
| 5764 | 411.606 |
| 5765 | 412.606 |
| 5766 | 410.906 |
| 5767 | 409.046 |
| 5768 | 410.041 |
| 5769 | 409.306 |
| 5770 | 407.866 |
| 5771 | 408.866 |
| 5772 | 409.866 |
| 5773 | 408.446 |
| 5774 | 409.426 |
| 5775 | 410.406 |
| 5776 | 409.746 |
| 5777 | 408.006 |
| 5778 | 407.456 |
| 5779 | 408.446 |
| 5780 | 409.436 |
| 5781 | 408.639 |
| 5782 | 409.633 |
| 5783 | 410.626 |
| 5784 | 411.623 |
| 5785 | 410.019 |
| 5786 | 411.016 |
| 5787 | 410.506 |
| 5788 | 411.496 |
| 5789 | 412.486 |
| 5790 | 411.419 |
| 5791 | 412.413 |
| 5792 | 413.406 |
| 5793 | 412.656 |
| 5794 | 413.646 |
| 5795 | 414.636 |
| 5796 | 415.629 |
| 5797 | 414.673 |
| 5798 | 415.666 |
| 5799 | 415.356 |
| 5800 | 414.196 |
| 5801 | 415.196 |
| 5802 | 416.193 |
| 5803 | 414.589 |
| 5804 | 415.586 |
| 5805 | 416.583 |
| 5806 | 417.579 |
| 5807 | 416.116 |
| 5808 | 415.536 |
| 5809 | 416.536 |
| 5810 | 414.896 |
| 5811 | 414.773 |
| 5812 | 415.759 |
| 5813 | 416.746 |
| 5814 | 416.036 |
| 5815 | 417.026 |
| 5816 | 418.016 |
| 5817 | 419.016 |
| 5818 | 417.996 |
| 5819 | 416.956 |
| 5820 | 417.956 |
| 5821 | 417.196 |
| 5822 | 415.596 |
| 5823 | 415.066 |
| 5824 | 413.386 |
| 5825 | 414.386 |
| 5826 | 414.056 |
| 5827 | 412.836 |
| 5828 | 413.836 |
| 5829 | 412.856 |
| 5830 | 411.316 |
| 5831 | 412.316 |
| 5832 | 412.046 |
| 5833 | 411.386 |
| 5834 | 412.386 |
| 5835 | 411.776 |
| 5836 | 412.766 |
| 5837 | 413.756 |
| 5838 | 413.526 |
| 5839 | 412.886 |
| 5840 | 412.076 |
| 5841 | 411.806 |
| 5842 | 412.806 |
| 5843 | 411.646 |
| 5844 | 411.406 |
| 5845 | 411.166 |
| 5846 | 410.886 |
| 5847 | 411.883 |
| 5848 | 412.879 |
| 5849 | 411.436 |
| 5850 | 412.436 |
| 5851 | 411.296 |
| 5852 | 410.076 |
| 5853 | 409.436 |
| 5854 | 410.436 |
| 5855 | 409.016 |
| 5856 | 408.326 |
| 5857 | 409.326 |
| 5858 | 408.246 |
| 5859 | 408.096 |
| 5860 | 406.856 |
| 5861 | 407.856 |
| 5862 | 408.856 |
| 5863 | 409.856 |
| 5864 | 407.356 |
| 5865 | 407.153 |
| 5866 | 408.139 |
| 5867 | 409.126 |
| 5868 | 408.319 |
| 5869 | 409.313 |
| 5870 | 410.306 |
| 5871 | 409.886 |
| 5872 | 409.416 |
| 5873 | 408.896 |
| 5874 | 407.836 |
| 5875 | 406.396 |
| 5876 | 407.396 |
| 5877 | 406.596 |
| 5878 | 405.646 |
| 5879 | 406.646 |
| 5880 | 407.639 |
| 5881 | 408.633 |
| 5882 | 407.406 |
| 5883 | 408.406 |
| 5884 | 407.366 |
| 5885 | 406.266 |
| 5886 | 405.356 |
| 5887 | 404.396 |
| 5888 | 403.156 |
| 5889 | 404.153 |
| 5890 | 402.829 |
| 5891 | 403.826 |
| 5892 | 404.806 |
| 5893 | 405.786 |
| 5894 | 406.766 |
| 5895 | 407.746 |
| 5896 | 408.726 |
| 5897 | 409.706 |
| 5898 | 410.699 |
| 5899 | 409.763 |
| 5900 | 410.756 |
| 5901 | 410.066 |
| 5902 | 408.766 |
| 5903 | 409.766 |
| 5904 | 409.606 |
| 5905 | 410.606 |
| 5906 | 409.126 |
| 5907 | 408.236 |
| 5908 | 409.236 |
| 5909 | 407.976 |
| 5910 | 407.286 |
| 5911 | 408.276 |
| 5912 | 409.266 |
| 5913 | 410.266 |
| 5914 | 408.706 |
| 5915 | 406.706 |
| 5916 | 405.506 |
| 5917 | 404.026 |
| 5918 | 405.026 |
| 5919 | 404.816 |
| 5920 | 403.736 |
| 5921 | 404.736 |
| 5922 | 404.446 |
| 5923 | 403.826 |
| 5924 | 404.826 |
| 5925 | 405.826 |
| 5926 | 404.106 |
| 5927 | 402.006 |
| 5928 | 400.999 |
| 5929 | 401.993 |
| 5930 | 402.986 |
| 5931 | 402.723 |
| 5932 | 403.709 |
| 5933 | 404.696 |
| 5934 | 405.693 |
| 5935 | 406.689 |
| 5936 | 405.226 |
| 5937 | 406.223 |
| 5938 | 407.219 |
| 5939 | 405.836 |
| 5940 | 405.076 |
| 5941 | 404.266 |
| 5942 | 405.266 |
| 5943 | 403.783 |
| 5944 | 404.779 |
| 5945 | 405.776 |
| 5946 | 404.316 |
| 5947 | 405.316 |
| 5948 | 403.936 |
| 5949 | 402.653 |
| 5950 | 403.649 |
| 5951 | 404.646 |
| 5952 | 403.466 |
| 5953 | 404.466 |
| 5954 | 403.046 |
| 5955 | 404.046 |
| 5956 | 402.586 |
| 5957 | 401.486 |
| 5958 | 402.486 |
| 5959 | 403.466 |
| 5960 | 404.446 |
| 5961 | 405.426 |
| 5962 | 404.206 |
| 5963 | 402.386 |
| 5964 | 403.386 |
| 5965 | 404.386 |
| 5966 | 405.386 |
| 5967 | 400.986 |
| 5968 | 401.966 |
| 5969 | 402.946 |
| 5970 | 401.906 |
| 5971 | 402.906 |
| 5972 | 401.046 |
| 5973 | 402.046 |
| 5974 | 403.026 |
| 5975 | 404.006 |
| 5976 | 403.016 |
| 5977 | 404.006 |
| 5978 | 404.996 |
| 5979 | 405.986 |
| 5980 | 406.983 |
| 5981 | 405.399 |
| 5982 | 406.396 |
| 5983 | 405.033 |
| 5984 | 406.029 |
| 5985 | 407.026 |
| 5986 | 408.023 |
| 5987 | 409.019 |
| 5988 | 407.436 |
| 5989 | 408.431 |
| 5990 | 406.276 |
| 5991 | 407.271 |
| 5992 | 408.266 |
| 5993 | 404.666 |
| 5994 | 405.666 |
| 5995 | 406.666 |
| 5996 | 407.666 |
| 5997 | 405.366 |
| 5998 | 402.166 |
| 5999 | 400.906 |
| 6000 | 401.906 |
| 6001 | 400.486 |
| 6002 | 398.966 |
| 6003 | 396.816 |
| 6004 | 397.816 |
| 6005 | 398.816 |
| 6006 | 397.196 |
| 6007 | 395.476 |
| 6008 | 396.476 |
| 6009 | 397.476 |
| 6010 | 398.456 |
| 6011 | 399.436 |
| 6012 | 400.416 |
| 6013 | 401.416 |
| 6014 | 399.016 |
| 6015 | 400.016 |
| 6016 | 401.013 |
| 6017 | 402.011 |
| 6018 | 399.608 |
| 6019 | 400.606 |
| 6020 | 398.646 |
| 6021 | 395.796 |
| 6022 | 396.783 |
| 6023 | 397.769 |
| 6024 | 398.749 |
| 6025 | 399.729 |
| 6026 | 400.724 |
| 6027 | 398.619 |
| 6028 | 399.614 |
| 6029 | 400.609 |
| 6030 | 401.609 |
| 6031 | 398.409 |
| 6032 | 399.409 |
| 6033 | 400.409 |
| 6034 | 401.409 |
| 6035 | 399.359 |
| 6036 | 398.079 |
| 6037 | 399.079 |
| 6038 | 400.079 |
| 6039 | 396.179 |
| 6040 | 395.059 |
| 6041 | 396.059 |
| 6042 | 397.059 |
| 6043 | 393.959 |
| 6044 | 393.059 |
| 6045 | 394.049 |
| 6046 | 395.039 |
| 6047 | 396.029 |
| 6048 | 397.009 |
| 6049 | 397.989 |
| 6050 | 398.969 |
| 6051 | 399.949 |
| 6052 | 398.229 |
| 6053 | 399.229 |
| 6054 | 400.229 |
| 6055 | 398.489 |
| 6056 | 396.729 |
| 6057 | 397.729 |
| 6058 | 396.209 |
| 6059 | 394.549 |
| 6060 | 395.549 |
| 6061 | 394.429 |
| 6062 | 393.289 |
| 6063 | 394.289 |
| 6064 | 393.059 |
| 6065 | 394.049 |
| 6066 | 395.039 |
| 6067 | 396.029 |
| 6068 | 394.406 |
| 6069 | 395.403 |
| 6070 | 396.399 |
| 6071 | 395.199 |
| 6072 | 393.379 |
| 6073 | 394.379 |
| 6074 | 395.379 |
| 6075 | 396.359 |
| 6076 | 397.339 |
| 6077 | 398.334 |
| 6078 | 399.329 |
| 6079 | 397.224 |
| 6080 | 398.219 |
| 6081 | 399.199 |
| 6082 | 400.179 |
| 6083 | 401.159 |
| 6084 | 402.139 |
| 6085 | 403.132 |
| 6086 | 401.744 |
| 6087 | 402.737 |
| 6088 | 403.729 |
| 6089 | 402.739 |
| 6090 | 401.439 |
| 6091 | 402.439 |
| 6092 | 403.419 |
| 6093 | 404.399 |
| 6094 | 405.399 |
| 6095 | 403.099 |
| 6096 | 404.099 |
| 6097 | 401.099 |
| 6098 | 400.099 |
| 6099 | 401.089 |
| 6100 | 402.079 |
| 6101 | 403.069 |
| 6102 | 404.069 |
| 6103 | 401.069 |
| 6104 | 402.069 |
| 6105 | 400.809 |
| 6106 | 401.809 |
| 6107 | 402.809 |
| 6108 | 401.069 |
| 6109 | 398.119 |
| 6110 | 399.119 |
| 6111 | 400.119 |
| 6112 | 401.119 |
| 6113 | 397.819 |
| 6114 | 395.999 |
| 6115 | 396.999 |
| 6116 | 395.839 |
| 6117 | 396.839 |
| 6118 | 397.819 |
| 6119 | 398.799 |
| 6120 | 399.779 |
| 6121 | 397.574 |
| 6122 | 398.569 |
| 6123 | 399.564 |
| 6124 | 400.559 |
| 6125 | 401.559 |
| 6126 | 402.559 |
| 6127 | 403.559 |
| 6128 | 399.859 |
| 6129 | 398.379 |
| 6130 | 399.379 |
| 6131 | 396.479 |
| 6132 | 397.479 |
| 6133 | 393.979 |
| 6134 | 394.979 |
| 6135 | 393.499 |
| 6136 | 390.799 |
| 6137 | 391.799 |
| 6138 | 392.779 |
| 6139 | 393.759 |
| 6140 | 394.739 |
| 6141 | 395.719 |
| 6142 | 396.719 |
| 6143 | 394.169 |
| 6144 | 395.162 |
| 6145 | 393.414 |
| 6146 | 394.407 |
| 6147 | 395.399 |
| 6148 | 396.399 |
| 6149 | 393.399 |
| 6150 | 394.399 |
| 6151 | 395.394 |
| 6152 | 396.389 |
| 6153 | 397.384 |
| 6154 | 395.179 |
| 6155 | 393.699 |
| 6156 | 391.549 |
| 6157 | 389.399 |
| 6158 | 390.399 |
| 6159 | 391.399 |
| 6160 | 392.399 |
| 6161 | 393.399 |
| 6162 | 389.899 |
| 6163 | 387.299 |
| 6164 | 388.299 |
| 6165 | 389.299 |
| 6166 | 390.299 |
| 6167 | 387.849 |
| 6168 | 388.849 |
| 6169 | 389.829 |
| 6170 | 390.809 |
| 6171 | 391.789 |
| 6172 | 392.769 |
| 6173 | 393.749 |
| 6174 | 394.729 |
| 6175 | 391.129 |
| 6176 | 392.129 |
| 6177 | 393.129 |
| 6178 | 391.229 |
| 6179 | 389.929 |
| 6180 | 390.929 |
| 6181 | 391.909 |
| 6182 | 392.889 |
| 6183 | 393.869 |
| 6184 | 392.929 |
| 6185 | 393.929 |
| 6186 | 394.909 |
| 6187 | 395.889 |
| 6188 | 396.889 |
| 6189 | 395.029 |
| 6190 | 396.029 |
| 6191 | 394.589 |
| 6192 | 395.589 |
| 6193 | 396.589 |
| 6194 | 393.389 |
| 6195 | 394.389 |
| 6196 | 391.189 |
| 6197 | 392.186 |
| 6198 | 390.723 |
| 6199 | 391.719 |
| 6200 | 392.719 |
| 6201 | 393.719 |
| 6202 | 391.069 |
| 6203 | 389.806 |
| 6204 | 390.803 |
| 6205 | 391.799 |
| 6206 | 389.099 |
| 6207 | 390.099 |
| 6208 | 391.099 |
| 6209 | 389.519 |
| 6210 | 387.069 |
| 6211 | 388.069 |
| 6212 | 389.049 |
| 6213 | 390.029 |
| 6214 | 391.026 |
| 6215 | 389.303 |
| 6216 | 390.299 |
| 6217 | 391.279 |
| 6218 | 392.259 |
| 6219 | 391.059 |
| 6220 | 392.059 |
| 6221 | 390.396 |
| 6222 | 391.393 |
| 6223 | 392.389 |
| 6224 | 391.829 |
| 6225 | 391.259 |
| 6226 | 388.709 |
| 6227 | 389.709 |
| 6228 | 390.709 |
| 6229 | 389.709 |
| 6230 | 390.709 |
| 6231 | 391.689 |
| 6232 | 392.669 |
| 6233 | 393.649 |
| 6234 | 394.629 |
| 6235 | 395.609 |
| 6236 | 396.589 |
| 6237 | 397.569 |
| 6238 | 396.449 |
| 6239 | 397.449 |
| 6240 | 393.949 |
| 6241 | 392.262 |
| 6242 | 393.254 |
| 6243 | 394.247 |
| 6244 | 395.239 |
| 6245 | 393.839 |
| 6246 | 394.839 |
| 6247 | 395.819 |
| 6248 | 396.799 |
| 6249 | 397.779 |
| 6250 | 396.789 |
| 6251 | 397.789 |
| 6252 | 395.439 |
| 6253 | 396.439 |
| 6254 | 397.439 |
| 6255 | 395.679 |
| 6256 | 393.229 |
| 6257 | 394.229 |
| 6258 | 395.209 |
| 6259 | 396.189 |
| 6260 | 397.169 |
| 6261 | 398.166 |
| 6262 | 396.643 |
| 6263 | 397.639 |
| 6264 | 398.619 |
| 6265 | 399.599 |
| 6266 | 398.199 |
| 6267 | 396.459 |
| 6268 | 397.459 |
| 6269 | 395.359 |
| 6270 | 396.359 |
| 6271 | 397.339 |
| 6272 | 398.319 |
| 6273 | 399.299 |
| 6274 | 398.279 |
| 6275 | 396.959 |
| 6276 | 397.959 |
| 6277 | 398.959 |
| 6278 | 396.609 |
| 6279 | 397.609 |
| 6280 | 398.609 |
| 6281 | 393.809 |
| 6282 | 394.809 |
| 6283 | 392.559 |
| 6284 | 393.559 |
| 6285 | 391.579 |
| 6286 | 392.579 |
| 6287 | 393.579 |
| 6288 | 390.579 |
| 6289 | 391.576 |
| 6290 | 389.993 |
| 6291 | 390.989 |
| 6292 | 391.969 |
| 6293 | 392.949 |
| 6294 | 391.979 |
| 6295 | 392.979 |
| 6296 | 393.959 |
| 6297 | 394.939 |
| 6298 | 395.919 |
| 6299 | 396.899 |
| 6300 | 397.899 |
| 6301 | 394.499 |
| 6302 | 392.449 |
| 6303 | 393.449 |
| 6304 | 392.613 |
| 6305 | 393.606 |
| 6306 | 394.599 |
| 6307 | 393.259 |
| 6308 | 394.259 |
| 6309 | 395.239 |
| 6310 | 396.219 |
| 6311 | 397.199 |
| 6312 | 398.179 |
| 6313 | 397.119 |
| 6314 | 398.119 |
| 6315 | 393.719 |
| 6316 | 394.699 |
| 6317 | 395.679 |
| 6318 | 396.679 |
| 6319 | 392.379 |
| 6320 | 390.899 |
| 6321 | 391.899 |
| 6322 | 391.049 |
| 6323 | 392.049 |
| 6324 | 393.049 |
| 6325 | 394.049 |
| 6326 | 395.049 |
| 6327 | 391.649 |
| 6328 | 392.629 |
| 6329 | 393.609 |
| 6330 | 394.589 |
| 6331 | 392.862 |
| 6332 | 393.854 |
| 6333 | 394.847 |
| 6334 | 395.839 |
| 6335 | 396.839 |
| 6336 | 393.739 |
| 6337 | 394.739 |
| 6338 | 395.719 |
| 6339 | 396.699 |
| 6340 | 397.679 |
| 6341 | 398.659 |
| 6342 | 399.639 |
| 6343 | 398.239 |
| 6344 | 396.499 |
| 6345 | 397.499 |
| 6346 | 394.849 |
| 6347 | 391.349 |
| 6348 | 392.349 |
| 6349 | 390.829 |
| 6350 | 391.829 |
| 6351 | 392.829 |
| 6352 | 388.929 |
| 6353 | 389.929 |
| 6354 | 390.929 |
| 6355 | 388.129 |
| 6356 | 389.109 |
| 6357 | 390.089 |
| 6358 | 388.346 |
| 6359 | 389.343 |
| 6360 | 390.339 |
| 6361 | 388.779 |
| 6362 | 389.779 |
| 6363 | 388.236 |
| 6364 | 389.233 |
| 6365 | 390.229 |
| 6366 | 391.214 |
| 6367 | 392.199 |
| 6368 | 393.184 |
| 6369 | 394.164 |
| 6370 | 395.144 |
| 6371 | 396.124 |
| 6372 | 397.104 |
| 6373 | 398.084 |
| 6374 | 399.084 |
| 6375 | 400.084 |
| 6376 | 396.384 |
| 6377 | 397.364 |
| 6378 | 398.344 |
| 6379 | 399.324 |
| 6380 | 398.614 |
| 6381 | 399.614 |
| 6382 | 398.054 |
| 6383 | 399.054 |
| 6384 | 400.034 |
| 6385 | 401.014 |
| 6386 | 401.994 |
| 6387 | 402.994 |
| 6388 | 400.394 |
| 6389 | 401.374 |
| 6390 | 402.354 |
| 6391 | 401.474 |
| 6392 | 402.474 |
| 6393 | 403.454 |
| 6394 | 404.434 |
| 6395 | 405.414 |
| 6396 | 406.394 |
| 6397 | 405.874 |
| 6398 | 406.864 |
| 6399 | 407.854 |
| 6400 | 407.092 |
| 6401 | 408.079 |
| 6402 | 409.067 |
| 6403 | 410.054 |
| 6404 | 408.374 |
| 6405 | 409.374 |
| 6406 | 407.627 |
| 6407 | 408.619 |
| 6408 | 409.612 |
| 6409 | 410.604 |
| 6410 | 408.499 |
| 6411 | 409.494 |
| 6412 | 410.489 |
| 6413 | 411.484 |
| 6414 | 412.464 |
| 6415 | 413.444 |
| 6416 | 412.117 |
| 6417 | 413.109 |
| 6418 | 414.102 |
| 6419 | 415.094 |
| 6420 | 416.074 |
| 6421 | 417.054 |
| 6422 | 418.034 |
| 6423 | 419.014 |
| 6424 | 419.994 |
| 6425 | 418.814 |
| 6426 | 417.574 |
| 6427 | 418.564 |
| 6428 | 419.559 |
| 6429 | 417.504 |
| 6430 | 418.499 |
| 6431 | 419.494 |
| 6432 | 420.494 |
| 6433 | 418.494 |
| 6434 | 417.174 |
| 6435 | 418.174 |
| 6436 | 416.314 |
| 6437 | 417.314 |
| 6438 | 415.851 |
| 6439 | 416.848 |
| 6440 | 417.844 |
| 6441 | 416.644 |
| 6442 | 417.644 |
| 6443 | 416.464 |
| 6444 | 417.464 |
| 6445 | 415.584 |
| 6446 | 416.584 |
| 6447 | 415.524 |
| 6448 | 416.524 |
| 6449 | 415.021 |
| 6450 | 416.018 |
| 6451 | 417.014 |
| 6452 | 415.331 |
| 6453 | 416.328 |
| 6454 | 417.324 |
| 6455 | 418.304 |
| 6456 | 419.284 |
| 6457 | 420.264 |
| 6458 | 418.444 |
| 6459 | 419.424 |
| 6460 | 420.404 |
| 6461 | 421.404 |
| 6462 | 419.404 |
| 6463 | 420.404 |
| 6464 | 421.397 |
| 6465 | 422.389 |
| 6466 | 420.982 |
| 6467 | 421.974 |
| 6468 | 419.724 |
| 6469 | 420.724 |
| 6470 | 421.724 |
| 6471 | 419.324 |
| 6472 | 420.324 |
| 6473 | 421.324 |
| 6474 | 422.304 |
| 6475 | 423.284 |
| 6476 | 424.264 |
| 6477 | 425.244 |
| 6478 | 421.544 |
| 6479 | 422.544 |
| 6480 | 423.544 |
| 6481 | 424.544 |
| 6482 | 419.544 |
| 6483 | 420.544 |
| 6484 | 421.544 |
| 6485 | 417.244 |
| 6486 | 415.644 |
| 6487 | 411.044 |
| 6488 | 412.031 |
| 6489 | 413.018 |
| 6490 | 411.978 |
| 6491 | 412.978 |
| 6492 | 413.958 |
| 6493 | 414.938 |
| 6494 | 412.738 |
| 6495 | 413.738 |
| 6496 | 409.438 |
| 6497 | 410.418 |
| 6498 | 411.398 |
| 6499 | 412.378 |
| 6500 | 413.358 |
| 6501 | 414.338 |
| 6502 | 415.318 |
| 6503 | 414.298 |
| 6504 | 415.298 |
| 6505 | 414.428 |
| 6506 | 415.428 |
| 6507 | 414.048 |
| 6508 | 415.048 |
| 6509 | 413.948 |
| 6510 | 411.898 |
| 6511 | 412.878 |
| 6512 | 413.858 |
| 6513 | 414.858 |
| 6514 | 411.158 |
| 6515 | 412.158 |
| 6516 | 413.158 |
| 6517 | 408.158 |
| 6518 | 406.878 |
| 6519 | 407.878 |
| 6520 | 406.558 |
| 6521 | 405.238 |
| 6522 | 406.238 |
| 6523 | 407.218 |
| 6524 | 408.198 |
| 6525 | 409.198 |
| 6526 | 405.898 |
| 6527 | 406.898 |
| 6528 | 407.898 |
| 6529 | 408.898 |
| 6530 | 405.398 |
| 6531 | 406.398 |
| 6532 | 407.395 |
| 6533 | 404.793 |
| 6534 | 405.79 |
| 6535 | 406.788 |
| 6536 | 405.248 |
| 6537 | 406.248 |
| 6538 | 407.228 |
| 6539 | 408.208 |
| 6540 | 409.208 |
| 6541 | 405.808 |
| 6542 | 406.808 |
| 6543 | 407.808 |
| 6544 | 406.14 |
| 6545 | 407.133 |
| 6546 | 408.125 |
| 6547 | 409.118 |
| 6548 | 410.118 |
| 6549 | 408.118 |
| 6550 | 409.118 |
| 6551 | 410.118 |
| 6552 | 407.018 |
| 6553 | 405.978 |
| 6554 | 406.978 |
| 6555 | 405.618 |
| 6556 | 406.618 |
| 6557 | 404.638 |
| 6558 | 405.638 |
| 6559 | 402.688 |
| 6560 | 403.688 |
| 6561 | 402.428 |
| 6562 | 403.428 |
| 6563 | 402.853 |
| 6564 | 403.848 |
| 6565 | 403.028 |
| 6566 | 404.028 |
| 6567 | 402.648 |
| 6568 | 403.648 |
| 6569 | 401.723 |
| 6570 | 402.718 |
| 6571 | 403.713 |
| 6572 | 404.708 |
| 6573 | 405.688 |
| 6574 | 406.668 |
| 6575 | 407.648 |
| 6576 | 408.648 |
| 6577 | 406.098 |
| 6578 | 407.098 |
| 6579 | 405.048 |
| 6580 | 406.048 |
| 6581 | 404.444 |
| 6582 | 405.441 |
| 6583 | 406.438 |
| 6584 | 405.278 |
| 6585 | 406.278 |
| 6586 | 404.278 |
| 6587 | 405.278 |
| 6588 | 406.258 |
| 6589 | 407.238 |
| 6590 | 408.218 |
| 6591 | 406.678 |
| 6592 | 407.678 |
| 6593 | 408.678 |
| 6594 | 406.818 |
| 6595 | 407.818 |
| 6596 | 408.818 |
| 6597 | 409.818 |
| 6598 | 404.818 |
| 6599 | 405.814 |
| 6600 | 404.271 |
| 6601 | 405.268 |
| 6602 | 404.481 |
| 6603 | 405.474 |
| 6604 | 406.468 |
| 6605 | 407.448 |
| 6606 | 408.428 |
| 6607 | 409.408 |
| 6608 | 410.408 |
| 6609 | 407.958 |
| 6610 | 405.758 |
| 6611 | 406.758 |
| 6612 | 407.758 |
| 6613 | 403.258 |
| 6614 | 404.258 |
| 6615 | 405.258 |
| 6616 | 406.253 |
| 6617 | 407.248 |
| 6618 | 404.993 |
| 6619 | 405.988 |
| 6620 | 406.988 |
| 6621 | 407.988 |
| 6622 | 405.288 |
| 6623 | 404.298 |
| 6624 | 405.298 |
| 6625 | 406.278 |
| 6626 | 407.258 |
| 6627 | 408.238 |
| 6628 | 409.234 |
| 6629 | 407.791 |
| 6630 | 408.788 |
| 6631 | 409.768 |
| 6632 | 410.748 |
| 6633 | 411.728 |
| 6634 | 412.708 |
| 6635 | 411.264 |
| 6636 | 412.261 |
| 6637 | 413.258 |
| 6638 | 414.238 |
| 6639 | 415.218 |
| 6640 | 413.478 |
| 6641 | 414.478 |
| 6642 | 411.478 |
| 6643 | 412.458 |
| 6644 | 413.438 |
| 6645 | 414.438 |
| 6646 | 412.758 |
| 6647 | 413.738 |
| 6648 | 414.718 |
| 6649 | 415.698 |
| 6650 | 414.538 |
| 6651 | 415.538 |
| 6652 | 416.538 |
| 6653 | 417.538 |
| 6654 | 413.038 |
| 6655 | 414.018 |
| 6656 | 414.998 |
| 6657 | 415.978 |
| 6658 | 416.958 |
| 6659 | 417.938 |
| 6660 | 418.918 |
| 6661 | 418.078 |
| 6662 | 419.078 |
| 6663 | 417.738 |
| 6664 | 415.238 |
| 6665 | 416.238 |
| 6666 | 414.378 |
| 6667 | 412.328 |
| 6668 | 413.328 |
| 6669 | 411.278 |
| 6670 | 409.128 |
| 6671 | 410.128 |
| 6672 | 411.128 |
| 6673 | 412.128 |
| 6674 | 407.328 |
| 6675 | 405.864 |
| 6676 | 406.861 |
| 6677 | 407.858 |
| 6678 | 407.238 |
| 6679 | 408.238 |
| 6680 | 406.518 |
| 6681 | 407.518 |
| 6682 | 405.998 |
| 6683 | 406.978 |
| 6684 | 407.958 |
| 6685 | 408.951 |
| 6686 | 407.974 |
| 6687 | 408.968 |
| 6688 | 409.968 |
| 6689 | 406.468 |
| 6690 | 407.468 |
| 6691 | 406.478 |
| 6692 | 405.278 |
| 6693 | 403.998 |
| 6694 | 404.998 |
| 6695 | 403.498 |
| 6696 | 404.498 |
| 6697 | 403.014 |
| 6698 | 404.011 |
| 6699 | 405.008 |
| 6700 | 403.768 |
| 6701 | 404.768 |
| 6702 | 400.368 |
| 6703 | 401.368 |
| 6704 | 402.368 |
| 6705 | 398.068 |
| 6706 | 399.068 |
| 6707 | 396.718 |
| 6708 | 397.718 |
| 6709 | 397.038 |
| 6710 | 398.038 |
| 6711 | 395.738 |
| 6712 | 396.738 |
| 6713 | 397.73 |
| 6714 | 398.723 |
| 6715 | 396.995 |
| 6716 | 397.988 |
| 6717 | 395.988 |
| 6718 | 396.988 |
| 6719 | 397.988 |
| 6720 | 397.038 |
| 6721 | 395.318 |
| 6722 | 392.968 |
| 6723 | 393.968 |
| 6724 | 393.383 |
| 6725 | 394.378 |
| 6726 | 395.358 |
| 6727 | 396.338 |
| 6728 | 394.838 |
| 6729 | 395.838 |
| 6730 | 394.818 |
| 6731 | 393.638 |
| 6732 | 394.638 |
| 6733 | 395.618 |
| 6734 | 396.598 |
| 6735 | 397.598 |
| 6736 | 398.598 |
| 6737 | 396.818 |
| 6738 | 395.138 |
| 6739 | 392.288 |
| 6740 | 393.288 |
| 6741 | 392.128 |
| 6742 | 393.128 |
| 6743 | 394.108 |
| 6744 | 395.088 |
| 6745 | 396.068 |
| 6746 | 397.068 |
| 6747 | 394.768 |
| 6748 | 395.768 |
| 6749 | 396.748 |
| 6750 | 397.728 |
| 6751 | 398.708 |
| 6752 | 399.688 |
| 6753 | 400.668 |
| 6754 | 401.648 |
| 6755 | 402.648 |
| 6756 | 400.498 |
| 6757 | 397.198 |
| 6758 | 398.198 |
| 6759 | 399.178 |
| 6760 | 400.158 |
| 6761 | 401.138 |
| 6762 | 399.458 |
| 6763 | 400.458 |
| 6764 | 401.438 |
| 6765 | 402.418 |
| 6766 | 403.398 |
| 6767 | 401.858 |
| 6768 | 402.858 |
| 6769 | 403.838 |
| 6770 | 404.818 |
| 6771 | 405.798 |
| 6772 | 406.778 |
| 6773 | 407.758 |
| 6774 | 408.758 |
| 6775 | 406.708 |
| 6776 | 407.708 |
| 6777 | 405.708 |
| 6778 | 406.708 |
| 6779 | 407.708 |
| 6780 | 405.158 |
| 6781 | 406.158 |
| 6782 | 407.158 |
| 6783 | 403.758 |
| 6784 | 401.458 |
| 6785 | 402.458 |
| 6786 | 400.518 |
| 6787 | 401.518 |
| 6788 | 402.518 |
| 6789 | 403.498 |
| 6790 | 404.478 |
| 6791 | 405.478 |
| 6792 | 401.678 |
| 6793 | 400.688 |
| 6794 | 396.888 |
| 6795 | 397.868 |
| 6796 | 398.848 |
| 6797 | 399.828 |
| 6798 | 398.938 |
| 6799 | 399.928 |
| 6800 | 400.918 |
| 6801 | 401.908 |
| 6802 | 402.888 |
| 6803 | 403.868 |
| 6804 | 404.848 |
| 6805 | 405.848 |
| 6806 | 406.848 |
| 6807 | 402.848 |
| 6808 | 401.708 |
| 6809 | 399.408 |
| 6810 | 400.408 |
| 6811 | 401.408 |
| 6812 | 402.408 |
| 6813 | 400.358 |
| 6814 | 401.338 |
| 6815 | 402.318 |
| 6816 | 398.918 |
| 6817 | 399.918 |
| 6818 | 400.918 |
| 6819 | 398.718 |
| 6820 | 399.714 |
| 6821 | 398.091 |
| 6822 | 399.088 |
| 6823 | 397.388 |
| 6824 | 395.588 |
| 6825 | 396.588 |
| 6826 | 397.588 |
| 6827 | 398.588 |
| 6828 | 395.088 |
| 6829 | 393.74 |
| 6830 | 394.733 |
| 6831 | 395.725 |
| 6832 | 396.718 |
| 6833 | 394.568 |
| 6834 | 395.568 |
| 6835 | 396.568 |
| 6836 | 394.268 |
| 6837 | 391.268 |
| 6838 | 392.268 |
| 6839 | 390.688 |
| 6840 | 388.688 |
| 6841 | 389.688 |
| 6842 | 390.688 |
| 6843 | 389.228 |
| 6844 | 390.228 |
| 6845 | 387.428 |
| 6846 | 388.428 |
| 6847 | 384.128 |
| 6848 | 385.128 |
| 6849 | 384.178 |
| 6850 | 381.778 |
| 6851 | 382.758 |
| 6852 | 383.738 |
| 6853 | 384.718 |
| 6854 | 382.838 |
| 6855 | 383.838 |
| 6856 | 384.838 |
| 6857 | 385.818 |
| 6858 | 386.798 |
| 6859 | 384.198 |
| 6860 | 385.198 |
| 6861 | 386.198 |
| 6862 | 387.198 |
| 6863 | 385.298 |
| 6864 | 386.298 |
| 6865 | 383.948 |
| 6866 | 384.948 |
| 6867 | 385.928 |
| 6868 | 386.908 |
| 6869 | 385.168 |
| 6870 | 382.618 |
| 6871 | 383.618 |
| 6872 | 384.598 |
| 6873 | 385.578 |
| 6874 | 386.558 |
| 6875 | 387.558 |
| 6876 | 388.558 |
| 6877 | 385.808 |
| 6878 | 383.653 |
| 6879 | 384.648 |
| 6880 | 385.643 |
| 6881 | 386.638 |
| 6882 | 387.638 |
| 6883 | 388.638 |
| 6884 | 385.238 |
| 6885 | 386.233 |
| 6886 | 384.028 |
| 6887 | 385.023 |
| 6888 | 386.018 |
| 6889 | 386.998 |
| 6890 | 387.978 |
| 6891 | 388.958 |
| 6892 | 386.408 |
| 6893 | 387.408 |
| 6894 | 384.208 |
| 6895 | 382.568 |
| 6896 | 383.568 |
| 6897 | 384.568 |
| 6898 | 380.868 |
| 6899 | 381.865 |
| 6900 | 382.863 |
| 6901 | 380.16 |
| 6902 | 381.158 |
| 6903 | 382.138 |
| 6904 | 383.118 |
| 6905 | 384.098 |
| 6906 | 382.558 |
| 6907 | 380.718 |
| 6908 | 381.718 |
| 6909 | 382.718 |
| 6910 | 383.698 |
| 6911 | 384.678 |
| 6912 | 385.658 |
| 6913 | 386.658 |
| 6914 | 387.658 |
| 6915 | 384.658 |
| 6916 | 385.658 |
| 6917 | 383.778 |
| 6918 | 381.228 |
| 6919 | 382.228 |
| 6920 | 383.228 |
| 6921 | 384.228 |
| 6922 | 379.928 |
| 6923 | 380.928 |
| 6924 | 381.925 |
| 6925 | 379.623 |
| 6926 | 380.62 |
| 6927 | 381.618 |
| 6928 | 382.598 |
| 6929 | 383.578 |
| 6930 | 384.558 |
| 6931 | 385.558 |
| 6932 | 382.558 |
| 6933 | 383.558 |
| 6934 | 384.538 |
| 6935 | 385.518 |
| 6936 | 386.498 |
| 6937 | 387.498 |
| 6938 | 388.498 |
| 6939 | 384.598 |
| 6940 | 385.598 |
| 6941 | 382.398 |
| 6942 | 383.398 |
| 6943 | 384.378 |
| 6944 | 385.358 |
| 6945 | 386.338 |
| 6946 | 387.338 |
| 6947 | 388.338 |
| 6948 | 384.338 |
| 6949 | 385.338 |
| 6950 | 382.738 |
| 6951 | 383.738 |
| 6952 | 384.738 |
| 6953 | 385.738 |
| 6954 | 386.738 |
| 6955 | 382.338 |
| 6956 | 383.338 |
| 6957 | 379.938 |
| 6958 | 380.938 |
| 6959 | 381.918 |
| 6960 | 382.898 |
| 6961 | 383.878 |
| 6962 | 384.858 |
| 6963 | 385.858 |
| 6964 | 386.858 |
| 6965 | 387.858 |
| 6966 | 384.058 |
| 6967 | 381.953 |
| 6968 | 382.948 |
| 6969 | 383.943 |
| 6970 | 384.938 |
| 6971 | 385.938 |
| 6972 | 383.638 |
| 6973 | 384.638 |
| 6974 | 385.638 |
| 6975 | 382.838 |
| 6976 | 383.838 |
| 6977 | 384.818 |
| 6978 | 385.798 |
| 6979 | 386.778 |
| 6980 | 387.758 |
| 6981 | 388.758 |
| 6982 | 389.758 |
| 6983 | 386.258 |
| 6984 | 387.238 |
| 6985 | 388.218 |
| 6986 | 389.198 |
| 6987 | 390.198 |
| 6988 | 386.998 |
| 6989 | 387.998 |
| 6990 | 388.998 |
| 6991 | 389.978 |
| 6992 | 390.958 |
| 6993 | 391.938 |
| 6994 | 392.918 |
| 6995 | 393.898 |
| 6996 | 394.878 |
| 6997 | 395.858 |
| 6998 | 396.858 |
| 6999 | 397.858 |
| 7000 | 394.758 |
| 7001 | 395.758 |
| 7002 | 396.758 |
| 7003 | 393.558 |
| 7004 | 394.558 |
| 7005 | 395.558 |
| 7006 | 393.108 |
| 7007 | 390.008 |
| 7008 | 391.008 |
| 7009 | 389.568 |
| 7010 | 387.168 |
| 7011 | 388.168 |
| 7012 | 386.664 |
| 7013 | 387.661 |
| 7014 | 388.658 |
| 7015 | 389.638 |
| 7016 | 390.618 |
| 7017 | 391.598 |
| 7018 | 389.493 |
| 7019 | 390.488 |
| 7020 | 391.483 |
| 7021 | 392.478 |
| 7022 | 393.458 |
| 7023 | 394.438 |
| 7024 | 395.418 |
| 7025 | 396.418 |
| 7026 | 393.318 |
| 7027 | 394.318 |
| 7028 | 391.618 |
| 7029 | 392.618 |
| 7030 | 393.618 |
| 7031 | 394.598 |
| 7032 | 395.578 |
| 7033 | 396.558 |
| 7034 | 397.538 |
| 7035 | 398.518 |
| 7036 | 399.498 |
| 7037 | 400.478 |
| 7038 | 398.778 |
| 7039 | 396.938 |
| 7040 | 397.918 |
| 7041 | 398.898 |
| 7042 | 399.878 |
| 7043 | 400.858 |
| 7044 | 401.838 |
| 7045 | 402.818 |
| 7046 | 403.798 |
| 7047 | 404.778 |
| 7048 | 405.758 |
| 7049 | 406.738 |
| 7050 | 407.718 |
| 7051 | 408.698 |
| 7052 | 409.678 |
| 7053 | 410.658 |
| 7054 | 411.638 |
| 7055 | 412.638 |
| 7056 | 409.938 |
| 7057 | 405.838 |
| 7058 | 406.818 |
| 7059 | 407.798 |
| 7060 | 408.778 |
| 7061 | 409.758 |
| 7062 | 410.738 |
| 7063 | 411.718 |
| 7064 | 409.618 |
| 7065 | 410.618 |
| 7066 | 411.618 |
| 7067 | 412.618 |
| 7068 | 409.418 |
| 7069 | 410.418 |
| 7070 | 408.69 |
| 7071 | 409.683 |
| 7072 | 410.675 |
| 7073 | 411.668 |
| 7074 | 412.668 |
| 7075 | 413.668 |
| 7076 | 409.668 |
| 7077 | 410.668 |
| 7078 | 411.668 |
| 7079 | 409.268 |
| 7080 | 410.268 |
| 7081 | 408.788 |
| 7082 | 406.388 |
| 7083 | 407.388 |
| 7084 | 408.368 |
| 7085 | 409.348 |
| 7086 | 410.328 |
| 7087 | 411.328 |
| 7088 | 412.328 |
| 7089 | 409.128 |
| 7090 | 405.528 |
| 7091 | 404.028 |
| 7092 | 401.228 |
| 7093 | 402.228 |
| 7094 | 403.208 |
| 7095 | 404.188 |
| 7096 | 405.168 |
| 7097 | 406.148 |
| 7098 | 407.148 |
| 7099 | 404.648 |
| 7100 | 405.648 |
| 7101 | 403.924 |
| 7102 | 404.921 |
| 7103 | 405.918 |
| 7104 | 406.918 |
| 7105 | 404.368 |
| 7106 | 400.868 |
| 7107 | 401.868 |
| 7108 | 402.868 |
| 7109 | 403.868 |
| 7110 | 400.468 |
| 7111 | 395.968 |
| 7112 | 394.42 |
| 7113 | 395.413 |
| 7114 | 396.405 |
| 7115 | 397.398 |
| 7116 | 398.398 |
| 7117 | 393.898 |
| 7118 | 394.898 |
| 7119 | 393.194 |
| 7120 | 394.191 |
| 7121 | 395.188 |
| 7122 | 396.188 |
| 7123 | 397.188 |
| 7124 | 393.388 |
| 7125 | 394.368 |
| 7126 | 395.348 |
| 7127 | 396.328 |
| 7128 | 397.308 |
| 7129 | 395.664 |
| 7130 | 396.661 |
| 7131 | 397.658 |
| 7132 | 395.954 |
| 7133 | 396.951 |
| 7134 | 397.948 |
| 7135 | 398.948 |
| 7136 | 399.948 |
| 7137 | 400.948 |
| 7138 | 396.248 |
| 7139 | 397.228 |
| 7140 | 398.208 |
| 7141 | 399.188 |
| 7142 | 400.168 |
| 7143 | 401.168 |
| 7144 | 398.868 |
| 7145 | 399.868 |
| 7146 | 400.868 |
| 7147 | 401.868 |
| 7148 | 398.368 |
| 7149 | 395.818 |
| 7150 | 396.818 |
| 7151 | 397.818 |
| 7152 | 395.318 |
| 7153 | 392.218 |
| 7154 | 393.218 |
| 7155 | 394.218 |
| 7156 | 391.968 |
| 7157 | 392.968 |
| 7158 | 393.968 |
| 7159 | 394.968 |
| 7160 | 391.968 |
| 7161 | 392.968 |
| 7162 | 393.968 |
| 7163 | 391.268 |
| 7164 | 389.864 |
| 7165 | 390.861 |
| 7166 | 391.858 |
| 7167 | 392.838 |
| 7168 | 393.818 |
| 7169 | 394.798 |
| 7170 | 395.778 |
| 7171 | 396.758 |
| 7172 | 397.738 |
| 7173 | 398.718 |
| 7174 | 396.99 |
| 7175 | 397.983 |
| 7176 | 398.975 |
| 7177 | 399.968 |
| 7178 | 400.968 |
| 7179 | 401.968 |
| 7180 | 397.968 |
| 7181 | 398.968 |
| 7182 | 397.6 |
| 7183 | 398.593 |
| 7184 | 399.585 |
| 7185 | 400.578 |
| 7186 | 401.558 |
| 7187 | 402.538 |
| 7188 | 403.518 |
| 7189 | 401.678 |
| 7190 | 399.718 |
| 7191 | 400.718 |
| 7192 | 401.718 |
| 7193 | 399.718 |
| 7194 | 400.718 |
| 7195 | 401.718 |
| 7196 | 402.718 |
| 7197 | 403.718 |
| 7198 | 399.718 |
| 7199 | 400.703 |
| 7200 | 401.688 |
| 7201 | 402.673 |
| 7202 | 403.673 |
| 7203 | 401.373 |
| 7204 | 402.373 |
| 7205 | 400.223 |
| 7206 | 401.223 |
| 7207 | 402.223 |
| 7208 | 403.223 |
| 7209 | 404.223 |
| 7210 | 401.223 |
| 7211 | 402.203 |
| 7212 | 403.183 |
| 7213 | 404.163 |
| 7214 | 405.143 |
| 7215 | 406.143 |
| 7216 | 407.143 |
| 7217 | 403.643 |
| 7218 | 404.623 |
| 7219 | 405.603 |
| 7220 | 406.583 |
| 7221 | 407.563 |
| 7222 | 408.563 |
| 7223 | 405.563 |
| 7224 | 406.563 |
| 7225 | 407.558 |
| 7226 | 405.693 |
| 7227 | 406.688 |
| 7228 | 407.683 |
| 7229 | 408.663 |
| 7230 | 409.643 |
| 7231 | 410.623 |
| 7232 | 408.723 |
| 7233 | 409.723 |
| 7234 | 407.373 |
| 7235 | 408.373 |
| 7236 | 409.373 |
| 7237 | 406.873 |
| 7238 | 407.873 |
| 7239 | 408.873 |
| 7240 | 405.473 |
| 7241 | 406.473 |
| 7242 | 404.493 |
| 7243 | 405.493 |
| 7244 | 406.493 |
| 7245 | 407.473 |
| 7246 | 408.453 |
| 7247 | 409.433 |
| 7248 | 410.43 |
| 7249 | 411.428 |
| 7250 | 412.425 |
| 7251 | 409.773 |
| 7252 | 406.873 |
| 7253 | 407.873 |
| 7254 | 408.873 |
| 7255 | 409.873 |
| 7256 | 407.773 |
| 7257 | 408.773 |
| 7258 | 409.773 |
| 7259 | 408.289 |
| 7260 | 409.286 |
| 7261 | 410.283 |
| 7262 | 411.283 |
| 7263 | 408.883 |
| 7264 | 406.433 |
| 7265 | 407.433 |
| 7266 | 404.333 |
| 7267 | 405.333 |
| 7268 | 403.528 |
| 7269 | 404.523 |
| 7270 | 405.518 |
| 7271 | 406.513 |
| 7272 | 407.493 |
| 7273 | 408.473 |
| 7274 | 409.453 |
| 7275 | 410.433 |
| 7276 | 411.413 |
| 7277 | 412.393 |
| 7278 | 413.373 |
| 7279 | 414.353 |
| 7280 | 415.333 |
| 7281 | 416.313 |
| 7282 | 417.293 |
| 7283 | 418.273 |
| 7284 | 419.253 |
| 7285 | 420.253 |
| 7286 | 421.253 |
| 7287 | 418.553 |
| 7288 | 419.553 |
| 7289 | 420.553 |
| 7290 | 421.553 |
| 7291 | 417.353 |
| 7292 | 418.353 |
| 7293 | 419.353 |
| 7294 | 416.253 |
| 7295 | 417.233 |
| 7296 | 418.213 |
| 7297 | 419.193 |
| 7298 | 420.193 |
| 7299 | 421.193 |
| 7300 | 422.193 |
| 7301 | 417.793 |
| 7302 | 418.773 |
| 7303 | 419.753 |
| 7304 | 420.733 |
| 7305 | 421.713 |
| 7306 | 422.693 |
| 7307 | 423.673 |
| 7308 | 424.653 |
| 7309 | 423.253 |
| 7310 | 424.253 |
| 7311 | 419.953 |
| 7312 | 420.933 |
| 7313 | 421.913 |
| 7314 | 422.893 |
| 7315 | 423.873 |
| 7316 | 424.853 |
| 7317 | 425.833 |
| 7318 | 426.813 |
| 7319 | 427.793 |
| 7320 | 428.773 |
| 7321 | 426.833 |
| 7322 | 427.833 |
| 7323 | 428.833 |
| 7324 | 429.833 |
| 7325 | 427.633 |
| 7326 | 424.033 |
| 7327 | 425.033 |
| 7328 | 426.033 |
| 7329 | 423.783 |
| 7330 | 424.783 |
| 7331 | 425.783 |
| 7332 | 423.583 |
| 7333 | 424.583 |
| 7334 | 422.433 |
| 7335 | 423.433 |
| 7336 | 424.433 |
| 7337 | 425.433 |
| 7338 | 422.133 |
| 7339 | 423.133 |
| 7340 | 424.113 |
| 7341 | 425.093 |
| 7342 | 426.073 |
| 7343 | 427.073 |
| 7344 | 423.773 |
| 7345 | 419.673 |
| 7346 | 417.965 |
| 7347 | 418.958 |
| 7348 | 419.95 |
| 7349 | 420.943 |
| 7350 | 421.923 |
| 7351 | 422.903 |
| 7352 | 423.883 |
| 7353 | 424.863 |
| 7354 | 425.843 |
| 7355 | 426.823 |
| 7356 | 427.823 |
| 7357 | 428.823 |
| 7358 | 429.823 |
| 7359 | 425.323 |
| 7360 | 426.303 |
| 7361 | 427.283 |
| 7362 | 428.263 |
| 7363 | 429.243 |
| 7364 | 430.223 |
| 7365 | 431.203 |
| 7366 | 430.136 |
| 7367 | 431.129 |
| 7368 | 432.123 |
| 7369 | 433.12 |
| 7370 | 430.568 |
| 7371 | 431.565 |
| 7372 | 432.563 |
| 7373 | 433.543 |
| 7374 | 434.523 |
| 7375 | 435.503 |
| 7376 | 436.483 |
| 7377 | 437.463 |
| 7378 | 438.443 |
| 7379 | 439.443 |
| 7380 | 440.443 |
| 7381 | 436.943 |
| 7382 | 437.943 |
| 7383 | 438.943 |
| 7384 | 434.343 |
| 7385 | 435.323 |
| 7386 | 436.303 |
| 7387 | 437.283 |
| 7388 | 435.503 |
| 7389 | 436.503 |
| 7390 | 437.503 |
| 7391 | 435.859 |
| 7392 | 436.856 |
| 7393 | 437.853 |
| 7394 | 436.109 |
| 7395 | 437.106 |
| 7396 | 438.103 |
| 7397 | 439.103 |
| 7398 | 440.103 |
| 7399 | 435.903 |
| 7400 | 436.903 |
| 7401 | 434.503 |
| 7402 | 435.503 |
| 7403 | 432.953 |
| 7404 | 433.953 |
| 7405 | 434.953 |
| 7406 | 435.953 |
| 7407 | 432.853 |
| 7408 | 433.853 |
| 7409 | 434.853 |
| 7410 | 435.853 |
| 7411 | 436.853 |
| 7412 | 432.453 |
| 7413 | 433.453 |
| 7414 | 434.453 |
| 7415 | 431.853 |
| 7416 | 432.833 |
| 7417 | 433.813 |
| 7418 | 434.793 |
| 7419 | 435.773 |
| 7420 | 434.213 |
| 7421 | 435.213 |
| 7422 | 432.613 |
| 7423 | 433.613 |
| 7424 | 431.563 |
| 7425 | 429.213 |
| 7426 | 430.213 |
| 7427 | 431.213 |
| 7428 | 432.213 |
| 7429 | 433.213 |
| 7430 | 428.813 |
| 7431 | 427.213 |
| 7432 | 428.213 |
| 7433 | 424.613 |
| 7434 | 425.593 |
| 7435 | 426.573 |
| 7436 | 427.553 |
| 7437 | 428.533 |
| 7438 | 429.513 |
| 7439 | 430.493 |
| 7440 | 431.473 |
| 7441 | 432.453 |
| 7442 | 433.433 |
| 7443 | 434.413 |
| 7444 | 435.393 |
| 7445 | 436.373 |
| 7446 | 437.353 |
| 7447 | 438.333 |
| 7448 | 439.313 |
| 7449 | 440.293 |
| 7450 | 441.273 |
| 7451 | 439.809 |
| 7452 | 440.806 |
| 7453 | 441.803 |
| 7454 | 440.095 |
| 7455 | 441.088 |
| 7456 | 442.08 |
| 7457 | 443.073 |
| 7458 | 441.093 |
| 7459 | 442.093 |
| 7460 | 443.093 |
| 7461 | 440.543 |
| 7462 | 438.743 |
| 7463 | 435.793 |
| 7464 | 436.793 |
| 7465 | 434.973 |
| 7466 | 432.423 |
| 7467 | 433.423 |
| 7468 | 431.623 |
| 7469 | 432.623 |
| 7470 | 433.623 |
| 7471 | 434.623 |
| 7472 | 435.623 |
| 7473 | 432.623 |
| 7474 | 433.623 |
| 7475 | 434.603 |
| 7476 | 435.583 |
| 7477 | 436.563 |
| 7478 | 437.563 |
| 7479 | 435.563 |
| 7480 | 436.563 |
| 7481 | 437.563 |
| 7482 | 435.263 |
| 7483 | 436.263 |
| 7484 | 437.263 |
| 7485 | 438.263 |
| 7486 | 434.963 |
| 7487 | 430.963 |
| 7488 | 431.943 |
| 7489 | 432.923 |
| 7490 | 433.903 |
| 7491 | 434.883 |
| 7492 | 433.219 |
| 7493 | 434.216 |
| 7494 | 435.213 |
| 7495 | 433.408 |
| 7496 | 434.403 |
| 7497 | 435.398 |
| 7498 | 436.393 |
| 7499 | 437.393 |
| 7500 | 435.553 |
| 7501 | 436.553 |
| 7502 | 437.533 |
| 7503 | 438.513 |
| 7504 | 439.493 |
| 7505 | 438.246 |
| 7506 | 439.239 |
| 7507 | 440.233 |
| 7508 | 441.233 |
| 7509 | 438.933 |
| 7510 | 435.633 |
| 7511 | 436.633 |
| 7512 | 434.483 |
| 7513 | 435.483 |
| 7514 | 433.03 |
| 7515 | 434.028 |
| 7516 | 435.025 |
| 7517 | 436.023 |
| 7518 | 437.023 |
| 7519 | 434.823 |
| 7520 | 435.823 |
| 7521 | 436.823 |
| 7522 | 437.823 |
| 7523 | 433.723 |
| 7524 | 434.703 |
| 7525 | 435.683 |
| 7526 | 436.663 |
| 7527 | 437.658 |
| 7528 | 435.503 |
| 7529 | 436.498 |
| 7530 | 437.493 |
| 7531 | 438.493 |
| 7532 | 435.493 |
| 7533 | 436.493 |
| 7534 | 432.593 |
| 7535 | 433.573 |
| 7536 | 434.553 |
| 7537 | 435.533 |
| 7538 | 436.533 |
| 7539 | 434.283 |
| 7540 | 435.283 |
| 7541 | 436.283 |
| 7542 | 433.633 |
| 7543 | 434.633 |
| 7544 | 432.133 |
| 7545 | 433.133 |
| 7546 | 434.133 |
| 7547 | 435.113 |
| 7548 | 436.093 |
| 7549 | 437.073 |
| 7550 | 438.073 |
| 7551 | 439.073 |
| 7552 | 436.073 |
| 7553 | 434.273 |
| 7554 | 435.273 |
| 7555 | 436.273 |
| 7556 | 437.253 |
| 7557 | 438.233 |
| 7558 | 439.213 |
| 7559 | 440.199 |
| 7560 | 441.186 |
| 7561 | 442.186 |
| 7562 | 438.186 |
| 7563 | 439.186 |
| 7564 | 440.186 |
| 7565 | 441.186 |
| 7566 | 438.936 |
| 7567 | 439.936 |
| 7568 | 437.636 |
| 7569 | 434.836 |
| 7570 | 435.836 |
| 7571 | 436.836 |
| 7572 | 437.816 |
| 7573 | 438.796 |
| 7574 | 439.776 |
| 7575 | 440.756 |
| 7576 | 441.736 |
| 7577 | 442.716 |
| 7578 | 443.716 |
| 7579 | 444.716 |
| 7580 | 441.316 |
| 7581 | 439.516 |
| 7582 | 440.516 |
| 7583 | 441.516 |
| 7584 | 442.496 |
| 7585 | 443.476 |
| 7586 | 444.456 |
| 7587 | 445.436 |
| 7588 | 446.416 |
| 7589 | 447.396 |
| 7590 | 448.376 |
| 7591 | 449.356 |
| 7592 | 450.336 |
| 7593 | 451.316 |
| 7594 | 452.316 |
| 7595 | 448.816 |
| 7596 | 449.816 |
| 7597 | 450.816 |
| 7598 | 447.716 |
| 7599 | 448.716 |
| 7600 | 449.716 |
| 7601 | 450.716 |
| 7602 | 447.616 |
| 7603 | 448.596 |
| 7604 | 449.576 |
| 7605 | 450.556 |
| 7606 | 451.556 |
| 7607 | 452.556 |
| 7608 | 448.856 |
| 7609 | 449.836 |
| 7610 | 450.816 |
| 7611 | 451.796 |
| 7612 | 452.796 |
| 7613 | 449.196 |
| 7614 | 450.196 |
| 7615 | 451.176 |
| 7616 | 452.156 |
| 7617 | 453.136 |
| 7618 | 451.476 |
| 7619 | 452.476 |
| 7620 | 449.626 |
| 7621 | 450.626 |
| 7622 | 451.606 |
| 7623 | 452.586 |
| 7624 | 453.566 |
| 7625 | 454.546 |
| 7626 | 455.546 |
| 7627 | 456.546 |
| 7628 | 453.696 |
| 7629 | 454.696 |
| 7630 | 452.696 |
| 7631 | 453.696 |
| 7632 | 451.851 |
| 7633 | 452.846 |
| 7634 | 453.841 |
| 7635 | 454.836 |
| 7636 | 452.856 |
| 7637 | 453.856 |
| 7638 | 451.156 |
| 7639 | 452.156 |
| 7640 | 450.106 |
| 7641 | 451.106 |
| 7642 | 452.106 |
| 7643 | 449.956 |
| 7644 | 450.956 |
| 7645 | 451.956 |
| 7646 | 452.956 |
| 7647 | 450.606 |
| 7648 | 451.606 |
| 7649 | 452.586 |
| 7650 | 453.566 |
| 7651 | 454.546 |
| 7652 | 455.546 |
| 7653 | 452.696 |
| 7654 | 453.696 |
| 7655 | 454.696 |
| 7656 | 455.696 |
| 7657 | 456.696 |
| 7658 | 453.946 |
| 7659 | 454.926 |
| 7660 | 455.906 |
| 7661 | 456.886 |
| 7662 | 457.866 |
| 7663 | 458.846 |
| 7664 | 459.826 |
| 7665 | 460.806 |
| 7666 | 461.786 |
| 7667 | 462.766 |
| 7668 | 463.746 |
| 7669 | 461.841 |
| 7670 | 462.836 |
| 7671 | 463.831 |
| 7672 | 464.826 |
| 7673 | 463.006 |
| 7674 | 464.006 |
| 7675 | 465.006 |
| 7676 | 466.006 |
| 7677 | 463.856 |
| 7678 | 464.856 |
| 7679 | 465.856 |
| 7680 | 463.006 |
| 7681 | 464.006 |
| 7682 | 465.006 |
| 7683 | 462.606 |
| 7684 | 460.106 |
| 7685 | 457.606 |
| 7686 | 458.606 |
| 7687 | 455.006 |
| 7688 | 456.006 |
| 7689 | 457.006 |
| 7690 | 458.006 |
| 7691 | 454.806 |
| 7692 | 455.786 |
| 7693 | 456.766 |
| 7694 | 457.746 |
| 7695 | 458.726 |
| 7696 | 459.706 |
| 7697 | 460.686 |
| 7698 | 461.686 |
| 7699 | 462.686 |
| 7700 | 458.386 |
| 7701 | 459.386 |
| 7702 | 460.386 |
| 7703 | 461.386 |
| 7704 | 458.486 |
| 7705 | 459.486 |
| 7706 | 460.486 |
| 7707 | 455.686 |
| 7708 | 450.886 |
| 7709 | 451.866 |
| 7710 | 452.846 |
| 7711 | 453.826 |
| 7712 | 454.826 |
| 7713 | 452.576 |
| 7714 | 453.576 |
| 7715 | 451.933 |
| 7716 | 452.929 |
| 7717 | 453.926 |
| 7718 | 454.923 |
| 7719 | 452.471 |
| 7720 | 453.468 |
| 7721 | 454.466 |
| 7722 | 455.466 |
| 7723 | 452.166 |
| 7724 | 453.166 |
| 7725 | 454.166 |
| 7726 | 455.166 |
| 7727 | 456.166 |
| 7728 | 453.566 |
| 7729 | 454.566 |
| 7730 | 451.666 |
| 7731 | 447.166 |
| 7732 | 445.066 |
| 7733 | 442.416 |
| 7734 | 443.416 |
| 7735 | 441.736 |
| 7736 | 442.736 |
| 7737 | 439.436 |
| 7738 | 440.436 |
| 7739 | 438.776 |
| 7740 | 439.776 |
| 7741 | 440.776 |
| 7742 | 436.576 |
| 7743 | 437.576 |
| 7744 | 433.276 |
| 7745 | 434.276 |
| 7746 | 435.276 |
| 7747 | 436.276 |
| 7748 | 432.976 |
| 7749 | 433.956 |
| 7750 | 434.936 |
| 7751 | 435.916 |
| 7752 | 434.193 |
| 7753 | 435.189 |
| 7754 | 436.186 |
| 7755 | 437.186 |
| 7756 | 438.186 |
| 7757 | 434.586 |
| 7758 | 432.626 |
| 7759 | 433.626 |
| 7760 | 434.626 |
| 7761 | 435.621 |
| 7762 | 433.816 |
| 7763 | 434.811 |
| 7764 | 435.806 |
| 7765 | 436.786 |
| 7766 | 437.766 |
| 7767 | 438.746 |
| 7768 | 436.396 |
| 7769 | 437.396 |
| 7770 | 433.796 |
| 7771 | 434.776 |
| 7772 | 435.756 |
| 7773 | 436.736 |
| 7774 | 437.716 |
| 7775 | 438.696 |
| 7776 | 439.676 |
| 7777 | 440.656 |
| 7778 | 441.656 |
| 7779 | 439.456 |
| 7780 | 440.456 |
| 7781 | 438.873 |
| 7782 | 439.869 |
| 7783 | 440.866 |
| 7784 | 441.866 |
| 7785 | 438.966 |
| 7786 | 439.966 |
| 7787 | 438.458 |
| 7788 | 439.451 |
| 7789 | 440.443 |
| 7790 | 441.436 |
| 7791 | 442.436 |
| 7792 | 443.436 |
| 7793 | 438.936 |
| 7794 | 439.916 |
| 7795 | 440.896 |
| 7796 | 441.876 |
| 7797 | 442.876 |
| 7798 | 443.876 |
| 7799 | 439.776 |
| 7800 | 440.776 |
| 7801 | 441.776 |
| 7802 | 437.076 |
| 7803 | 438.076 |
| 7804 | 435.921 |
| 7805 | 436.916 |
| 7806 | 437.911 |
| 7807 | 438.906 |
| 7808 | 436.806 |
| 7809 | 437.806 |
| 7810 | 438.806 |
| 7811 | 439.786 |
| 7812 | 440.766 |
| 7813 | 441.746 |
| 7814 | 442.726 |
| 7815 | 443.726 |
| 7816 | 440.776 |
| 7817 | 441.776 |
| 7818 | 440.436 |
| 7819 | 441.436 |
| 7820 | 437.436 |
| 7821 | 434.486 |
| 7822 | 435.486 |
| 7823 | 436.486 |
| 7824 | 435.023 |
| 7825 | 436.019 |
| 7826 | 437.016 |
| 7827 | 438.016 |
| 7828 | 439.016 |
| 7829 | 434.116 |
| 7830 | 435.116 |
| 7831 | 433.196 |
| 7832 | 434.196 |
| 7833 | 435.176 |
| 7834 | 436.156 |
| 7835 | 437.136 |
| 7836 | 435.311 |
| 7837 | 436.306 |
| 7838 | 437.301 |
| 7839 | 438.296 |
| 7840 | 436.436 |
| 7841 | 437.436 |
| 7842 | 438.436 |
| 7843 | 436.748 |
| 7844 | 437.741 |
| 7845 | 438.733 |
| 7846 | 439.726 |
| 7847 | 440.706 |
| 7848 | 441.686 |
| 7849 | 442.666 |
| 7850 | 441.123 |
| 7851 | 442.119 |
| 7852 | 443.116 |
| 7853 | 444.096 |
| 7854 | 445.076 |
| 7855 | 446.056 |
| 7856 | 447.056 |
| 7857 | 444.756 |
| 7858 | 445.756 |
| 7859 | 446.756 |
| 7860 | 444.056 |
| 7861 | 445.056 |
| 7862 | 446.036 |
| 7863 | 447.016 |
| 7864 | 447.996 |
| 7865 | 446.436 |
| 7866 | 447.436 |
| 7867 | 444.986 |
| 7868 | 445.966 |
| 7869 | 446.946 |
| 7870 | 447.926 |
| 7871 | 448.906 |
| 7872 | 449.886 |
| 7873 | 450.866 |
| 7874 | 449.263 |
| 7875 | 450.259 |
| 7876 | 451.256 |
| 7877 | 449.853 |
| 7878 | 450.849 |
| 7879 | 451.846 |
| 7880 | 449.966 |
| 7881 | 447.616 |
| 7882 | 448.616 |
| 7883 | 449.616 |
| 7884 | 450.616 |
| 7885 | 447.766 |
| 7886 | 448.766 |
| 7887 | 449.766 |
| 7888 | 447.966 |
| 7889 | 448.966 |
| 7890 | 449.966 |
| 7891 | 448.026 |
| 7892 | 449.026 |
| 7893 | 450.026 |
| 7894 | 451.026 |
| 7895 | 447.926 |
| 7896 | 448.906 |
| 7897 | 449.886 |
| 7898 | 450.866 |
| 7899 | 451.866 |
| 7900 | 452.866 |
| 7901 | 449.916 |
| 7902 | 450.916 |
| 7903 | 448.466 |
| 7904 | 449.466 |
| 7905 | 450.466 |
| 7906 | 451.461 |
| 7907 | 449.456 |
| 7908 | 450.451 |
| 7909 | 451.446 |
| 7910 | 452.446 |
| 7911 | 453.446 |
| 7912 | 450.046 |
| 7913 | 451.046 |
| 7914 | 452.046 |
| 7915 | 448.946 |
| 7916 | 449.926 |
| 7917 | 450.906 |
| 7918 | 451.886 |
| 7919 | 449.583 |
| 7920 | 450.581 |
| 7921 | 451.578 |
| 7922 | 452.576 |
| 7923 | 450.176 |
| 7924 | 451.176 |
| 7925 | 452.176 |
| 7926 | 450.448 |
| 7927 | 451.441 |
| 7928 | 452.433 |
| 7929 | 453.426 |
| 7930 | 454.426 |
| 7931 | 455.426 |
| 7932 | 451.026 |
| 7933 | 452.026 |
| 7934 | 448.426 |
| 7935 | 449.426 |
| 7936 | 450.426 |
| 7937 | 451.406 |
| 7938 | 452.386 |
| 7939 | 453.366 |
| 7940 | 454.366 |
| 7941 | 455.366 |
| 7942 | 452.566 |
| 7943 | 450.516 |
| 7944 | 451.516 |
| 7945 | 452.516 |
| 7946 | 453.516 |
| 7947 | 454.516 |
| 7948 | 450.916 |
| 7949 | 451.896 |
| 7950 | 452.876 |
| 7951 | 453.856 |
| 7952 | 454.836 |
| 7953 | 455.816 |
| 7954 | 456.796 |
| 7955 | 457.776 |
| 7956 | 455.276 |
| 7957 | 452.776 |
| 7958 | 453.776 |
| 7959 | 454.756 |
| 7960 | 455.736 |
| 7961 | 456.716 |
| 7962 | 457.716 |
| 7963 | 455.066 |
| 7964 | 456.066 |
| 7965 | 457.066 |
| 7966 | 458.066 |
| 7967 | 454.966 |
| 7968 | 455.966 |
| 7969 | 456.966 |
| 7970 | 454.166 |
| 7971 | 455.166 |
| 7972 | 456.166 |
| 7973 | 454.116 |
| 7974 | 455.116 |
| 7975 | 456.116 |
| 7976 | 457.116 |
| 7977 | 453.316 |
| 7978 | 454.316 |
| 7979 | 452.416 |
| 7980 | 453.416 |
| 7981 | 454.416 |
| 7982 | 452.261 |
| 7983 | 453.256 |
| 7984 | 454.251 |
| 7985 | 455.246 |
| 7986 | 456.246 |
| 7987 | 457.246 |
| 7988 | 458.246 |
| 7989 | 453.646 |
| 7990 | 452.406 |
| 7991 | 449.106 |
| 7992 | 450.106 |
| 7993 | 448.056 |
| 7994 | 445.706 |
| 7995 | 446.706 |
| 7996 | 447.706 |
| 7997 | 445.846 |
| 7998 | 446.846 |
| 7999 | 447.846 |
| 8000 | 444.746 |
| 8001 | 445.746 |
| 8002 | 443.926 |
| 8003 | 441.576 |
| 8004 | 442.576 |
| 8005 | 443.576 |
| 8006 | 444.576 |
| 8007 | 440.676 |
| 8008 | 436.176 |
| 8009 | 437.176 |
| 8010 | 438.176 |
| 8011 | 434.776 |
| 8012 | 435.756 |
| 8013 | 436.736 |
| 8014 | 437.716 |
| 8015 | 435.993 |
| 8016 | 436.989 |
| 8017 | 437.986 |
| 8018 | 434.886 |
| 8019 | 435.886 |
| 8020 | 436.886 |
| 8021 | 437.886 |
| 8022 | 435.536 |
| 8023 | 436.536 |
| 8024 | 437.516 |
| 8025 | 438.496 |
| 8026 | 439.476 |
| 8027 | 440.476 |
| 8028 | 441.476 |
| 8029 | 437.976 |
| 8030 | 436.216 |
| 8031 | 437.216 |
| 8032 | 438.216 |
| 8033 | 439.216 |
| 8034 | 436.516 |
| 8035 | 437.516 |
| 8036 | 438.496 |
| 8037 | 439.476 |
| 8038 | 440.456 |
| 8039 | 441.436 |
| 8040 | 442.416 |
| 8041 | 443.396 |
| 8042 | 441.693 |
| 8043 | 442.689 |
| 8044 | 443.686 |
| 8045 | 442.439 |
| 8046 | 443.433 |
| 8047 | 444.426 |
| 8048 | 445.426 |
| 8049 | 446.426 |
| 8050 | 441.626 |
| 8051 | 442.626 |
| 8052 | 443.626 |
| 8053 | 438.626 |
| 8054 | 439.606 |
| 8055 | 440.586 |
| 8056 | 441.566 |
| 8057 | 442.546 |
| 8058 | 441.063 |
| 8059 | 442.059 |
| 8060 | 443.056 |
| 8061 | 441.653 |
| 8062 | 442.649 |
| 8063 | 443.646 |
| 8064 | 444.646 |
| 8065 | 445.646 |
| 8066 | 440.946 |
| 8067 | 441.946 |
| 8068 | 442.946 |
| 8069 | 440.966 |
| 8070 | 441.966 |
| 8071 | 440.543 |
| 8072 | 441.539 |
| 8073 | 442.536 |
| 8074 | 443.516 |
| 8075 | 444.496 |
| 8076 | 445.476 |
| 8077 | 443.656 |
| 8078 | 444.656 |
| 8079 | 445.656 |
| 8080 | 443.256 |
| 8081 | 444.256 |
| 8082 | 445.256 |
| 8083 | 446.256 |
| 8084 | 447.256 |
| 8085 | 448.256 |
| 8086 | 443.656 |
| 8087 | 444.656 |
| 8088 | 445.656 |
| 8089 | 442.256 |
| 8090 | 443.256 |
| 8091 | 441.056 |
| 8092 | 442.056 |
| 8093 | 443.056 |
| 8094 | 444.056 |
| 8095 | 445.056 |
| 8096 | 442.206 |
| 8097 | 438.706 |
| 8098 | 439.706 |
| 8099 | 440.706 |
| 8100 | 441.706 |
| 8101 | 442.706 |
| 8102 | 439.856 |
| 8103 | 440.856 |
| 8104 | 438.916 |
| 8105 | 439.916 |
| 8106 | 440.916 |
| 8107 | 439.136 |
| 8108 | 436.586 |
| 8109 | 437.586 |
| 8110 | 438.566 |
| 8111 | 439.546 |
| 8112 | 440.526 |
| 8113 | 439.146 |
| 8114 | 437.186 |
| 8115 | 438.186 |
| 8116 | 436.326 |
| 8117 | 437.326 |
| 8118 | 438.326 |
| 8119 | 436.666 |
| 8120 | 434.786 |
| 8121 | 435.786 |
| 8122 | 436.766 |
| 8123 | 437.746 |
| 8124 | 438.726 |
| 8125 | 439.706 |
| 8126 | 440.686 |
| 8127 | 441.666 |
| 8128 | 439.516 |
| 8129 | 440.516 |
| 8130 | 437.416 |
| 8131 | 438.416 |
| 8132 | 437.053 |
| 8133 | 438.049 |
| 8134 | 439.046 |
| 8135 | 440.026 |
| 8136 | 441.006 |
| 8137 | 441.986 |
| 8138 | 442.986 |
| 8139 | 443.986 |
| 8140 | 441.136 |
| 8141 | 439.889 |
| 8142 | 440.883 |
| 8143 | 441.876 |
| 8144 | 442.856 |
| 8145 | 443.836 |
| 8146 | 444.816 |
| 8147 | 445.796 |
| 8148 | 446.776 |
| 8149 | 447.756 |
| 8150 | 445.501 |
| 8151 | 446.496 |
| 8152 | 447.491 |
| 8153 | 448.486 |
| 8154 | 449.486 |
| 8155 | 450.486 |
| 8156 | 451.486 |
| 8157 | 447.186 |
| 8158 | 448.183 |
| 8159 | 445.631 |
| 8160 | 446.628 |
| 8161 | 447.626 |
| 8162 | 448.626 |
| 8163 | 449.626 |
| 8164 | 446.876 |
| 8165 | 447.876 |
| 8166 | 445.076 |
| 8167 | 446.076 |
| 8168 | 447.076 |
| 8169 | 445.493 |
| 8170 | 446.489 |
| 8171 | 447.486 |
| 8172 | 445.386 |
| 8173 | 443.136 |
| 8174 | 444.136 |
| 8175 | 445.136 |
| 8176 | 442.286 |
| 8177 | 437.286 |
| 8178 | 434.086 |
| 8179 | 435.086 |
| 8180 | 436.086 |
| 8181 | 437.086 |
| 8182 | 433.686 |
| 8183 | 432.283 |
| 8184 | 433.279 |
| 8185 | 434.276 |
| 8186 | 432.673 |
| 8187 | 433.669 |
| 8188 | 434.666 |
| 8189 | 435.646 |
| 8190 | 436.626 |
| 8191 | 437.606 |
| 8192 | 438.606 |
| 8193 | 439.606 |
| 8194 | 440.606 |
| 8195 | 436.606 |
| 8196 | 437.603 |
| 8197 | 435.301 |
| 8198 | 436.298 |
| 8199 | 437.296 |
| 8200 | 435.241 |
| 8201 | 436.236 |
| 8202 | 437.231 |
| 8203 | 438.226 |
| 8204 | 436.563 |
| 8205 | 437.559 |
| 8206 | 438.556 |
| 8207 | 439.556 |
| 8208 | 436.056 |
| 8209 | 437.056 |
| 8210 | 435.493 |
| 8211 | 436.489 |
| 8212 | 437.486 |
| 8213 | 435.561 |
| 8214 | 436.556 |
| 8215 | 437.551 |
| 8216 | 438.546 |
| 8217 | 439.526 |
| 8218 | 440.506 |
| 8219 | 441.486 |
| 8220 | 439.186 |
| 8221 | 440.186 |
| 8222 | 441.186 |
| 8223 | 442.186 |
| 8224 | 440.426 |
| 8225 | 441.426 |
| 8226 | 442.406 |
| 8227 | 443.386 |
| 8228 | 444.366 |
| 8229 | 445.346 |
| 8230 | 446.346 |
| 8231 | 447.346 |
| 8232 | 442.546 |
| 8233 | 441.166 |
| 8234 | 442.166 |
| 8235 | 438.466 |
| 8236 | 439.446 |
| 8237 | 440.426 |
| 8238 | 441.406 |
| 8239 | 442.386 |
| 8240 | 443.366 |
| 8241 | 444.346 |
| 8242 | 445.326 |
| 8243 | 446.306 |
| 8244 | 447.286 |
| 8245 | 448.273 |
| 8246 | 449.259 |
| 8247 | 450.239 |
| 8248 | 451.219 |
| 8249 | 452.199 |
| 8250 | 453.179 |
| 8251 | 454.159 |
| 8252 | 455.139 |
| 8253 | 456.139 |
| 8254 | 457.139 |
| 8255 | 452.239 |
| 8256 | 453.239 |
| 8257 | 454.239 |
| 8258 | 449.739 |
| 8259 | 450.739 |
| 8260 | 446.939 |
| 8261 | 447.939 |
| 8262 | 446.256 |
| 8263 | 447.253 |
| 8264 | 448.249 |
| 8265 | 446.946 |
| 8266 | 447.943 |
| 8267 | 448.939 |
| 8268 | 449.939 |
| 8269 | 447.089 |
| 8270 | 448.089 |
| 8271 | 449.089 |
| 8272 | 447.346 |
| 8273 | 448.343 |
| 8274 | 449.339 |
| 8275 | 447.189 |
| 8276 | 448.189 |
| 8277 | 449.189 |
| 8278 | 446.089 |
| 8279 | 447.089 |
| 8280 | 448.089 |
| 8281 | 445.989 |
| 8282 | 446.989 |
| 8283 | 447.989 |
| 8284 | 446.084 |
| 8285 | 447.079 |
| 8286 | 448.074 |
| 8287 | 449.069 |
| 8288 | 447.229 |
| 8289 | 448.229 |
| 8290 | 449.229 |
| 8291 | 447.449 |
| 8292 | 448.449 |
| 8293 | 449.449 |
| 8294 | 450.429 |
| 8295 | 451.409 |
| 8296 | 452.389 |
| 8297 | 450.986 |
| 8298 | 451.983 |
| 8299 | 452.979 |
| 8300 | 451.336 |
| 8301 | 452.333 |
| 8302 | 453.329 |
| 8303 | 454.326 |
| 8304 | 452.683 |
| 8305 | 453.679 |
| 8306 | 454.679 |
| 8307 | 455.679 |
| 8308 | 456.679 |
| 8309 | 451.679 |
| 8310 | 450.416 |
| 8311 | 451.413 |
| 8312 | 452.409 |
| 8313 | 453.389 |
| 8314 | 454.369 |
| 8315 | 455.349 |
| 8316 | 456.349 |
| 8317 | 457.349 |
| 8318 | 454.399 |
| 8319 | 455.399 |
| 8320 | 456.399 |
| 8321 | 451.799 |
| 8322 | 452.799 |
| 8323 | 453.799 |
| 8324 | 448.799 |
| 8325 | 449.779 |
| 8326 | 450.759 |
| 8327 | 451.739 |
| 8328 | 452.739 |
| 8329 | 453.739 |
| 8330 | 451.239 |
| 8331 | 452.239 |
| 8332 | 453.239 |
| 8333 | 449.939 |
| 8334 | 448.436 |
| 8335 | 449.433 |
| 8336 | 450.429 |
| 8337 | 451.409 |
| 8338 | 452.389 |
| 8339 | 453.369 |
| 8340 | 451.549 |
| 8341 | 452.549 |
| 8342 | 453.529 |
| 8343 | 454.509 |
| 8344 | 455.489 |
| 8345 | 456.489 |
| 8346 | 453.639 |
| 8347 | 450.789 |
| 8348 | 451.789 |
| 8349 | 452.769 |
| 8350 | 453.749 |
| 8351 | 454.729 |
| 8352 | 455.709 |
| 8353 | 456.689 |
| 8354 | 457.669 |
| 8355 | 455.519 |
| 8356 | 456.519 |
| 8357 | 457.519 |
| 8358 | 458.519 |
| 8359 | 456.219 |
| 8360 | 457.219 |
| 8361 | 455.259 |
| 8362 | 456.259 |
| 8363 | 451.759 |
| 8364 | 452.739 |
| 8365 | 453.719 |
| 8366 | 454.699 |
| 8367 | 452.899 |
| 8368 | 453.899 |
| 8369 | 449.799 |
| 8370 | 448.336 |
| 8371 | 449.333 |
| 8372 | 450.329 |
| 8373 | 451.329 |
| 8374 | 448.479 |
| 8375 | 449.479 |
| 8376 | 447.779 |
| 8377 | 448.779 |
| 8378 | 445.879 |
| 8379 | 444.352 |
| 8380 | 445.344 |
| 8381 | 446.337 |
| 8382 | 447.329 |
| 8383 | 445.349 |
| 8384 | 446.349 |
| 8385 | 447.349 |
| 8386 | 448.349 |
| 8387 | 449.349 |
| 8388 | 445.249 |
| 8389 | 446.229 |
| 8390 | 447.209 |
| 8391 | 448.189 |
| 8392 | 449.169 |
| 8393 | 450.149 |
| 8394 | 451.129 |
| 8395 | 452.109 |
| 8396 | 453.089 |
| 8397 | 454.069 |
| 8398 | 455.049 |
| 8399 | 456.029 |
| 8400 | 453.729 |
| 8401 | 454.729 |
| 8402 | 455.709 |
| 8403 | 456.689 |
| 8404 | 457.669 |
| 8405 | 454.769 |
| 8406 | 455.749 |
| 8407 | 453.399 |
| 8408 | 454.379 |
| 8409 | 455.359 |
| 8410 | 452.359 |
| 8411 | 453.339 |
| 8412 | 454.319 |
| 8413 | 455.299 |
| 8414 | 456.279 |
| 8415 | 457.259 |
| 8416 | 458.239 |
| 8417 | 459.219 |
| 8418 | 460.199 |
| 8419 | 461.179 |
| 8420 | 462.159 |
| 8421 | 463.139 |
| 8422 | 464.119 |
| 8423 | 465.099 |
| 8424 | 466.079 |
| 8425 | 463.729 |
| 8426 | 464.709 |
| 8427 | 465.689 |
| 8428 | 466.669 |
| 8429 | 467.649 |
| 8430 | 468.629 |
| 8431 | 469.609 |
| 8432 | 470.589 |
| 8433 | 467.639 |
| 8434 | 468.619 |
| 8435 | 469.599 |
| 8436 | 470.579 |
| 8437 | 467.729 |
| 8438 | 465.129 |
| 8439 | 466.109 |
| 8440 | 463.109 |
| 8441 | 464.089 |
| 8442 | 465.069 |
| 8443 | 466.049 |
| 8444 | 463.149 |
| 8445 | 464.129 |
| 8446 | 465.109 |
| 8447 | 462.409 |
| 8448 | 459.759 |
| 8449 | 460.739 |
| 8450 | 461.719 |
| 8451 | 459.219 |
| 8452 | 460.199 |
| 8453 | 461.179 |
| 8454 | 462.159 |
| 8455 | 463.139 |
| 8456 | 464.119 |
| 8457 | 465.099 |
| 8458 | 466.079 |
| 8459 | 463.179 |
| 8460 | 464.159 |
| 8461 | 465.139 |
| 8462 | 466.119 |
| 8463 | 467.119 |
| 8464 | 464.269 |
| 8465 | 465.249 |
| 8466 | 466.229 |
| 8467 | 463.329 |
| 8468 | 464.309 |
| 8469 | 465.289 |
| 8470 | 462.489 |
| 8471 | 463.469 |
| 8472 | 464.449 |
| 8473 | 465.429 |
| 8474 | 466.409 |
| 8475 | 467.389 |
| 8476 | 468.369 |
| 8477 | 466.219 |
| 8478 | 467.199 |
| 8479 | 468.179 |
| 8480 | 469.159 |
| 8481 | 470.139 |
| 8482 | 471.119 |
| 8483 | 472.099 |
| 8484 | 473.079 |
| 8485 | 474.059 |
| 8486 | 475.039 |
| 8487 | 476.019 |
| 8488 | 473.569 |
| 8489 | 474.549 |
| 8490 | 471.649 |
| 8491 | 469.149 |
| 8492 | 466.699 |
| 8493 | 463.999 |
| 8494 | 464.979 |
| 8495 | 465.959 |
| 8496 | 466.939 |
| 8497 | 464.789 |
| 8498 | 465.769 |
| 8499 | 466.749 |
| 8500 | 467.729 |
| 8501 | 468.709 |
| 8502 | 466.459 |
| 8503 | 467.439 |
| 8504 | 468.419 |
| 8505 | 469.399 |
| 8506 | 470.379 |
| 8507 | 468.029 |
| 8508 | 465.479 |
| 8509 | 466.459 |
| 8510 | 467.439 |
| 8511 | 468.419 |
| 8512 | 469.399 |
| 8513 | 466.749 |
| 8514 | 467.729 |
| 8515 | 468.709 |
| 8516 | 469.689 |
| 8517 | 466.489 |
| 8518 | 467.469 |
| 8519 | 468.449 |
| 8520 | 469.429 |
| 8521 | 464.729 |
| 8522 | 465.709 |
| 8523 | 466.689 |
| 8524 | 467.669 |
| 8525 | 468.649 |
| 8526 | 469.629 |
| 8527 | 470.609 |
| 8528 | 471.589 |
| 8529 | 472.569 |
| 8530 | 470.269 |
| 8531 | 471.249 |
| 8532 | 472.229 |
| 8533 | 473.209 |
| 8534 | 474.189 |
| 8535 | 475.169 |
| 8536 | 476.149 |
| 8537 | 474.049 |
| 8538 | 471.999 |
| 8539 | 472.979 |
| 8540 | 470.829 |
| 8541 | 471.809 |
| 8542 | 469.009 |
| 8543 | 469.989 |
| 8544 | 470.969 |
| 8545 | 471.949 |
| 8546 | 472.929 |
| 8547 | 473.909 |
| 8548 | 474.889 |
| 8549 | 475.869 |
| 8550 | 476.849 |
| 8551 | 477.829 |
| 8552 | 478.809 |
| 8553 | 479.789 |
| 8554 | 480.769 |
| 8555 | 481.749 |
| 8556 | 482.729 |
| 8557 | 480.079 |
| 8558 | 481.059 |
| 8559 | 482.039 |
| 8560 | 483.019 |
| 8561 | 483.999 |
| 8562 | 484.979 |
| 8563 | 485.959 |
| 8564 | 486.939 |
| 8565 | 484.979 |
| 8566 | 482.729 |
| 8567 | 479.929 |
| 8568 | 477.929 |
| 8569 | 474.629 |
| 8570 | 475.609 |
| 8571 | 476.589 |
| 8572 | 477.569 |
| 8573 | 478.549 |
| 8574 | 474.049 |
| 8575 | 471.399 |
| 8576 | 472.379 |
| 8577 | 467.879 |
| 8578 | 468.859 |
| 8579 | 469.839 |
| 8580 | 466.639 |
| 8581 | 467.619 |
| 8582 | 468.599 |
| 8583 | 469.579 |
| 8584 | 470.559 |
| 8585 | 471.539 |
| 8586 | 472.519 |
| 8587 | 473.499 |
| 8588 | 474.479 |
| 8589 | 475.459 |
| 8590 | 476.439 |
| 8591 | 477.419 |
| 8592 | 478.399 |
| 8593 | 479.379 |
| 8594 | 480.359 |
| 8595 | 476.059 |
| 8596 | 477.039 |
| 8597 | 478.019 |
| 8598 | 478.999 |
| 8599 | 479.979 |
| 8600 | 475.079 |
| 8601 | 476.059 |
| 8602 | 477.039 |
| 8603 | 478.019 |
| 8604 | 478.999 |
| 8605 | 474.899 |
| 8606 | 475.879 |
| 8607 | 476.859 |
| 8608 | 477.839 |
| 8609 | 478.819 |
| 8610 | 475.619 |
| 8611 | 476.599 |
| 8612 | 477.579 |
| 8613 | 478.559 |
| 8614 | 474.459 |
| 8615 | 475.439 |
| 8616 | 476.419 |
| 8617 | 477.399 |
| 8618 | 478.379 |
| 8619 | 479.359 |
| 8620 | 480.339 |
| 8621 | 481.319 |
| 8622 | 482.299 |
| 8623 | 483.279 |
| 8624 | 484.259 |
| 8625 | 481.659 |
| 8626 | 482.639 |
| 8627 | 483.619 |
| 8628 | 481.979 |
| 8629 | 482.959 |
| 8630 | 480.909 |
| 8631 | 481.889 |
| 8632 | 479.639 |
| 8633 | 480.619 |
| 8634 | 481.599 |
| 8635 | 482.579 |
| 8636 | 479.729 |
| 8637 | 477.529 |
| 8638 | 478.509 |
| 8639 | 479.489 |
| 8640 | 480.469 |
| 8641 | 481.449 |
| 8642 | 482.429 |
| 8643 | 479.229 |
| 8644 | 476.129 |
| 8645 | 477.109 |
| 8646 | 478.089 |
| 8647 | 479.069 |
| 8648 | 475.669 |
| 8649 | 473.019 |
| 8650 | 473.999 |
| 8651 | 474.979 |
| 8652 | 472.629 |
| 8653 | 473.609 |
| 8654 | 471.209 |
| 8655 | 472.189 |
| 8656 | 473.169 |
| 8657 | 474.149 |
| 8658 | 475.129 |
| 8659 | 476.109 |
| 8660 | 477.089 |
| 8661 | 478.069 |
| 8662 | 479.049 |
| 8663 | 480.029 |
| 8664 | 481.009 |
| 8665 | 481.989 |
| 8666 | 482.969 |
| 8667 | 483.949 |
| 8668 | 484.929 |
| 8669 | 485.909 |
| 8670 | 486.889 |
| 8671 | 487.869 |
| 8672 | 488.849 |
| 8673 | 489.829 |
| 8674 | 490.809 |
| 8675 | 491.789 |
| 8676 | 492.769 |
| 8677 | 486.769 |
| 8678 | 475.769 |
| 8679 | 473.319 |
| 8680 | 474.299 |
| 8681 | 475.279 |
| 8682 | 476.259 |
| 8683 | 477.239 |
| 8684 | 478.219 |
| 8685 | 479.199 |
| 8686 | 480.179 |
| 8687 | 476.079 |
| 8688 | 477.059 |
| 8689 | 478.039 |
| 8690 | 479.019 |
| 8691 | 479.999 |
| 8692 | 476.999 |
| 8693 | 477.979 |
| 8694 | 475.629 |
| 8695 | 476.609 |
| 8696 | 477.589 |
| 8697 | 478.569 |
| 8698 | 472.969 |
| 8699 | 473.949 |
| 8700 | 474.929 |
| 8701 | 475.909 |
| 8702 | 476.889 |
| 8703 | 477.869 |
| 8704 | 470.869 |
| 8705 | 471.849 |
| 8706 | 472.829 |
| 8707 | 469.929 |
| 8708 | 470.909 |
| 8709 | 471.889 |
| 8710 | 472.869 |
| 8711 | 473.849 |
| 8712 | 474.829 |
| 8713 | 471.979 |
| 8714 | 469.579 |
| 8715 | 465.879 |
| 8716 | 466.859 |
| 8717 | 467.839 |
| 8718 | 468.819 |
| 8719 | 469.799 |
| 8720 | 470.799 |
| 8721 | 468.099 |
| 8722 | 466.159 |
| 8723 | 467.159 |
| 8724 | 468.159 |
| 8725 | 469.139 |
| 8726 | 470.119 |
| 8727 | 468.459 |
| 8728 | 469.459 |
| 8729 | 468.032 |
| 8730 | 469.024 |
| 8731 | 470.017 |
| 8732 | 471.009 |
| 8733 | 471.989 |
| 8734 | 472.969 |
| 8735 | 473.949 |
| 8736 | 474.929 |
| 8737 | 475.909 |
| 8738 | 476.889 |
| 8739 | 477.869 |
| 8740 | 478.869 |
| 8741 | 479.869 |
| 8742 | 475.069 |
| 8743 | 474.049 |
| 8744 | 473.009 |
| 8745 | 474.009 |
| 8746 | 475.009 |
| 8747 | 473.969 |
| 8748 | 474.969 |
| 8749 | 475.949 |
| 8750 | 476.929 |
| 8751 | 473.929 |
| 8752 | 470.829 |
| 8753 | 471.829 |
| 8754 | 470.649 |
| 8755 | 471.649 |
| 8756 | 472.644 |
| 8757 | 470.859 |
| 8758 | 471.854 |
| 8759 | 472.849 |
| 8760 | 473.829 |
| 8761 | 474.809 |
| 8762 | 475.789 |
| 8763 | 476.769 |
| 8764 | 475.329 |
| 8765 | 476.329 |
| 8766 | 477.309 |
| 8767 | 478.289 |
| 8768 | 479.282 |
| 8769 | 477.934 |
| 8770 | 478.927 |
| 8771 | 479.919 |
| 8772 | 480.914 |
| 8773 | 481.909 |
| 8774 | 480.044 |
| 8775 | 481.039 |
| 8776 | 480.033 |
| 8777 | 481.026 |
| 8778 | 482.019 |
| 8779 | 483.019 |
| 8780 | 481.419 |
| 8781 | 482.399 |
| 8782 | 483.379 |
| 8783 | 484.359 |
| 8784 | 485.356 |
| 8785 | 483.713 |
| 8786 | 484.709 |
| 8787 | 485.689 |
| 8788 | 486.669 |
| 8789 | 484.369 |
| 8790 | 480.769 |
| 8791 | 481.769 |
| 8792 | 482.769 |
| 8793 | 483.749 |
| 8794 | 484.729 |
| 8795 | 485.709 |
| 8796 | 486.689 |
| 8797 | 487.669 |
| 8798 | 488.649 |
| 8799 | 487.189 |
| 8800 | 488.189 |
| 8801 | 486.089 |
| 8802 | 483.789 |
| 8803 | 484.769 |
| 8804 | 485.749 |
| 8805 | 486.729 |
| 8806 | 484.844 |
| 8807 | 485.839 |
| 8808 | 486.834 |
| 8809 | 487.829 |
| 8810 | 488.809 |
| 8811 | 489.789 |
| 8812 | 490.769 |
| 8813 | 491.749 |
| 8814 | 490.142 |
| 8815 | 491.134 |
| 8816 | 492.127 |
| 8817 | 493.119 |
| 8818 | 494.099 |
| 8819 | 495.079 |
| 8820 | 496.059 |
| 8821 | 497.039 |
| 8822 | 498.019 |
| 8823 | 498.999 |
| 8824 | 499.979 |
| 8825 | 500.979 |
| 8826 | 498.679 |
| 8827 | 499.679 |
| 8828 | 500.659 |
| 8829 | 501.639 |
| 8830 | 502.619 |
| 8831 | 503.599 |
| 8832 | 504.579 |
| 8833 | 505.579 |
| 8834 | 503.979 |
| 8835 | 504.979 |
| 8836 | 502.579 |
| 8837 | 503.579 |
| 8838 | 501.479 |
| 8839 | 502.479 |
| 8840 | 503.459 |
| 8841 | 504.439 |
| 8842 | 505.439 |
| 8843 | 503.559 |
| 8844 | 504.539 |
| 8845 | 505.519 |
| 8846 | 506.499 |
| 8847 | 507.479 |
| 8848 | 508.459 |
| 8849 | 509.439 |
| 8850 | 507.976 |
| 8851 | 508.973 |
| 8852 | 509.969 |
| 8853 | 508.426 |
| 8854 | 509.423 |
| 8855 | 510.419 |
| 8856 | 511.399 |
| 8857 | 512.379 |
| 8858 | 513.359 |
| 8859 | 514.339 |
| 8860 | 512.359 |
| 8861 | 513.359 |
| 8862 | 514.359 |
| 8863 | 512.359 |
| 8864 | 513.359 |
| 8865 | 514.339 |
| 8866 | 515.319 |
| 8867 | 516.299 |
| 8868 | 513.949 |
| 8869 | 514.949 |
| 8870 | 515.949 |
| 8871 | 513.899 |
| 8872 | 514.899 |
| 8873 | 515.879 |
| 8874 | 516.859 |
| 8875 | 517.859 |
| 8876 | 514.559 |
| 8877 | 515.559 |
| 8878 | 516.559 |
| 8879 | 515.139 |
| 8880 | 513.759 |
| 8881 | 512.279 |
| 8882 | 513.279 |
| 8883 | 514.279 |
| 8884 | 512.029 |
| 8885 | 513.029 |
| 8886 | 511.869 |
| 8887 | 512.869 |
| 8888 | 511.362 |
| 8889 | 512.354 |
| 8890 | 513.347 |
| 8891 | 514.339 |
| 8892 | 513.209 |
| 8893 | 514.199 |
| 8894 | 515.189 |
| 8895 | 516.179 |
| 8896 | 517.172 |
| 8897 | 515.684 |
| 8898 | 516.677 |
| 8899 | 517.669 |
| 8900 | 518.649 |
| 8901 | 519.629 |
| 8902 | 520.609 |
| 8903 | 521.589 |
| 8904 | 522.569 |
| 8905 | 523.549 |
| 8906 | 524.549 |
| 8907 | 520.549 |
| 8908 | 521.529 |
| 8909 | 522.509 |
| 8910 | 523.489 |
| 8911 | 524.489 |
| 8912 | 521.739 |
| 8913 | 522.739 |
| 8914 | 523.739 |
| 8915 | 524.739 |
| 8916 | 519.839 |
| 8917 | 520.819 |
| 8918 | 521.799 |
| 8919 | 522.779 |
| 8920 | 523.759 |
| 8921 | 524.739 |
| 8922 | 525.719 |
| 8923 | 524.279 |
| 8924 | 525.279 |
| 8925 | 526.274 |
| 8926 | 527.269 |
| 8927 | 528.264 |
| 8928 | 526.059 |
| 8929 | 524.479 |
| 8930 | 525.479 |
| 8931 | 526.479 |
| 8932 | 524.539 |
| 8933 | 525.539 |
| 8934 | 523.489 |
| 8935 | 524.489 |
| 8936 | 525.469 |
| 8937 | 526.449 |
| 8938 | 527.429 |
| 8939 | 528.409 |
| 8940 | 529.389 |
| 8941 | 530.369 |
| 8942 | 531.349 |
| 8943 | 530.229 |
| 8944 | 526.629 |
| 8945 | 525.222 |
| 8946 | 526.214 |
| 8947 | 527.207 |
| 8948 | 528.199 |
| 8949 | 526.719 |
| 8950 | 527.719 |
| 8951 | 528.699 |
| 8952 | 529.679 |
| 8953 | 530.659 |
| 8954 | 531.639 |
| 8955 | 530.519 |
| 8956 | 531.519 |
| 8957 | 530.359 |
| 8958 | 529.119 |
| 8959 | 530.119 |
| 8960 | 531.119 |
| 8961 | 529.556 |
| 8962 | 530.553 |
| 8963 | 531.549 |
| 8964 | 530.266 |
| 8965 | 531.263 |
| 8966 | 532.259 |
| 8967 | 533.239 |
| 8968 | 534.219 |
| 8969 | 535.219 |
| 8970 | 531.019 |
| 8971 | 532.017 |
| 8972 | 533.014 |
| 8973 | 530.712 |
| 8974 | 531.709 |
| 8975 | 529.829 |
| 8976 | 530.829 |
| 8977 | 531.829 |
| 8978 | 532.809 |
| 8979 | 533.789 |
| 8980 | 534.769 |
| 8981 | 535.749 |
| 8982 | 536.729 |
| 8983 | 534.529 |
| 8984 | 532.079 |
| 8985 | 533.079 |
| 8986 | 534.079 |
| 8987 | 535.059 |
| 8988 | 536.039 |
| 8989 | 537.019 |
| 8990 | 537.999 |
| 8991 | 538.979 |
| 8992 | 539.959 |
| 8993 | 540.954 |
| 8994 | 541.949 |
| 8995 | 540.004 |
| 8996 | 540.999 |
| 8997 | 541.979 |
| 8998 | 542.959 |
| 8999 | 543.939 |
| 9000 | 544.919 |
| 9001 | 545.919 |
| 9002 | 544.019 |
| 9003 | 542.099 |
| 9004 | 543.099 |
| 9005 | 544.099 |
| 9006 | 545.099 |
| 9007 | 542.149 |
| 9008 | 543.149 |
| 9009 | 541.049 |
| 9010 | 542.049 |
| 9011 | 543.049 |
| 9012 | 544.049 |
| 9013 | 542.429 |
| 9014 | 540.789 |
| 9015 | 541.789 |
| 9016 | 540.683 |
| 9017 | 541.676 |
| 9018 | 542.669 |
| 9019 | 540.469 |
| 9020 | 541.469 |
| 9021 | 542.469 |
| 9022 | 543.449 |
| 9023 | 544.429 |
| 9024 | 543.149 |
| 9025 | 544.149 |
| 9026 | 542.969 |
| 9027 | 541.389 |
| 9028 | 542.389 |
| 9029 | 543.369 |
| 9030 | 544.349 |
| 9031 | 545.349 |
| 9032 | 543.889 |
| 9033 | 541.989 |
| 9034 | 542.969 |
| 9035 | 543.949 |
| 9036 | 544.929 |
| 9037 | 545.909 |
| 9038 | 543.759 |
| 9039 | 544.759 |
| 9040 | 545.759 |
| 9041 | 544.519 |
| 9042 | 545.519 |
| 9043 | 543.659 |
| 9044 | 544.657 |
| 9045 | 545.654 |
| 9046 | 542.952 |
| 9047 | 543.949 |
| 9048 | 542.402 |
| 9049 | 543.394 |
| 9050 | 544.387 |
| 9051 | 545.379 |
| 9052 | 546.359 |
| 9053 | 547.339 |
| 9054 | 548.319 |
| 9055 | 549.299 |
| 9056 | 550.279 |
| 9057 | 551.259 |
| 9058 | 552.239 |
| 9059 | 553.219 |
| 9060 | 554.212 |
| 9061 | 552.664 |
| 9062 | 553.657 |
| 9063 | 554.649 |
| 9064 | 555.629 |
| 9065 | 556.609 |
| 9066 | 557.609 |
| 9067 | 554.309 |
| 9068 | 555.289 |
| 9069 | 556.269 |
| 9070 | 557.249 |
| 9071 | 558.229 |
| 9072 | 559.209 |
| 9073 | 560.189 |
| 9074 | 558.886 |
| 9075 | 559.883 |
| 9076 | 560.879 |
| 9077 | 561.859 |
| 9078 | 562.839 |
| 9079 | 563.819 |
| 9080 | 562.419 |
| 9081 | 560.519 |
| 9082 | 561.519 |
| 9083 | 560.439 |
| 9084 | 558.559 |
| 9085 | 559.559 |
| 9086 | 558.393 |
| 9087 | 559.386 |
| 9088 | 560.379 |
| 9089 | 561.359 |
| 9090 | 562.339 |
| 9091 | 561.179 |
| 9092 | 562.179 |
| 9093 | 563.159 |
| 9094 | 564.139 |
| 9095 | 565.119 |
| 9096 | 566.099 |
| 9097 | 567.079 |
| 9098 | 568.059 |
| 9099 | 569.052 |
| 9100 | 567.484 |
| 9101 | 568.477 |
| 9102 | 569.469 |
| 9103 | 567.802 |
| 9104 | 568.794 |
| 9105 | 569.787 |
| 9106 | 570.779 |
| 9107 | 571.779 |
| 9108 | 568.779 |
| 9109 | 569.779 |
| 9110 | 568.292 |
| 9111 | 569.284 |
| 9112 | 570.277 |
| 9113 | 571.269 |
| 9114 | 570.169 |
| 9115 | 568.119 |
| 9116 | 569.119 |
| 9117 | 570.119 |
| 9118 | 568.799 |
| 9119 | 567.059 |
| 9120 | 568.059 |
| 9121 | 569.039 |
| 9122 | 570.019 |
| 9123 | 570.999 |
| 9124 | 571.979 |
| 9125 | 572.976 |
| 9126 | 571.233 |
| 9127 | 572.229 |
| 9128 | 573.229 |
| 9129 | 574.229 |
| 9130 | 571.429 |
| 9131 | 572.409 |
| 9132 | 573.389 |
| 9133 | 574.389 |
| 9134 | 571.389 |
| 9135 | 572.369 |
| 9136 | 573.349 |
| 9137 | 574.329 |
| 9138 | 575.309 |
| 9139 | 576.302 |
| 9140 | 574.934 |
| 9141 | 575.927 |
| 9142 | 576.919 |
| 9143 | 577.899 |
| 9144 | 578.879 |
| 9145 | 579.859 |
| 9146 | 578.252 |
| 9147 | 579.244 |
| 9148 | 580.237 |
| 9149 | 581.229 |
| 9150 | 582.209 |
| 9151 | 583.189 |
| 9152 | 581.786 |
| 9153 | 582.783 |
| 9154 | 583.779 |
| 9155 | 584.774 |
| 9156 | 585.769 |
| 9157 | 583.614 |
| 9158 | 584.609 |
| 9159 | 583.246 |
| 9160 | 584.243 |
| 9161 | 585.239 |
| 9162 | 586.234 |
| 9163 | 587.229 |
| 9164 | 585.304 |
| 9165 | 586.299 |
| 9166 | 585.039 |
| 9167 | 586.039 |
| 9168 | 583.889 |
| 9169 | 584.889 |
| 9170 | 585.869 |
| 9171 | 586.849 |
| 9172 | 585.166 |
| 9173 | 586.163 |
| 9174 | 587.159 |
| 9175 | 585.892 |
| 9176 | 586.884 |
| 9177 | 587.877 |
| 9178 | 588.869 |
| 9179 | 586.614 |
| 9180 | 587.609 |
| 9181 | 588.604 |
| 9182 | 589.599 |
| 9183 | 590.593 |
| 9184 | 591.586 |
| 9185 | 590.359 |
| 9186 | 589.273 |
| 9187 | 590.266 |
| 9188 | 591.259 |
| 9189 | 590.219 |
| 9190 | 589.099 |
| 9191 | 590.099 |
| 9192 | 588.396 |
| 9193 | 589.393 |
| 9194 | 590.389 |
| 9195 | 591.389 |
| 9196 | 588.889 |
| 9197 | 589.889 |
| 9198 | 588.809 |
| 9199 | 589.809 |
| 9200 | 590.789 |
| 9201 | 591.769 |
| 9202 | 592.749 |
| 9203 | 593.749 |
| 9204 | 591.049 |
| 9205 | 589.346 |
| 9206 | 590.343 |
| 9207 | 591.339 |
| 9208 | 592.339 |
| 9209 | 593.339 |
| 9210 | 590.339 |
| 9211 | 591.319 |
| 9212 | 592.299 |
| 9213 | 591.219 |
| 9214 | 592.219 |
| 9215 | 588.519 |
| 9216 | 589.499 |
| 9217 | 590.479 |
| 9218 | 589.119 |
| 9219 | 587.759 |
| 9220 | 588.759 |
| 9221 | 589.759 |
| 9222 | 588.439 |
| 9223 | 586.239 |
| 9224 | 587.239 |
| 9225 | 585.659 |
| 9226 | 586.659 |
| 9227 | 584.509 |
| 9228 | 585.509 |
| 9229 | 586.489 |
| 9230 | 587.469 |
| 9231 | 588.469 |
| 9232 | 589.469 |
| 9233 | 586.469 |
| 9234 | 584.806 |
| 9235 | 585.803 |
| 9236 | 586.799 |
| 9237 | 585.633 |
| 9238 | 586.626 |
| 9239 | 587.619 |
| 9240 | 588.599 |
| 9241 | 589.579 |
| 9242 | 590.559 |
| 9243 | 591.552 |
| 9244 | 590.124 |
| 9245 | 591.117 |
| 9246 | 592.109 |
| 9247 | 593.089 |
| 9248 | 594.069 |
| 9249 | 595.049 |
| 9250 | 593.749 |
| 9251 | 594.749 |
| 9252 | 595.729 |
| 9253 | 596.709 |
| 9254 | 597.689 |
| 9255 | 598.669 |
| 9256 | 599.649 |
| 9257 | 600.629 |
| 9258 | 601.609 |
| 9259 | 602.609 |
| 9260 | 601.429 |
| 9261 | 598.029 |
| 9262 | 599.009 |
| 9263 | 599.989 |
| 9264 | 600.969 |
| 9265 | 599.889 |
| 9266 | 600.889 |
| 9267 | 601.869 |
| 9268 | 602.849 |
| 9269 | 600.869 |
| 9270 | 601.869 |
| 9271 | 602.869 |
| 9272 | 603.869 |
| 9273 | 600.969 |
| 9274 | 598.119 |
| 9275 | 599.119 |
| 9276 | 600.119 |
| 9277 | 597.969 |
| 9278 | 596.502 |
| 9279 | 597.494 |
| 9280 | 598.487 |
| 9281 | 599.479 |
| 9282 | 600.459 |
| 9283 | 601.439 |
| 9284 | 598.837 |
| 9285 | 599.834 |
| 9286 | 600.832 |
| 9287 | 601.829 |
| 9288 | 600.326 |
| 9289 | 601.323 |
| 9290 | 602.319 |
| 9291 | 601.289 |
| 9292 | 602.279 |
| 9293 | 603.269 |
| 9294 | 604.259 |
| 9295 | 603.099 |
| 9296 | 604.099 |
| 9297 | 605.094 |
| 9298 | 603.129 |
| 9299 | 604.124 |
| 9300 | 605.119 |
| 9301 | 606.114 |
| 9302 | 607.109 |
| 9303 | 608.104 |
| 9304 | 606.099 |
| 9305 | 607.099 |
| 9306 | 604.549 |
| 9307 | 605.529 |
| 9308 | 606.509 |
| 9309 | 605.069 |
| 9310 | 603.189 |
| 9311 | 601.089 |
| 9312 | 602.089 |
| 9313 | 599.539 |
| 9314 | 600.539 |
| 9315 | 597.839 |
| 9316 | 598.839 |
| 9317 | 599.839 |
| 9318 | 594.939 |
| 9319 | 595.919 |
| 9320 | 596.899 |
| 9321 | 594.849 |
| 9322 | 595.849 |
| 9323 | 594.489 |
| 9324 | 595.489 |
| 9325 | 596.484 |
| 9326 | 597.479 |
| 9327 | 595.374 |
| 9328 | 596.369 |
| 9329 | 597.349 |
| 9330 | 598.329 |
| 9331 | 599.309 |
| 9332 | 600.289 |
| 9333 | 601.269 |
| 9334 | 602.249 |
| 9335 | 603.229 |
| 9336 | 601.369 |
| 9337 | 602.369 |
| 9338 | 600.119 |
| 9339 | 601.119 |
| 9340 | 600.069 |
| 9341 | 601.059 |
| 9342 | 602.049 |
| 9343 | 603.039 |
| 9344 | 604.019 |
| 9345 | 604.999 |
| 9346 | 605.999 |
| 9347 | 606.999 |
| 9348 | 603.699 |
| 9349 | 604.699 |
| 9350 | 603.459 |
| 9351 | 601.759 |
| 9352 | 599.919 |
| 9353 | 600.919 |
| 9354 | 601.919 |
| 9355 | 602.914 |
| 9356 | 600.759 |
| 9357 | 601.754 |
| 9358 | 602.749 |
| 9359 | 603.729 |
| 9360 | 604.709 |
| 9361 | 603.409 |
| 9362 | 604.409 |
| 9363 | 605.407 |
| 9364 | 602.754 |
| 9365 | 603.752 |
| 9366 | 604.749 |
| 9367 | 605.729 |
| 9368 | 606.709 |
| 9369 | 607.709 |
| 9370 | 605.159 |
| 9371 | 606.159 |
| 9372 | 607.159 |
| 9373 | 608.159 |
| 9374 | 603.159 |
| 9375 | 604.139 |
| 9376 | 605.119 |
| 9377 | 606.119 |
| 9378 | 607.119 |
| 9379 | 604.919 |
| 9380 | 605.899 |
| 9381 | 606.879 |
| 9382 | 607.859 |
| 9383 | 606.699 |
| 9384 | 607.699 |
| 9385 | 605.449 |
| 9386 | 606.449 |
| 9387 | 607.449 |
| 9388 | 606.429 |
| 9389 | 604.809 |
| 9390 | 605.809 |
| 9391 | 606.809 |
| 9392 | 605.789 |
| 9393 | 606.769 |
| 9394 | 607.749 |
| 9395 | 608.729 |
| 9396 | 609.709 |
| 9397 | 610.689 |
| 9398 | 611.669 |
| 9399 | 612.649 |
| 9400 | 613.629 |
| 9401 | 614.609 |
| 9402 | 612.559 |
| 9403 | 613.559 |
| 9404 | 614.559 |
| 9405 | 613.279 |
| 9406 | 611.979 |
| 9407 | 612.979 |
| 9408 | 613.979 |
| 9409 | 614.979 |
| 9410 | 613.239 |
| 9411 | 610.839 |
| 9412 | 611.839 |
| 9413 | 610.539 |
| 9414 | 611.539 |
| 9415 | 612.519 |
| 9416 | 613.499 |
| 9417 | 612.236 |
| 9418 | 613.233 |
| 9419 | 614.229 |
| 9420 | 615.229 |
| 9421 | 612.129 |
| 9422 | 613.109 |
| 9423 | 614.089 |
| 9424 | 612.859 |
| 9425 | 613.849 |
| 9426 | 614.839 |
| 9427 | 615.829 |
| 9428 | 616.829 |
| 9429 | 617.829 |
| 9430 | 618.829 |
| 9431 | 615.229 |
| 9432 | 613.962 |
| 9433 | 614.954 |
| 9434 | 615.947 |
| 9435 | 616.939 |
| 9436 | 617.939 |
| 9437 | 618.939 |
| 9438 | 614.439 |
| 9439 | 615.439 |
| 9440 | 616.439 |
| 9441 | 614.289 |
| 9442 | 615.289 |
| 9443 | 616.284 |
| 9444 | 617.279 |
| 9445 | 618.274 |
| 9446 | 616.219 |
| 9447 | 617.219 |
| 9448 | 618.219 |
| 9449 | 615.119 |
| 9450 | 616.099 |
| 9451 | 617.079 |
| 9452 | 618.059 |
| 9453 | 619.039 |
| 9454 | 620.019 |
| 9455 | 621.016 |
| 9456 | 619.413 |
| 9457 | 620.409 |
| 9458 | 621.409 |
| 9459 | 616.409 |
| 9460 | 617.389 |
| 9461 | 618.369 |
| 9462 | 619.349 |
| 9463 | 620.349 |
| 9464 | 618.099 |
| 9465 | 616.356 |
| 9466 | 617.353 |
| 9467 | 618.349 |
| 9468 | 619.349 |
| 9469 | 615.749 |
| 9470 | 616.749 |
| 9471 | 615.409 |
| 9472 | 616.409 |
| 9473 | 615.183 |
| 9474 | 616.176 |
| 9475 | 617.169 |
| 9476 | 618.169 |
| 9477 | 616.019 |
| 9478 | 617.019 |
| 9479 | 617.999 |
| 9480 | 618.979 |
| 9481 | 619.959 |
| 9482 | 620.939 |
| 9483 | 621.919 |
| 9484 | 622.919 |
| 9485 | 623.919 |
| 9486 | 624.919 |
| 9487 | 619.919 |
| 9488 | 620.899 |
| 9489 | 621.879 |
| 9490 | 622.879 |
| 9491 | 619.179 |
| 9492 | 620.159 |
| 9493 | 621.139 |
| 9494 | 622.134 |
| 9495 | 623.129 |
| 9496 | 621.074 |
| 9497 | 622.069 |
| 9498 | 623.069 |
| 9499 | 620.669 |
| 9500 | 621.669 |
| 9501 | 616.669 |
| 9502 | 615.589 |
| 9503 | 613.089 |
| 9504 | 611.489 |
| 9505 | 612.489 |
| 9506 | 609.489 |
| 9507 | 608.489 |
| 9508 | 609.489 |
| 9509 | 606.289 |
| 9510 | 607.289 |
| 9511 | 608.289 |
| 9512 | 605.089 |
| 9513 | 603.209 |
| 9514 | 604.209 |
| 9515 | 605.209 |
| 9516 | 606.209 |
| 9517 | 602.709 |
| 9518 | 603.709 |
| 9519 | 602.589 |
| 9520 | 600.989 |
| 9521 | 601.989 |
| 9522 | 602.969 |
| 9523 | 603.949 |
| 9524 | 604.949 |
| 9525 | 601.849 |
| 9526 | 602.829 |
| 9527 | 603.809 |
| 9528 | 602.609 |
| 9529 | 600.809 |
| 9530 | 601.809 |
| 9531 | 599.949 |
| 9532 | 600.949 |
| 9533 | 601.949 |
| 9534 | 602.949 |
| 9535 | 601.349 |
| 9536 | 599.199 |
| 9537 | 600.199 |
| 9538 | 601.179 |
| 9539 | 602.159 |
| 9540 | 603.139 |
| 9541 | 604.119 |
| 9542 | 605.099 |
| 9543 | 606.079 |
| 9544 | 607.059 |
| 9545 | 608.039 |
| 9546 | 609.039 |
| 9547 | 606.839 |
| 9548 | 605.296 |
| 9549 | 606.293 |
| 9550 | 607.289 |
| 9551 | 608.282 |
| 9552 | 606.654 |
| 9553 | 607.647 |
| 9554 | 608.639 |
| 9555 | 606.389 |
| 9556 | 607.389 |
| 9557 | 608.389 |
| 9558 | 609.389 |
| 9559 | 606.539 |
| 9560 | 607.539 |
| 9561 | 608.519 |
| 9562 | 609.499 |
| 9563 | 610.479 |
| 9564 | 611.459 |
| 9565 | 612.459 |
| 9566 | 609.059 |
| 9567 | 610.039 |
| 9568 | 611.019 |
| 9569 | 611.999 |
| 9570 | 612.979 |
| 9571 | 613.959 |
| 9572 | 614.939 |
| 9573 | 615.919 |
| 9574 | 616.899 |
| 9575 | 617.879 |
| 9576 | 618.859 |
| 9577 | 619.839 |
| 9578 | 620.819 |
| 9579 | 621.799 |
| 9580 | 622.779 |
| 9581 | 621.499 |
| 9582 | 622.499 |
| 9583 | 621.199 |
| 9584 | 619.739 |
| 9585 | 620.739 |
| 9586 | 617.639 |
| 9587 | 615.584 |
| 9588 | 616.579 |
| 9589 | 617.574 |
| 9590 | 618.569 |
| 9591 | 619.549 |
| 9592 | 620.529 |
| 9593 | 621.529 |
| 9594 | 619.479 |
| 9595 | 620.476 |
| 9596 | 621.473 |
| 9597 | 619.929 |
| 9598 | 618.049 |
| 9599 | 619.049 |
| 9600 | 620.049 |
| 9601 | 621.029 |
| 9602 | 622.009 |
| 9603 | 622.989 |
| 9604 | 623.969 |
| 9605 | 624.949 |
| 9606 | 625.929 |
| 9607 | 626.909 |
| 9608 | 627.889 |
| 9609 | 626.462 |
| 9610 | 627.454 |
| 9611 | 628.447 |
| 9612 | 629.439 |
| 9613 | 627.956 |
| 9614 | 628.953 |
| 9615 | 629.949 |
| 9616 | 630.929 |
| 9617 | 631.909 |
| 9618 | 632.889 |
| 9619 | 633.889 |
| 9620 | 631.639 |
| 9621 | 632.639 |
| 9622 | 633.619 |
| 9623 | 634.599 |
| 9624 | 635.579 |
| 9625 | 636.559 |
| 9626 | 635.019 |
| 9627 | 636.019 |
| 9628 | 637.016 |
| 9629 | 635.473 |
| 9630 | 636.469 |
| 9631 | 635.309 |
| 9632 | 636.309 |
| 9633 | 637.309 |
| 9634 | 634.959 |
| 9635 | 635.939 |
| 9636 | 636.919 |
| 9637 | 637.919 |
| 9638 | 638.919 |
| 9639 | 634.019 |
| 9640 | 635.019 |
| 9641 | 632.019 |
| 9642 | 631.019 |
| 9643 | 632.019 |
| 9644 | 630.219 |
| 9645 | 627.469 |
| 9646 | 628.469 |
| 9647 | 629.449 |
| 9648 | 630.429 |
| 9649 | 631.429 |
| 9650 | 629.379 |
| 9651 | 630.379 |
| 9652 | 631.359 |
| 9653 | 632.339 |
| 9654 | 633.339 |
| 9655 | 634.339 |
| 9656 | 631.039 |
| 9657 | 629.552 |
| 9658 | 630.544 |
| 9659 | 631.537 |
| 9660 | 632.529 |
| 9661 | 633.529 |
| 9662 | 631.729 |
| 9663 | 632.729 |
| 9664 | 629.629 |
| 9665 | 628.529 |
| 9666 | 629.529 |
| 9667 | 628.189 |
| 9668 | 626.269 |
| 9669 | 627.249 |
| 9670 | 628.229 |
| 9671 | 629.209 |
| 9672 | 630.189 |
| 9673 | 631.169 |
| 9674 | 632.149 |
| 9675 | 633.129 |
| 9676 | 634.129 |
| 9677 | 632.849 |
| 9678 | 631.409 |
| 9679 | 632.409 |
| 9680 | 633.389 |
| 9681 | 634.369 |
| 9682 | 635.349 |
| 9683 | 633.962 |
| 9684 | 634.954 |
| 9685 | 635.947 |
| 9686 | 636.939 |
| 9687 | 637.939 |
| 9688 | 635.839 |
| 9689 | 636.839 |
| 9690 | 637.819 |
| 9691 | 638.799 |
| 9692 | 639.799 |
| 9693 | 638.279 |
| 9694 | 633.979 |
| 9695 | 634.979 |
| 9696 | 632.879 |
| 9697 | 633.879 |
| 9698 | 634.859 |
| 9699 | 635.839 |
| 9700 | 634.539 |
| 9701 | 635.539 |
| 9702 | 636.519 |
| 9703 | 637.499 |
| 9704 | 638.499 |
| 9705 | 636.099 |
| 9706 | 637.099 |
| 9707 | 635.756 |
| 9708 | 636.753 |
| 9709 | 637.749 |
| 9710 | 638.749 |
| 9711 | 639.749 |
| 9712 | 637.949 |
| 9713 | 633.549 |
| 9714 | 634.529 |
| 9715 | 635.509 |
| 9716 | 636.489 |
| 9717 | 637.469 |
| 9718 | 638.449 |
| 9719 | 639.429 |
| 9720 | 640.409 |
| 9721 | 638.666 |
| 9722 | 639.663 |
| 9723 | 640.659 |
| 9724 | 641.659 |
| 9725 | 639.999 |
| 9726 | 640.999 |
| 9727 | 636.499 |
| 9728 | 635.249 |
| 9729 | 636.239 |
| 9730 | 637.229 |
| 9731 | 638.219 |
| 9732 | 639.199 |
| 9733 | 640.179 |
| 9734 | 641.159 |
| 9735 | 642.139 |
| 9736 | 643.119 |
| 9737 | 641.214 |
| 9738 | 642.209 |
| 9739 | 643.204 |
| 9740 | 644.199 |
| 9741 | 642.599 |
| 9742 | 643.599 |
| 9743 | 642.353 |
| 9744 | 643.346 |
| 9745 | 644.339 |
| 9746 | 643.339 |
| 9747 | 641.899 |
| 9748 | 642.899 |
| 9749 | 641.799 |
| 9750 | 642.799 |
| 9751 | 643.799 |
| 9752 | 641.349 |
| 9753 | 642.347 |
| 9754 | 643.344 |
| 9755 | 640.592 |
| 9756 | 641.589 |
| 9757 | 642.586 |
| 9758 | 641.183 |
| 9759 | 642.179 |
| 9760 | 643.159 |
| 9761 | 644.139 |
| 9762 | 645.119 |
| 9763 | 646.099 |
| 9764 | 647.079 |
| 9765 | 645.179 |
| 9766 | 646.179 |
| 9767 | 647.159 |
| 9768 | 648.139 |
| 9769 | 646.739 |
| 9770 | 647.739 |
| 9771 | 646.539 |
| 9772 | 647.539 |
| 9773 | 648.519 |
| 9774 | 649.499 |
| 9775 | 650.499 |
| 9776 | 647.099 |
| 9777 | 648.097 |
| 9778 | 649.094 |
| 9779 | 646.742 |
| 9780 | 647.739 |
| 9781 | 648.739 |
| 9782 | 649.739 |
| 9783 | 646.989 |
| 9784 | 645.923 |
| 9785 | 646.916 |
| 9786 | 647.909 |
| 9787 | 646.709 |
| 9788 | 647.709 |
| 9789 | 648.689 |
| 9790 | 649.669 |
| 9791 | 650.663 |
| 9792 | 649.416 |
| 9793 | 650.409 |
| 9794 | 647.509 |
| 9795 | 648.509 |
| 9796 | 649.509 |
| 9797 | 650.509 |
| 9798 | 647.109 |
| 9799 | 645.249 |
| 9800 | 646.249 |
| 9801 | 645.229 |
| 9802 | 646.229 |
| 9803 | 647.229 |
| 9804 | 644.829 |
| 9805 | 645.829 |
| 9806 | 643.779 |
| 9807 | 644.779 |
| 9808 | 645.779 |
| 9809 | 643.959 |
| 9810 | 644.959 |
| 9811 | 645.959 |
| 9812 | 644.659 |
| 9813 | 642.659 |
| 9814 | 643.659 |
| 9815 | 644.659 |
| 9816 | 643.359 |
| 9817 | 641.979 |
| 9818 | 642.979 |
| 9819 | 641.199 |
| 9820 | 640.193 |
| 9821 | 641.186 |
| 9822 | 642.179 |
| 9823 | 640.732 |
| 9824 | 641.724 |
| 9825 | 642.717 |
| 9826 | 643.709 |
| 9827 | 644.689 |
| 9828 | 645.669 |
| 9829 | 646.667 |
| 9830 | 647.664 |
| 9831 | 645.112 |
| 9832 | 646.109 |
| 9833 | 647.089 |
| 9834 | 648.069 |
| 9835 | 649.049 |
| 9836 | 650.044 |
| 9837 | 648.199 |
| 9838 | 649.194 |
| 9839 | 650.189 |
| 9840 | 648.909 |
| 9841 | 649.909 |
| 9842 | 650.889 |
| 9843 | 651.869 |
| 9844 | 652.849 |
| 9845 | 653.829 |
| 9846 | 654.809 |
| 9847 | 653.769 |
| 9848 | 650.819 |
| 9849 | 651.819 |
| 9850 | 652.819 |
| 9851 | 653.819 |
| 9852 | 651.369 |
| 9853 | 648.769 |
| 9854 | 649.769 |
| 9855 | 650.749 |
| 9856 | 651.729 |
| 9857 | 652.709 |
| 9858 | 653.709 |
| 9859 | 654.709 |
| 9860 | 652.259 |
| 9861 | 653.259 |
| 9862 | 650.709 |
| 9863 | 651.709 |
| 9864 | 652.689 |
| 9865 | 653.669 |
| 9866 | 652.329 |
| 9867 | 653.329 |
| 9868 | 651.829 |
| 9869 | 652.829 |
| 9870 | 651.489 |
| 9871 | 652.489 |
| 9872 | 650.609 |
| 9873 | 649.489 |
| 9874 | 648.269 |
| 9875 | 649.269 |
| 9876 | 648.169 |
| 9877 | 649.169 |
| 9878 | 650.169 |
| 9879 | 645.969 |
| 9880 | 646.966 |
| 9881 | 645.603 |
| 9882 | 646.599 |
| 9883 | 647.599 |
| 9884 | 645.919 |
| 9885 | 644.179 |
| 9886 | 645.179 |
| 9887 | 646.159 |
| 9888 | 647.139 |
| 9889 | 648.139 |
| 9890 | 646.379 |
| 9891 | 647.379 |
| 9892 | 644.879 |
| 9893 | 645.879 |
| 9894 | 646.879 |
| 9895 | 647.879 |
| 9896 | 643.779 |
| 9897 | 642.359 |
| 9898 | 640.759 |
| 9899 | 641.759 |
| 9900 | 639.609 |
| 9901 | 640.609 |
| 9902 | 638.669 |
| 9903 | 639.669 |
| 9904 | 640.649 |
| 9905 | 641.629 |
| 9906 | 642.629 |
| 9907 | 640.769 |
| 9908 | 641.749 |
| 9909 | 642.729 |
| 9910 | 643.709 |
| 9911 | 644.689 |
| 9912 | 645.669 |
| 9913 | 646.649 |
| 9914 | 647.629 |
| 9915 | 648.609 |
| 9916 | 649.589 |
| 9917 | 650.589 |
| 9918 | 651.589 |
| 9919 | 648.189 |
| 9920 | 649.189 |
| 9921 | 650.169 |
| 9922 | 651.149 |
| 9923 | 652.129 |
| 9924 | 653.109 |
| 9925 | 654.089 |
| 9926 | 655.069 |
| 9927 | 656.049 |
| 9928 | 657.047 |
| 9929 | 658.044 |
| 9930 | 655.692 |
| 9931 | 656.689 |
| 9932 | 657.689 |
| 9933 | 658.689 |
| 9934 | 659.689 |
| 9935 | 656.589 |
| 9936 | 657.569 |
| 9937 | 658.549 |
| 9938 | 656.549 |
| 9939 | 657.549 |
| 9940 | 655.744 |
| 9941 | 656.739 |
| 9942 | 657.734 |
| 9943 | 658.729 |
| 9944 | 659.729 |
| 9945 | 656.129 |
| 9946 | 657.109 |
| 9947 | 658.089 |
| 9948 | 659.089 |
| 9949 | 660.089 |
| 9950 | 657.789 |
| 9951 | 658.769 |
| 9952 | 659.749 |
| 9953 | 658.189 |
| 9954 | 656.449 |
| 9955 | 657.449 |
| 9956 | 658.449 |
| 9957 | 659.429 |
| 9958 | 660.409 |
| 9959 | 661.389 |
| 9960 | 662.369 |
| 9961 | 663.369 |
| 9962 | 664.369 |
| 9963 | 660.069 |
| 9964 | 658.806 |
| 9965 | 659.803 |
| 9966 | 660.799 |
| 9967 | 659.039 |
| 9968 | 660.039 |
| 9969 | 661.039 |
| 9970 | 662.039 |
| 9971 | 658.039 |
| 9972 | 656.576 |
| 9973 | 657.573 |
| 9974 | 658.569 |
| 9975 | 659.569 |
| 9976 | 657.069 |
| 9977 | 658.069 |
| 9978 | 659.069 |
| 9979 | 656.419 |
| 9980 | 657.419 |
| 9981 | 655.119 |
| 9982 | 654.029 |
| 9983 | 655.019 |
| 9984 | 656.009 |
| 9985 | 656.999 |
| 9986 | 657.979 |
| 9987 | 658.959 |
| 9988 | 657.879 |
| 9989 | 658.879 |
| 9990 | 653.979 |
| 9991 | 654.959 |
| 9992 | 655.939 |
| 9993 | 654.659 |
| 9994 | 655.659 |
| 9995 | 653.209 |
| 9996 | 654.209 |
| 9997 | 655.189 |
| 9998 | 656.169 |
| 9999 | 657.149 |
| 10000 | 658.129 |
| 10001 | 659.109 |
| 10002 | 660.089 |
| 10003 | 661.089 |
| 10004 | 659.039 |
| 10005 | 660.039 |
| 10006 | 661.039 |
| 10007 | 656.539 |
| 10008 | 657.519 |
| 10009 | 658.499 |
| 10010 | 659.494 |
| 10011 | 657.489 |
| 10012 | 658.484 |
| 10013 | 659.479 |
| 10014 | 657.736 |
| 10015 | 658.733 |
| 10016 | 659.729 |
| 10017 | 660.729 |
| 10018 | 659.149 |
| 10019 | 656.649 |
| 10020 | 657.649 |
| 10021 | 656.182 |
| 10022 | 657.174 |
| 10023 | 658.167 |
| 10024 | 659.159 |
| 10025 | 657.959 |
| 10026 | 653.559 |
| 10027 | 654.559 |
| 10028 | 655.539 |
| 10029 | 656.519 |
| 10030 | 653.969 |
| 10031 | 654.969 |
| 10032 | 655.969 |
| 10033 | 656.969 |
| 10034 | 657.969 |
| 10035 | 654.269 |
| 10036 | 655.269 |
| 10037 | 653.269 |
| 10038 | 654.269 |
| 10039 | 655.262 |
| 10040 | 653.634 |
| 10041 | 654.627 |
| 10042 | 655.619 |
| 10043 | 656.599 |
| 10044 | 657.579 |
| 10045 | 658.559 |
| 10046 | 659.539 |
| 10047 | 660.539 |
| 10048 | 657.589 |
| 10049 | 655.749 |
| 10050 | 656.749 |
| 10051 | 657.749 |
| 10052 | 655.399 |
| 10053 | 656.379 |
| 10054 | 657.359 |
| 10055 | 658.339 |
| 10056 | 659.319 |
| 10057 | 660.299 |